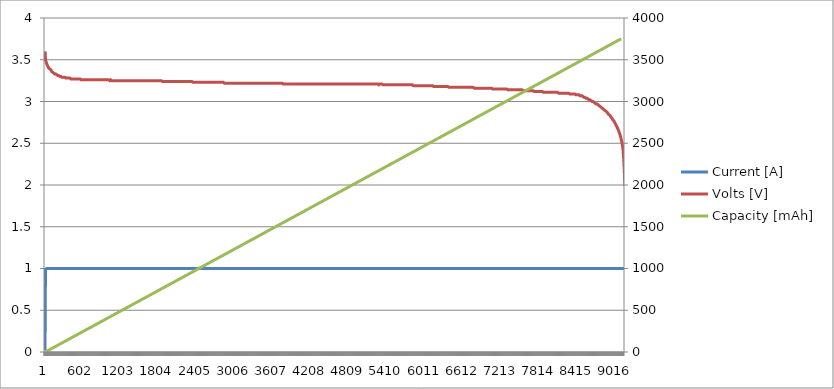
| Category | Current [A] | Volts [V] |
|---|---|---|
| 0 | 0.02 | 3.6 |
| 1 | 0.16 | 3.59 |
| 2 | 0.3 | 3.58 |
| 3 | 0.44 | 3.56 |
| 4 | 0.58 | 3.55 |
| 5 | 0.72 | 3.54 |
| 6 | 0.85 | 3.52 |
| 7 | 0.99 | 3.51 |
| 8 | 1 | 3.5 |
| 9 | 1 | 3.5 |
| 10 | 1 | 3.5 |
| 11 | 1 | 3.49 |
| 12 | 1 | 3.49 |
| 13 | 1 | 3.49 |
| 14 | 1 | 3.48 |
| 15 | 1 | 3.48 |
| 16 | 1 | 3.48 |
| 17 | 1 | 3.48 |
| 18 | 1 | 3.48 |
| 19 | 1 | 3.47 |
| 20 | 1 | 3.47 |
| 21 | 1 | 3.47 |
| 22 | 1 | 3.47 |
| 23 | 1 | 3.46 |
| 24 | 1 | 3.46 |
| 25 | 1 | 3.46 |
| 26 | 1 | 3.46 |
| 27 | 1 | 3.46 |
| 28 | 1 | 3.45 |
| 29 | 1 | 3.45 |
| 30 | 1 | 3.45 |
| 31 | 1 | 3.45 |
| 32 | 1 | 3.45 |
| 33 | 1 | 3.44 |
| 34 | 1 | 3.44 |
| 35 | 1 | 3.44 |
| 36 | 1 | 3.44 |
| 37 | 1 | 3.44 |
| 38 | 1 | 3.44 |
| 39 | 1 | 3.43 |
| 40 | 1 | 3.43 |
| 41 | 1 | 3.43 |
| 42 | 1 | 3.43 |
| 43 | 1 | 3.43 |
| 44 | 1 | 3.43 |
| 45 | 1 | 3.42 |
| 46 | 1 | 3.42 |
| 47 | 1 | 3.42 |
| 48 | 1 | 3.42 |
| 49 | 1 | 3.42 |
| 50 | 1 | 3.42 |
| 51 | 1 | 3.42 |
| 52 | 1 | 3.41 |
| 53 | 1 | 3.41 |
| 54 | 1 | 3.41 |
| 55 | 1 | 3.41 |
| 56 | 1 | 3.41 |
| 57 | 1 | 3.41 |
| 58 | 1 | 3.41 |
| 59 | 1 | 3.4 |
| 60 | 1 | 3.4 |
| 61 | 1 | 3.4 |
| 62 | 1 | 3.4 |
| 63 | 1 | 3.4 |
| 64 | 1 | 3.4 |
| 65 | 1 | 3.4 |
| 66 | 1 | 3.4 |
| 67 | 1 | 3.4 |
| 68 | 1 | 3.39 |
| 69 | 1 | 3.39 |
| 70 | 1 | 3.39 |
| 71 | 1 | 3.39 |
| 72 | 1 | 3.39 |
| 73 | 1 | 3.39 |
| 74 | 1 | 3.39 |
| 75 | 1 | 3.39 |
| 76 | 1 | 3.39 |
| 77 | 1 | 3.39 |
| 78 | 1 | 3.38 |
| 79 | 1 | 3.38 |
| 80 | 1 | 3.38 |
| 81 | 1 | 3.38 |
| 82 | 1 | 3.38 |
| 83 | 1 | 3.38 |
| 84 | 1 | 3.38 |
| 85 | 1 | 3.38 |
| 86 | 1 | 3.38 |
| 87 | 1 | 3.38 |
| 88 | 1 | 3.38 |
| 89 | 1 | 3.38 |
| 90 | 1 | 3.38 |
| 91 | 1 | 3.38 |
| 92 | 1 | 3.37 |
| 93 | 1 | 3.37 |
| 94 | 1 | 3.37 |
| 95 | 1 | 3.37 |
| 96 | 1 | 3.37 |
| 97 | 1 | 3.37 |
| 98 | 1 | 3.37 |
| 99 | 1 | 3.37 |
| 100 | 1 | 3.37 |
| 101 | 1 | 3.37 |
| 102 | 1 | 3.37 |
| 103 | 1 | 3.37 |
| 104 | 1 | 3.37 |
| 105 | 1 | 3.36 |
| 106 | 1 | 3.36 |
| 107 | 1 | 3.36 |
| 108 | 1 | 3.36 |
| 109 | 1 | 3.36 |
| 110 | 1 | 3.36 |
| 111 | 1 | 3.36 |
| 112 | 1 | 3.36 |
| 113 | 1 | 3.36 |
| 114 | 1 | 3.36 |
| 115 | 1 | 3.36 |
| 116 | 1 | 3.36 |
| 117 | 1 | 3.36 |
| 118 | 1 | 3.35 |
| 119 | 1 | 3.35 |
| 120 | 1 | 3.35 |
| 121 | 1 | 3.35 |
| 122 | 1 | 3.35 |
| 123 | 1 | 3.35 |
| 124 | 1 | 3.35 |
| 125 | 1 | 3.35 |
| 126 | 1 | 3.35 |
| 127 | 1 | 3.35 |
| 128 | 1 | 3.35 |
| 129 | 1 | 3.35 |
| 130 | 1 | 3.35 |
| 131 | 1 | 3.35 |
| 132 | 1 | 3.35 |
| 133 | 1 | 3.35 |
| 134 | 1 | 3.35 |
| 135 | 1 | 3.34 |
| 136 | 1 | 3.34 |
| 137 | 1 | 3.34 |
| 138 | 1 | 3.34 |
| 139 | 1 | 3.34 |
| 140 | 1 | 3.34 |
| 141 | 1 | 3.34 |
| 142 | 1 | 3.34 |
| 143 | 1 | 3.34 |
| 144 | 1 | 3.34 |
| 145 | 1 | 3.34 |
| 146 | 1 | 3.34 |
| 147 | 1 | 3.34 |
| 148 | 1 | 3.34 |
| 149 | 1 | 3.34 |
| 150 | 1 | 3.33 |
| 151 | 1 | 3.33 |
| 152 | 1 | 3.33 |
| 153 | 1 | 3.33 |
| 154 | 1 | 3.33 |
| 155 | 1 | 3.33 |
| 156 | 1 | 3.33 |
| 157 | 1 | 3.33 |
| 158 | 1 | 3.33 |
| 159 | 1 | 3.33 |
| 160 | 1 | 3.33 |
| 161 | 1 | 3.33 |
| 162 | 1 | 3.33 |
| 163 | 1 | 3.33 |
| 164 | 1 | 3.33 |
| 165 | 1 | 3.33 |
| 166 | 1 | 3.33 |
| 167 | 1 | 3.33 |
| 168 | 1 | 3.33 |
| 169 | 1 | 3.33 |
| 170 | 1 | 3.33 |
| 171 | 1 | 3.33 |
| 172 | 1 | 3.32 |
| 173 | 1 | 3.32 |
| 174 | 1 | 3.32 |
| 175 | 1 | 3.32 |
| 176 | 1 | 3.32 |
| 177 | 1 | 3.32 |
| 178 | 1 | 3.32 |
| 179 | 1 | 3.32 |
| 180 | 1 | 3.32 |
| 181 | 1 | 3.32 |
| 182 | 1 | 3.32 |
| 183 | 1 | 3.32 |
| 184 | 1 | 3.32 |
| 185 | 1 | 3.32 |
| 186 | 1 | 3.32 |
| 187 | 1 | 3.32 |
| 188 | 1 | 3.32 |
| 189 | 1 | 3.32 |
| 190 | 1 | 3.32 |
| 191 | 1 | 3.32 |
| 192 | 1 | 3.32 |
| 193 | 1 | 3.32 |
| 194 | 1 | 3.32 |
| 195 | 1 | 3.32 |
| 196 | 1 | 3.31 |
| 197 | 1 | 3.31 |
| 198 | 1 | 3.31 |
| 199 | 1 | 3.31 |
| 200 | 1 | 3.31 |
| 201 | 1 | 3.31 |
| 202 | 1 | 3.31 |
| 203 | 1 | 3.31 |
| 204 | 1 | 3.31 |
| 205 | 1 | 3.31 |
| 206 | 1 | 3.31 |
| 207 | 1 | 3.31 |
| 208 | 1 | 3.31 |
| 209 | 1 | 3.31 |
| 210 | 1 | 3.31 |
| 211 | 1 | 3.31 |
| 212 | 1 | 3.31 |
| 213 | 1 | 3.31 |
| 214 | 1 | 3.31 |
| 215 | 1 | 3.31 |
| 216 | 1 | 3.31 |
| 217 | 1 | 3.31 |
| 218 | 1 | 3.31 |
| 219 | 1 | 3.31 |
| 220 | 1 | 3.31 |
| 221 | 1 | 3.31 |
| 222 | 1 | 3.31 |
| 223 | 1 | 3.31 |
| 224 | 1 | 3.31 |
| 225 | 1 | 3.31 |
| 226 | 1 | 3.31 |
| 227 | 1 | 3.3 |
| 228 | 1 | 3.3 |
| 229 | 1 | 3.3 |
| 230 | 1 | 3.3 |
| 231 | 1 | 3.3 |
| 232 | 1 | 3.3 |
| 233 | 1 | 3.3 |
| 234 | 1 | 3.3 |
| 235 | 1 | 3.3 |
| 236 | 1 | 3.3 |
| 237 | 1 | 3.3 |
| 238 | 1 | 3.3 |
| 239 | 1 | 3.3 |
| 240 | 1 | 3.3 |
| 241 | 1 | 3.3 |
| 242 | 1 | 3.3 |
| 243 | 1 | 3.3 |
| 244 | 1 | 3.3 |
| 245 | 1 | 3.3 |
| 246 | 1 | 3.3 |
| 247 | 1 | 3.3 |
| 248 | 1 | 3.3 |
| 249 | 1 | 3.3 |
| 250 | 1 | 3.3 |
| 251 | 1 | 3.3 |
| 252 | 1 | 3.3 |
| 253 | 1 | 3.3 |
| 254 | 1 | 3.3 |
| 255 | 1 | 3.3 |
| 256 | 1 | 3.3 |
| 257 | 1 | 3.3 |
| 258 | 1 | 3.3 |
| 259 | 1 | 3.3 |
| 260 | 1 | 3.3 |
| 261 | 1 | 3.3 |
| 262 | 1 | 3.3 |
| 263 | 1 | 3.3 |
| 264 | 1 | 3.29 |
| 265 | 1 | 3.29 |
| 266 | 1 | 3.29 |
| 267 | 1 | 3.29 |
| 268 | 1 | 3.29 |
| 269 | 1 | 3.29 |
| 270 | 1 | 3.29 |
| 271 | 1 | 3.29 |
| 272 | 1 | 3.29 |
| 273 | 1 | 3.29 |
| 274 | 1 | 3.29 |
| 275 | 1 | 3.29 |
| 276 | 1 | 3.29 |
| 277 | 1 | 3.29 |
| 278 | 1 | 3.29 |
| 279 | 1 | 3.29 |
| 280 | 1 | 3.29 |
| 281 | 1 | 3.29 |
| 282 | 1 | 3.29 |
| 283 | 1 | 3.29 |
| 284 | 1 | 3.29 |
| 285 | 1 | 3.29 |
| 286 | 1 | 3.29 |
| 287 | 1 | 3.29 |
| 288 | 1 | 3.29 |
| 289 | 1 | 3.29 |
| 290 | 1 | 3.29 |
| 291 | 1 | 3.29 |
| 292 | 1 | 3.29 |
| 293 | 1 | 3.29 |
| 294 | 1 | 3.29 |
| 295 | 1 | 3.29 |
| 296 | 1 | 3.29 |
| 297 | 1 | 3.29 |
| 298 | 1 | 3.29 |
| 299 | 1 | 3.29 |
| 300 | 1 | 3.29 |
| 301 | 1 | 3.29 |
| 302 | 1 | 3.29 |
| 303 | 1 | 3.29 |
| 304 | 1 | 3.29 |
| 305 | 1 | 3.29 |
| 306 | 1 | 3.29 |
| 307 | 1 | 3.29 |
| 308 | 1 | 3.29 |
| 309 | 1 | 3.29 |
| 310 | 1 | 3.29 |
| 311 | 1 | 3.29 |
| 312 | 1 | 3.29 |
| 313 | 1 | 3.29 |
| 314 | 1 | 3.29 |
| 315 | 1 | 3.29 |
| 316 | 1 | 3.29 |
| 317 | 1 | 3.29 |
| 318 | 1 | 3.28 |
| 319 | 1 | 3.28 |
| 320 | 1 | 3.28 |
| 321 | 1 | 3.28 |
| 322 | 1 | 3.28 |
| 323 | 1 | 3.28 |
| 324 | 1 | 3.28 |
| 325 | 1 | 3.28 |
| 326 | 1 | 3.28 |
| 327 | 1 | 3.28 |
| 328 | 1 | 3.28 |
| 329 | 1 | 3.28 |
| 330 | 1 | 3.28 |
| 331 | 1 | 3.28 |
| 332 | 1 | 3.28 |
| 333 | 1 | 3.28 |
| 334 | 1 | 3.28 |
| 335 | 1 | 3.28 |
| 336 | 1 | 3.28 |
| 337 | 1 | 3.28 |
| 338 | 1 | 3.28 |
| 339 | 1 | 3.28 |
| 340 | 1 | 3.28 |
| 341 | 1 | 3.28 |
| 342 | 1 | 3.28 |
| 343 | 1 | 3.28 |
| 344 | 1 | 3.28 |
| 345 | 1 | 3.28 |
| 346 | 1 | 3.28 |
| 347 | 1 | 3.28 |
| 348 | 1 | 3.28 |
| 349 | 1 | 3.28 |
| 350 | 1 | 3.28 |
| 351 | 1 | 3.28 |
| 352 | 1 | 3.28 |
| 353 | 1 | 3.28 |
| 354 | 1 | 3.28 |
| 355 | 1 | 3.28 |
| 356 | 1 | 3.28 |
| 357 | 1 | 3.28 |
| 358 | 1 | 3.28 |
| 359 | 1 | 3.28 |
| 360 | 1 | 3.28 |
| 361 | 1 | 3.28 |
| 362 | 1 | 3.28 |
| 363 | 1 | 3.28 |
| 364 | 1 | 3.28 |
| 365 | 1 | 3.28 |
| 366 | 1 | 3.28 |
| 367 | 1 | 3.28 |
| 368 | 1 | 3.28 |
| 369 | 1 | 3.28 |
| 370 | 1 | 3.28 |
| 371 | 1 | 3.28 |
| 372 | 1 | 3.28 |
| 373 | 1 | 3.28 |
| 374 | 1 | 3.28 |
| 375 | 1 | 3.28 |
| 376 | 1 | 3.28 |
| 377 | 1 | 3.28 |
| 378 | 1 | 3.28 |
| 379 | 1 | 3.28 |
| 380 | 1 | 3.28 |
| 381 | 1 | 3.28 |
| 382 | 1 | 3.28 |
| 383 | 1 | 3.28 |
| 384 | 1 | 3.28 |
| 385 | 1 | 3.28 |
| 386 | 1 | 3.28 |
| 387 | 1 | 3.28 |
| 388 | 1 | 3.28 |
| 389 | 1 | 3.28 |
| 390 | 1 | 3.28 |
| 391 | 1 | 3.28 |
| 392 | 1 | 3.28 |
| 393 | 1 | 3.28 |
| 394 | 1 | 3.28 |
| 395 | 1 | 3.27 |
| 396 | 1 | 3.28 |
| 397 | 1 | 3.27 |
| 398 | 1 | 3.27 |
| 399 | 1 | 3.27 |
| 400 | 1 | 3.27 |
| 401 | 1 | 3.27 |
| 402 | 1 | 3.27 |
| 403 | 1 | 3.27 |
| 404 | 1 | 3.27 |
| 405 | 1 | 3.27 |
| 406 | 1 | 3.27 |
| 407 | 1 | 3.27 |
| 408 | 1 | 3.27 |
| 409 | 1 | 3.27 |
| 410 | 1 | 3.27 |
| 411 | 1 | 3.27 |
| 412 | 1 | 3.27 |
| 413 | 1 | 3.27 |
| 414 | 1 | 3.27 |
| 415 | 1 | 3.27 |
| 416 | 1 | 3.27 |
| 417 | 1 | 3.27 |
| 418 | 1 | 3.27 |
| 419 | 1 | 3.27 |
| 420 | 1 | 3.27 |
| 421 | 1 | 3.27 |
| 422 | 1 | 3.27 |
| 423 | 1 | 3.27 |
| 424 | 1 | 3.27 |
| 425 | 1 | 3.27 |
| 426 | 1 | 3.27 |
| 427 | 1 | 3.27 |
| 428 | 1 | 3.27 |
| 429 | 1 | 3.27 |
| 430 | 1 | 3.27 |
| 431 | 1 | 3.27 |
| 432 | 1 | 3.27 |
| 433 | 1 | 3.27 |
| 434 | 1 | 3.27 |
| 435 | 1 | 3.27 |
| 436 | 1 | 3.27 |
| 437 | 1 | 3.27 |
| 438 | 1 | 3.27 |
| 439 | 1 | 3.27 |
| 440 | 1 | 3.27 |
| 441 | 1 | 3.27 |
| 442 | 1 | 3.27 |
| 443 | 1 | 3.27 |
| 444 | 1 | 3.27 |
| 445 | 1 | 3.27 |
| 446 | 1 | 3.27 |
| 447 | 1 | 3.27 |
| 448 | 1 | 3.27 |
| 449 | 1 | 3.27 |
| 450 | 1 | 3.27 |
| 451 | 1 | 3.27 |
| 452 | 1 | 3.27 |
| 453 | 1 | 3.27 |
| 454 | 1 | 3.27 |
| 455 | 1 | 3.27 |
| 456 | 1 | 3.27 |
| 457 | 1 | 3.27 |
| 458 | 1 | 3.27 |
| 459 | 1 | 3.27 |
| 460 | 1 | 3.27 |
| 461 | 1 | 3.27 |
| 462 | 1 | 3.27 |
| 463 | 1 | 3.27 |
| 464 | 1 | 3.27 |
| 465 | 1 | 3.27 |
| 466 | 1 | 3.27 |
| 467 | 1 | 3.27 |
| 468 | 1 | 3.27 |
| 469 | 1 | 3.27 |
| 470 | 1 | 3.27 |
| 471 | 1 | 3.27 |
| 472 | 1 | 3.27 |
| 473 | 1 | 3.27 |
| 474 | 1 | 3.27 |
| 475 | 1 | 3.27 |
| 476 | 1 | 3.27 |
| 477 | 1 | 3.27 |
| 478 | 1 | 3.27 |
| 479 | 1 | 3.27 |
| 480 | 1 | 3.27 |
| 481 | 1 | 3.27 |
| 482 | 1 | 3.27 |
| 483 | 1 | 3.27 |
| 484 | 1 | 3.27 |
| 485 | 1 | 3.27 |
| 486 | 1 | 3.27 |
| 487 | 1 | 3.27 |
| 488 | 1 | 3.27 |
| 489 | 1 | 3.27 |
| 490 | 1 | 3.27 |
| 491 | 1 | 3.27 |
| 492 | 1 | 3.27 |
| 493 | 1 | 3.27 |
| 494 | 1 | 3.27 |
| 495 | 1 | 3.27 |
| 496 | 1 | 3.27 |
| 497 | 1 | 3.27 |
| 498 | 1 | 3.27 |
| 499 | 1 | 3.27 |
| 500 | 1 | 3.27 |
| 501 | 1 | 3.27 |
| 502 | 1 | 3.27 |
| 503 | 1 | 3.27 |
| 504 | 1 | 3.27 |
| 505 | 1 | 3.27 |
| 506 | 1 | 3.27 |
| 507 | 1 | 3.27 |
| 508 | 1 | 3.27 |
| 509 | 1 | 3.27 |
| 510 | 1 | 3.27 |
| 511 | 1 | 3.27 |
| 512 | 1 | 3.27 |
| 513 | 1 | 3.27 |
| 514 | 1 | 3.27 |
| 515 | 1 | 3.27 |
| 516 | 1 | 3.27 |
| 517 | 1 | 3.27 |
| 518 | 1 | 3.27 |
| 519 | 1 | 3.27 |
| 520 | 1 | 3.27 |
| 521 | 1 | 3.27 |
| 522 | 1 | 3.27 |
| 523 | 1 | 3.27 |
| 524 | 1 | 3.27 |
| 525 | 1 | 3.27 |
| 526 | 1 | 3.27 |
| 527 | 1 | 3.27 |
| 528 | 1 | 3.27 |
| 529 | 1 | 3.27 |
| 530 | 1 | 3.27 |
| 531 | 1 | 3.27 |
| 532 | 1 | 3.27 |
| 533 | 1 | 3.27 |
| 534 | 1 | 3.27 |
| 535 | 1 | 3.27 |
| 536 | 1 | 3.27 |
| 537 | 1 | 3.27 |
| 538 | 1 | 3.27 |
| 539 | 1 | 3.27 |
| 540 | 1 | 3.27 |
| 541 | 1 | 3.27 |
| 542 | 1 | 3.27 |
| 543 | 1 | 3.27 |
| 544 | 1 | 3.27 |
| 545 | 1 | 3.27 |
| 546 | 1 | 3.27 |
| 547 | 1 | 3.27 |
| 548 | 1 | 3.27 |
| 549 | 1 | 3.27 |
| 550 | 1 | 3.27 |
| 551 | 1 | 3.27 |
| 552 | 1 | 3.27 |
| 553 | 1 | 3.27 |
| 554 | 1 | 3.27 |
| 555 | 1 | 3.27 |
| 556 | 1 | 3.27 |
| 557 | 1 | 3.27 |
| 558 | 1 | 3.27 |
| 559 | 1 | 3.27 |
| 560 | 1 | 3.26 |
| 561 | 1 | 3.26 |
| 562 | 1 | 3.26 |
| 563 | 1 | 3.27 |
| 564 | 1 | 3.26 |
| 565 | 1 | 3.26 |
| 566 | 1 | 3.26 |
| 567 | 1 | 3.26 |
| 568 | 1 | 3.26 |
| 569 | 1 | 3.26 |
| 570 | 1 | 3.26 |
| 571 | 1 | 3.26 |
| 572 | 1 | 3.26 |
| 573 | 1 | 3.26 |
| 574 | 1 | 3.26 |
| 575 | 1 | 3.26 |
| 576 | 1 | 3.26 |
| 577 | 1 | 3.26 |
| 578 | 1 | 3.26 |
| 579 | 1 | 3.26 |
| 580 | 1 | 3.26 |
| 581 | 1 | 3.26 |
| 582 | 1 | 3.26 |
| 583 | 1 | 3.26 |
| 584 | 1 | 3.26 |
| 585 | 1 | 3.26 |
| 586 | 1 | 3.26 |
| 587 | 1 | 3.26 |
| 588 | 1 | 3.26 |
| 589 | 1 | 3.26 |
| 590 | 1 | 3.26 |
| 591 | 1 | 3.26 |
| 592 | 1 | 3.26 |
| 593 | 1 | 3.26 |
| 594 | 1 | 3.26 |
| 595 | 1 | 3.26 |
| 596 | 1 | 3.26 |
| 597 | 1 | 3.26 |
| 598 | 1 | 3.26 |
| 599 | 1 | 3.26 |
| 600 | 1 | 3.26 |
| 601 | 1 | 3.26 |
| 602 | 1 | 3.26 |
| 603 | 1 | 3.26 |
| 604 | 1 | 3.26 |
| 605 | 1 | 3.26 |
| 606 | 1 | 3.26 |
| 607 | 1 | 3.26 |
| 608 | 1 | 3.26 |
| 609 | 1 | 3.26 |
| 610 | 1 | 3.26 |
| 611 | 1 | 3.26 |
| 612 | 1 | 3.26 |
| 613 | 1 | 3.26 |
| 614 | 1 | 3.26 |
| 615 | 1 | 3.26 |
| 616 | 1 | 3.26 |
| 617 | 1 | 3.26 |
| 618 | 1 | 3.26 |
| 619 | 1 | 3.26 |
| 620 | 1 | 3.26 |
| 621 | 1 | 3.26 |
| 622 | 1 | 3.26 |
| 623 | 1 | 3.26 |
| 624 | 1 | 3.26 |
| 625 | 1 | 3.26 |
| 626 | 1 | 3.26 |
| 627 | 1 | 3.26 |
| 628 | 1 | 3.26 |
| 629 | 1 | 3.26 |
| 630 | 1 | 3.26 |
| 631 | 1 | 3.26 |
| 632 | 1 | 3.26 |
| 633 | 1 | 3.26 |
| 634 | 1 | 3.26 |
| 635 | 1 | 3.26 |
| 636 | 1 | 3.26 |
| 637 | 1 | 3.26 |
| 638 | 1 | 3.26 |
| 639 | 1 | 3.26 |
| 640 | 1 | 3.26 |
| 641 | 1 | 3.26 |
| 642 | 1 | 3.26 |
| 643 | 1 | 3.26 |
| 644 | 1 | 3.26 |
| 645 | 1 | 3.26 |
| 646 | 1 | 3.26 |
| 647 | 1 | 3.26 |
| 648 | 1 | 3.26 |
| 649 | 1 | 3.26 |
| 650 | 1 | 3.26 |
| 651 | 1 | 3.26 |
| 652 | 1 | 3.26 |
| 653 | 1 | 3.26 |
| 654 | 1 | 3.26 |
| 655 | 1 | 3.26 |
| 656 | 1 | 3.26 |
| 657 | 1 | 3.26 |
| 658 | 1 | 3.26 |
| 659 | 1 | 3.26 |
| 660 | 1 | 3.26 |
| 661 | 1 | 3.26 |
| 662 | 1 | 3.26 |
| 663 | 1 | 3.26 |
| 664 | 1 | 3.26 |
| 665 | 1 | 3.26 |
| 666 | 1 | 3.26 |
| 667 | 1 | 3.26 |
| 668 | 1 | 3.26 |
| 669 | 1 | 3.26 |
| 670 | 1 | 3.26 |
| 671 | 1 | 3.26 |
| 672 | 1 | 3.26 |
| 673 | 1 | 3.26 |
| 674 | 1 | 3.26 |
| 675 | 1 | 3.26 |
| 676 | 1 | 3.26 |
| 677 | 1 | 3.26 |
| 678 | 1 | 3.26 |
| 679 | 1 | 3.26 |
| 680 | 1 | 3.26 |
| 681 | 1 | 3.26 |
| 682 | 1 | 3.26 |
| 683 | 1 | 3.26 |
| 684 | 1 | 3.26 |
| 685 | 1 | 3.26 |
| 686 | 1 | 3.26 |
| 687 | 1 | 3.26 |
| 688 | 1 | 3.26 |
| 689 | 1 | 3.26 |
| 690 | 1 | 3.26 |
| 691 | 1 | 3.26 |
| 692 | 1 | 3.26 |
| 693 | 1 | 3.26 |
| 694 | 1 | 3.26 |
| 695 | 1 | 3.26 |
| 696 | 1 | 3.26 |
| 697 | 1 | 3.26 |
| 698 | 1 | 3.26 |
| 699 | 1 | 3.26 |
| 700 | 1 | 3.26 |
| 701 | 1 | 3.26 |
| 702 | 1 | 3.26 |
| 703 | 1 | 3.26 |
| 704 | 1 | 3.26 |
| 705 | 1 | 3.26 |
| 706 | 1 | 3.26 |
| 707 | 1 | 3.26 |
| 708 | 1 | 3.26 |
| 709 | 1 | 3.26 |
| 710 | 1 | 3.26 |
| 711 | 1 | 3.26 |
| 712 | 1 | 3.26 |
| 713 | 1 | 3.26 |
| 714 | 1 | 3.26 |
| 715 | 1 | 3.26 |
| 716 | 1 | 3.26 |
| 717 | 1 | 3.26 |
| 718 | 1 | 3.26 |
| 719 | 1 | 3.26 |
| 720 | 1 | 3.26 |
| 721 | 1 | 3.26 |
| 722 | 1 | 3.26 |
| 723 | 1 | 3.26 |
| 724 | 1 | 3.26 |
| 725 | 1 | 3.26 |
| 726 | 1 | 3.26 |
| 727 | 1 | 3.26 |
| 728 | 1 | 3.26 |
| 729 | 1 | 3.26 |
| 730 | 1 | 3.26 |
| 731 | 1 | 3.26 |
| 732 | 1 | 3.26 |
| 733 | 1 | 3.26 |
| 734 | 1 | 3.26 |
| 735 | 1 | 3.26 |
| 736 | 1 | 3.26 |
| 737 | 1 | 3.26 |
| 738 | 1 | 3.26 |
| 739 | 1 | 3.26 |
| 740 | 1 | 3.26 |
| 741 | 1 | 3.26 |
| 742 | 1 | 3.26 |
| 743 | 1 | 3.26 |
| 744 | 1 | 3.26 |
| 745 | 1 | 3.26 |
| 746 | 1 | 3.26 |
| 747 | 1 | 3.26 |
| 748 | 1 | 3.26 |
| 749 | 1 | 3.26 |
| 750 | 1 | 3.26 |
| 751 | 1 | 3.26 |
| 752 | 1 | 3.26 |
| 753 | 1 | 3.26 |
| 754 | 1 | 3.26 |
| 755 | 1 | 3.26 |
| 756 | 1 | 3.26 |
| 757 | 1 | 3.26 |
| 758 | 1 | 3.26 |
| 759 | 1 | 3.26 |
| 760 | 1 | 3.26 |
| 761 | 1 | 3.26 |
| 762 | 1 | 3.26 |
| 763 | 1 | 3.26 |
| 764 | 1 | 3.26 |
| 765 | 1 | 3.26 |
| 766 | 1 | 3.26 |
| 767 | 1 | 3.26 |
| 768 | 1 | 3.26 |
| 769 | 1 | 3.26 |
| 770 | 1 | 3.26 |
| 771 | 1 | 3.26 |
| 772 | 1 | 3.26 |
| 773 | 1 | 3.26 |
| 774 | 1 | 3.26 |
| 775 | 1 | 3.26 |
| 776 | 1 | 3.26 |
| 777 | 1 | 3.26 |
| 778 | 1 | 3.26 |
| 779 | 1 | 3.26 |
| 780 | 1 | 3.26 |
| 781 | 1 | 3.26 |
| 782 | 1 | 3.26 |
| 783 | 1 | 3.26 |
| 784 | 1 | 3.26 |
| 785 | 1 | 3.26 |
| 786 | 1 | 3.26 |
| 787 | 1 | 3.26 |
| 788 | 1 | 3.26 |
| 789 | 1 | 3.26 |
| 790 | 1 | 3.26 |
| 791 | 1 | 3.26 |
| 792 | 1 | 3.26 |
| 793 | 1 | 3.26 |
| 794 | 1 | 3.26 |
| 795 | 1 | 3.26 |
| 796 | 1 | 3.26 |
| 797 | 1 | 3.26 |
| 798 | 1 | 3.26 |
| 799 | 1 | 3.26 |
| 800 | 1 | 3.26 |
| 801 | 1 | 3.26 |
| 802 | 1 | 3.26 |
| 803 | 1 | 3.26 |
| 804 | 1 | 3.26 |
| 805 | 1 | 3.26 |
| 806 | 1 | 3.26 |
| 807 | 1 | 3.26 |
| 808 | 1 | 3.26 |
| 809 | 1 | 3.26 |
| 810 | 1 | 3.26 |
| 811 | 1 | 3.26 |
| 812 | 1 | 3.26 |
| 813 | 1 | 3.26 |
| 814 | 1 | 3.26 |
| 815 | 1 | 3.26 |
| 816 | 1 | 3.26 |
| 817 | 1 | 3.26 |
| 818 | 1 | 3.26 |
| 819 | 1 | 3.26 |
| 820 | 1 | 3.26 |
| 821 | 1 | 3.26 |
| 822 | 1 | 3.26 |
| 823 | 1 | 3.26 |
| 824 | 1 | 3.26 |
| 825 | 1 | 3.26 |
| 826 | 1 | 3.26 |
| 827 | 1 | 3.26 |
| 828 | 1 | 3.26 |
| 829 | 1 | 3.26 |
| 830 | 1 | 3.26 |
| 831 | 1 | 3.26 |
| 832 | 1 | 3.26 |
| 833 | 1 | 3.26 |
| 834 | 1 | 3.26 |
| 835 | 1 | 3.26 |
| 836 | 1 | 3.26 |
| 837 | 1 | 3.26 |
| 838 | 1 | 3.26 |
| 839 | 1 | 3.26 |
| 840 | 1 | 3.26 |
| 841 | 1 | 3.26 |
| 842 | 1 | 3.26 |
| 843 | 1 | 3.26 |
| 844 | 1 | 3.26 |
| 845 | 1 | 3.26 |
| 846 | 1 | 3.26 |
| 847 | 1 | 3.26 |
| 848 | 1 | 3.26 |
| 849 | 1 | 3.26 |
| 850 | 1 | 3.26 |
| 851 | 1 | 3.26 |
| 852 | 1 | 3.26 |
| 853 | 1 | 3.26 |
| 854 | 1 | 3.26 |
| 855 | 1 | 3.26 |
| 856 | 1 | 3.26 |
| 857 | 1 | 3.26 |
| 858 | 1 | 3.26 |
| 859 | 1 | 3.26 |
| 860 | 1 | 3.26 |
| 861 | 1 | 3.26 |
| 862 | 1 | 3.26 |
| 863 | 1 | 3.26 |
| 864 | 1 | 3.26 |
| 865 | 1 | 3.26 |
| 866 | 1 | 3.26 |
| 867 | 1 | 3.26 |
| 868 | 1 | 3.26 |
| 869 | 1 | 3.26 |
| 870 | 1 | 3.26 |
| 871 | 1 | 3.26 |
| 872 | 1 | 3.26 |
| 873 | 1 | 3.26 |
| 874 | 1 | 3.26 |
| 875 | 1 | 3.26 |
| 876 | 1 | 3.26 |
| 877 | 1 | 3.26 |
| 878 | 1 | 3.26 |
| 879 | 1 | 3.26 |
| 880 | 1 | 3.26 |
| 881 | 1 | 3.26 |
| 882 | 1 | 3.26 |
| 883 | 1 | 3.26 |
| 884 | 1 | 3.26 |
| 885 | 1 | 3.26 |
| 886 | 1 | 3.26 |
| 887 | 1 | 3.26 |
| 888 | 1 | 3.26 |
| 889 | 1 | 3.26 |
| 890 | 1 | 3.26 |
| 891 | 1 | 3.26 |
| 892 | 1 | 3.26 |
| 893 | 1 | 3.26 |
| 894 | 1 | 3.26 |
| 895 | 1 | 3.26 |
| 896 | 1 | 3.26 |
| 897 | 1 | 3.26 |
| 898 | 1 | 3.26 |
| 899 | 1 | 3.26 |
| 900 | 1 | 3.26 |
| 901 | 1 | 3.26 |
| 902 | 1 | 3.26 |
| 903 | 1 | 3.26 |
| 904 | 1 | 3.26 |
| 905 | 1 | 3.26 |
| 906 | 1 | 3.26 |
| 907 | 1 | 3.26 |
| 908 | 1 | 3.26 |
| 909 | 1 | 3.26 |
| 910 | 1 | 3.26 |
| 911 | 1 | 3.26 |
| 912 | 1 | 3.26 |
| 913 | 1 | 3.26 |
| 914 | 1 | 3.26 |
| 915 | 1 | 3.26 |
| 916 | 1 | 3.26 |
| 917 | 1 | 3.26 |
| 918 | 1 | 3.26 |
| 919 | 1 | 3.26 |
| 920 | 1 | 3.26 |
| 921 | 1 | 3.26 |
| 922 | 1 | 3.26 |
| 923 | 1 | 3.26 |
| 924 | 1 | 3.26 |
| 925 | 1 | 3.26 |
| 926 | 1 | 3.26 |
| 927 | 1 | 3.26 |
| 928 | 1 | 3.26 |
| 929 | 1 | 3.26 |
| 930 | 1 | 3.26 |
| 931 | 1 | 3.26 |
| 932 | 1 | 3.26 |
| 933 | 1 | 3.26 |
| 934 | 1 | 3.26 |
| 935 | 1 | 3.26 |
| 936 | 1 | 3.26 |
| 937 | 1 | 3.26 |
| 938 | 1 | 3.26 |
| 939 | 1 | 3.26 |
| 940 | 1 | 3.26 |
| 941 | 1 | 3.26 |
| 942 | 1 | 3.26 |
| 943 | 1 | 3.26 |
| 944 | 1 | 3.26 |
| 945 | 1 | 3.26 |
| 946 | 1 | 3.26 |
| 947 | 1 | 3.26 |
| 948 | 1 | 3.26 |
| 949 | 1 | 3.26 |
| 950 | 1 | 3.26 |
| 951 | 1 | 3.26 |
| 952 | 1 | 3.26 |
| 953 | 1 | 3.26 |
| 954 | 1 | 3.26 |
| 955 | 1 | 3.26 |
| 956 | 1 | 3.26 |
| 957 | 1 | 3.26 |
| 958 | 1 | 3.26 |
| 959 | 1 | 3.26 |
| 960 | 1 | 3.26 |
| 961 | 1 | 3.26 |
| 962 | 1 | 3.26 |
| 963 | 1 | 3.26 |
| 964 | 1 | 3.26 |
| 965 | 1 | 3.26 |
| 966 | 1 | 3.26 |
| 967 | 1 | 3.26 |
| 968 | 1 | 3.26 |
| 969 | 1 | 3.26 |
| 970 | 1 | 3.26 |
| 971 | 1 | 3.26 |
| 972 | 1 | 3.26 |
| 973 | 1 | 3.26 |
| 974 | 1 | 3.26 |
| 975 | 1 | 3.26 |
| 976 | 1 | 3.26 |
| 977 | 1 | 3.26 |
| 978 | 1 | 3.26 |
| 979 | 1 | 3.26 |
| 980 | 1 | 3.26 |
| 981 | 1 | 3.25 |
| 982 | 1 | 3.25 |
| 983 | 1 | 3.26 |
| 984 | 1 | 3.26 |
| 985 | 1 | 3.26 |
| 986 | 1 | 3.25 |
| 987 | 1 | 3.26 |
| 988 | 1 | 3.26 |
| 989 | 1 | 3.25 |
| 990 | 1 | 3.25 |
| 991 | 1 | 3.26 |
| 992 | 1 | 3.26 |
| 993 | 1 | 3.25 |
| 994 | 1 | 3.25 |
| 995 | 1 | 3.26 |
| 996 | 1 | 3.25 |
| 997 | 1 | 3.25 |
| 998 | 1 | 3.25 |
| 999 | 1 | 3.25 |
| 1000 | 1 | 3.25 |
| 1001 | 1 | 3.26 |
| 1002 | 1 | 3.26 |
| 1003 | 1 | 3.25 |
| 1004 | 1 | 3.25 |
| 1005 | 1 | 3.26 |
| 1006 | 1 | 3.25 |
| 1007 | 1 | 3.26 |
| 1008 | 1 | 3.25 |
| 1009 | 1 | 3.25 |
| 1010 | 1 | 3.25 |
| 1011 | 1 | 3.25 |
| 1012 | 1 | 3.25 |
| 1013 | 1 | 3.25 |
| 1014 | 1 | 3.25 |
| 1015 | 1 | 3.25 |
| 1016 | 1 | 3.26 |
| 1017 | 1 | 3.25 |
| 1018 | 1 | 3.25 |
| 1019 | 1 | 3.25 |
| 1020 | 1 | 3.25 |
| 1021 | 1 | 3.25 |
| 1022 | 1 | 3.25 |
| 1023 | 1 | 3.25 |
| 1024 | 1 | 3.25 |
| 1025 | 1 | 3.25 |
| 1026 | 1 | 3.25 |
| 1027 | 1 | 3.25 |
| 1028 | 1 | 3.25 |
| 1029 | 1 | 3.25 |
| 1030 | 1 | 3.25 |
| 1031 | 1 | 3.25 |
| 1032 | 1 | 3.26 |
| 1033 | 1 | 3.26 |
| 1034 | 1 | 3.25 |
| 1035 | 1 | 3.25 |
| 1036 | 1 | 3.25 |
| 1037 | 1 | 3.25 |
| 1038 | 1 | 3.25 |
| 1039 | 1 | 3.25 |
| 1040 | 1 | 3.25 |
| 1041 | 1 | 3.25 |
| 1042 | 1 | 3.25 |
| 1043 | 1 | 3.25 |
| 1044 | 1 | 3.25 |
| 1045 | 1 | 3.26 |
| 1046 | 1 | 3.25 |
| 1047 | 1 | 3.25 |
| 1048 | 1 | 3.25 |
| 1049 | 1 | 3.25 |
| 1050 | 1 | 3.25 |
| 1051 | 1 | 3.25 |
| 1052 | 1 | 3.25 |
| 1053 | 1 | 3.25 |
| 1054 | 1 | 3.25 |
| 1055 | 1 | 3.25 |
| 1056 | 1 | 3.25 |
| 1057 | 1 | 3.25 |
| 1058 | 1 | 3.25 |
| 1059 | 1 | 3.25 |
| 1060 | 1 | 3.25 |
| 1061 | 1 | 3.25 |
| 1062 | 1 | 3.25 |
| 1063 | 1 | 3.25 |
| 1064 | 1 | 3.25 |
| 1065 | 1 | 3.25 |
| 1066 | 1 | 3.25 |
| 1067 | 1 | 3.25 |
| 1068 | 1 | 3.25 |
| 1069 | 1 | 3.25 |
| 1070 | 1 | 3.25 |
| 1071 | 1 | 3.25 |
| 1072 | 1 | 3.25 |
| 1073 | 1 | 3.25 |
| 1074 | 1 | 3.25 |
| 1075 | 1 | 3.25 |
| 1076 | 1 | 3.25 |
| 1077 | 1 | 3.25 |
| 1078 | 1 | 3.25 |
| 1079 | 1 | 3.25 |
| 1080 | 1 | 3.25 |
| 1081 | 1 | 3.25 |
| 1082 | 1 | 3.25 |
| 1083 | 1 | 3.25 |
| 1084 | 1 | 3.25 |
| 1085 | 1 | 3.25 |
| 1086 | 1 | 3.25 |
| 1087 | 1 | 3.25 |
| 1088 | 1 | 3.25 |
| 1089 | 1 | 3.25 |
| 1090 | 1 | 3.25 |
| 1091 | 1 | 3.25 |
| 1092 | 1 | 3.25 |
| 1093 | 1 | 3.25 |
| 1094 | 1 | 3.25 |
| 1095 | 1 | 3.25 |
| 1096 | 1 | 3.25 |
| 1097 | 1 | 3.25 |
| 1098 | 1 | 3.25 |
| 1099 | 1 | 3.25 |
| 1100 | 1 | 3.25 |
| 1101 | 1 | 3.25 |
| 1102 | 1 | 3.25 |
| 1103 | 1 | 3.25 |
| 1104 | 1 | 3.25 |
| 1105 | 1 | 3.25 |
| 1106 | 1 | 3.25 |
| 1107 | 1 | 3.25 |
| 1108 | 1 | 3.25 |
| 1109 | 1 | 3.25 |
| 1110 | 1 | 3.25 |
| 1111 | 1 | 3.25 |
| 1112 | 1 | 3.25 |
| 1113 | 1 | 3.25 |
| 1114 | 1 | 3.25 |
| 1115 | 1 | 3.25 |
| 1116 | 1 | 3.25 |
| 1117 | 1 | 3.25 |
| 1118 | 1 | 3.25 |
| 1119 | 1 | 3.25 |
| 1120 | 1 | 3.25 |
| 1121 | 1 | 3.25 |
| 1122 | 1 | 3.25 |
| 1123 | 1 | 3.25 |
| 1124 | 1 | 3.25 |
| 1125 | 1 | 3.25 |
| 1126 | 1 | 3.25 |
| 1127 | 1 | 3.25 |
| 1128 | 1 | 3.25 |
| 1129 | 1 | 3.25 |
| 1130 | 1 | 3.25 |
| 1131 | 1 | 3.25 |
| 1132 | 1 | 3.25 |
| 1133 | 1 | 3.25 |
| 1134 | 1 | 3.25 |
| 1135 | 1 | 3.25 |
| 1136 | 1 | 3.25 |
| 1137 | 1 | 3.25 |
| 1138 | 1 | 3.25 |
| 1139 | 1 | 3.25 |
| 1140 | 1 | 3.25 |
| 1141 | 1 | 3.25 |
| 1142 | 1 | 3.25 |
| 1143 | 1 | 3.25 |
| 1144 | 1 | 3.25 |
| 1145 | 1 | 3.25 |
| 1146 | 1 | 3.25 |
| 1147 | 1 | 3.25 |
| 1148 | 1 | 3.25 |
| 1149 | 1 | 3.25 |
| 1150 | 1 | 3.25 |
| 1151 | 1 | 3.25 |
| 1152 | 1 | 3.25 |
| 1153 | 1 | 3.25 |
| 1154 | 1 | 3.25 |
| 1155 | 1 | 3.25 |
| 1156 | 1 | 3.25 |
| 1157 | 1 | 3.25 |
| 1158 | 1 | 3.25 |
| 1159 | 1 | 3.25 |
| 1160 | 1 | 3.25 |
| 1161 | 1 | 3.25 |
| 1162 | 1 | 3.25 |
| 1163 | 1 | 3.25 |
| 1164 | 1 | 3.25 |
| 1165 | 1 | 3.25 |
| 1166 | 1 | 3.25 |
| 1167 | 1 | 3.25 |
| 1168 | 1 | 3.25 |
| 1169 | 1 | 3.25 |
| 1170 | 1 | 3.25 |
| 1171 | 1 | 3.25 |
| 1172 | 1 | 3.25 |
| 1173 | 1 | 3.25 |
| 1174 | 1 | 3.25 |
| 1175 | 1 | 3.25 |
| 1176 | 1 | 3.25 |
| 1177 | 1 | 3.25 |
| 1178 | 1 | 3.25 |
| 1179 | 1 | 3.25 |
| 1180 | 1 | 3.25 |
| 1181 | 1 | 3.25 |
| 1182 | 1 | 3.25 |
| 1183 | 1 | 3.25 |
| 1184 | 1 | 3.25 |
| 1185 | 1 | 3.25 |
| 1186 | 1 | 3.25 |
| 1187 | 1 | 3.25 |
| 1188 | 1 | 3.25 |
| 1189 | 1 | 3.25 |
| 1190 | 1 | 3.25 |
| 1191 | 1 | 3.25 |
| 1192 | 1 | 3.25 |
| 1193 | 1 | 3.25 |
| 1194 | 1 | 3.25 |
| 1195 | 1 | 3.25 |
| 1196 | 1 | 3.25 |
| 1197 | 1 | 3.25 |
| 1198 | 1 | 3.25 |
| 1199 | 1 | 3.25 |
| 1200 | 1 | 3.25 |
| 1201 | 1 | 3.25 |
| 1202 | 1 | 3.25 |
| 1203 | 1 | 3.25 |
| 1204 | 1 | 3.25 |
| 1205 | 1 | 3.25 |
| 1206 | 1 | 3.25 |
| 1207 | 1 | 3.25 |
| 1208 | 1 | 3.25 |
| 1209 | 1 | 3.25 |
| 1210 | 1 | 3.25 |
| 1211 | 1 | 3.25 |
| 1212 | 1 | 3.25 |
| 1213 | 1 | 3.25 |
| 1214 | 1 | 3.25 |
| 1215 | 1 | 3.25 |
| 1216 | 1 | 3.25 |
| 1217 | 1 | 3.25 |
| 1218 | 1 | 3.25 |
| 1219 | 1 | 3.25 |
| 1220 | 1 | 3.25 |
| 1221 | 1 | 3.25 |
| 1222 | 1 | 3.25 |
| 1223 | 1 | 3.25 |
| 1224 | 1 | 3.25 |
| 1225 | 1 | 3.25 |
| 1226 | 1 | 3.25 |
| 1227 | 1 | 3.25 |
| 1228 | 1 | 3.25 |
| 1229 | 1 | 3.25 |
| 1230 | 1 | 3.25 |
| 1231 | 1 | 3.25 |
| 1232 | 1 | 3.25 |
| 1233 | 1 | 3.25 |
| 1234 | 1 | 3.25 |
| 1235 | 1 | 3.25 |
| 1236 | 1 | 3.25 |
| 1237 | 1 | 3.25 |
| 1238 | 1 | 3.25 |
| 1239 | 1 | 3.25 |
| 1240 | 1 | 3.25 |
| 1241 | 1 | 3.25 |
| 1242 | 1 | 3.25 |
| 1243 | 1 | 3.25 |
| 1244 | 1 | 3.25 |
| 1245 | 1 | 3.25 |
| 1246 | 1 | 3.25 |
| 1247 | 1 | 3.25 |
| 1248 | 1 | 3.25 |
| 1249 | 1 | 3.25 |
| 1250 | 1 | 3.25 |
| 1251 | 1 | 3.25 |
| 1252 | 1 | 3.25 |
| 1253 | 1 | 3.25 |
| 1254 | 1 | 3.25 |
| 1255 | 1 | 3.25 |
| 1256 | 1 | 3.25 |
| 1257 | 1 | 3.25 |
| 1258 | 1 | 3.25 |
| 1259 | 1 | 3.25 |
| 1260 | 1 | 3.25 |
| 1261 | 1 | 3.25 |
| 1262 | 1 | 3.25 |
| 1263 | 1 | 3.25 |
| 1264 | 1 | 3.25 |
| 1265 | 1 | 3.25 |
| 1266 | 1 | 3.25 |
| 1267 | 1 | 3.25 |
| 1268 | 1 | 3.25 |
| 1269 | 1 | 3.25 |
| 1270 | 1 | 3.25 |
| 1271 | 1 | 3.25 |
| 1272 | 1 | 3.25 |
| 1273 | 1 | 3.25 |
| 1274 | 1 | 3.25 |
| 1275 | 1 | 3.25 |
| 1276 | 1 | 3.25 |
| 1277 | 1 | 3.25 |
| 1278 | 1 | 3.25 |
| 1279 | 1 | 3.25 |
| 1280 | 1 | 3.25 |
| 1281 | 1 | 3.25 |
| 1282 | 1 | 3.25 |
| 1283 | 1 | 3.25 |
| 1284 | 1 | 3.25 |
| 1285 | 1 | 3.25 |
| 1286 | 1 | 3.25 |
| 1287 | 1 | 3.25 |
| 1288 | 1 | 3.25 |
| 1289 | 1 | 3.25 |
| 1290 | 1 | 3.25 |
| 1291 | 1 | 3.25 |
| 1292 | 1 | 3.25 |
| 1293 | 1 | 3.25 |
| 1294 | 1 | 3.25 |
| 1295 | 1 | 3.25 |
| 1296 | 1 | 3.25 |
| 1297 | 1 | 3.25 |
| 1298 | 1 | 3.25 |
| 1299 | 1 | 3.25 |
| 1300 | 1 | 3.25 |
| 1301 | 1 | 3.25 |
| 1302 | 1 | 3.25 |
| 1303 | 1 | 3.25 |
| 1304 | 1 | 3.25 |
| 1305 | 1 | 3.25 |
| 1306 | 1 | 3.25 |
| 1307 | 1 | 3.25 |
| 1308 | 1 | 3.25 |
| 1309 | 1 | 3.25 |
| 1310 | 1 | 3.25 |
| 1311 | 1 | 3.25 |
| 1312 | 1 | 3.25 |
| 1313 | 1 | 3.25 |
| 1314 | 1 | 3.25 |
| 1315 | 1 | 3.25 |
| 1316 | 1 | 3.25 |
| 1317 | 1 | 3.25 |
| 1318 | 1 | 3.25 |
| 1319 | 1 | 3.25 |
| 1320 | 1 | 3.25 |
| 1321 | 1 | 3.25 |
| 1322 | 1 | 3.25 |
| 1323 | 1 | 3.25 |
| 1324 | 1 | 3.25 |
| 1325 | 1 | 3.25 |
| 1326 | 1 | 3.25 |
| 1327 | 1 | 3.25 |
| 1328 | 1 | 3.25 |
| 1329 | 1 | 3.25 |
| 1330 | 1 | 3.25 |
| 1331 | 1 | 3.25 |
| 1332 | 1 | 3.25 |
| 1333 | 1 | 3.25 |
| 1334 | 1 | 3.25 |
| 1335 | 1 | 3.25 |
| 1336 | 1 | 3.25 |
| 1337 | 1 | 3.25 |
| 1338 | 1 | 3.25 |
| 1339 | 1 | 3.25 |
| 1340 | 1 | 3.25 |
| 1341 | 1 | 3.25 |
| 1342 | 1 | 3.25 |
| 1343 | 1 | 3.25 |
| 1344 | 1 | 3.25 |
| 1345 | 1 | 3.25 |
| 1346 | 1 | 3.25 |
| 1347 | 1 | 3.25 |
| 1348 | 1 | 3.25 |
| 1349 | 1 | 3.25 |
| 1350 | 1 | 3.25 |
| 1351 | 1 | 3.25 |
| 1352 | 1 | 3.25 |
| 1353 | 1 | 3.25 |
| 1354 | 1 | 3.25 |
| 1355 | 1 | 3.25 |
| 1356 | 1 | 3.25 |
| 1357 | 1 | 3.25 |
| 1358 | 1 | 3.25 |
| 1359 | 1 | 3.25 |
| 1360 | 1 | 3.25 |
| 1361 | 1 | 3.25 |
| 1362 | 1 | 3.25 |
| 1363 | 1 | 3.25 |
| 1364 | 1 | 3.25 |
| 1365 | 1 | 3.25 |
| 1366 | 1 | 3.25 |
| 1367 | 1 | 3.25 |
| 1368 | 1 | 3.25 |
| 1369 | 1 | 3.25 |
| 1370 | 1 | 3.25 |
| 1371 | 1 | 3.25 |
| 1372 | 1 | 3.25 |
| 1373 | 1 | 3.25 |
| 1374 | 1 | 3.25 |
| 1375 | 1 | 3.25 |
| 1376 | 1 | 3.25 |
| 1377 | 1 | 3.25 |
| 1378 | 1 | 3.25 |
| 1379 | 1 | 3.25 |
| 1380 | 1 | 3.25 |
| 1381 | 1 | 3.25 |
| 1382 | 1 | 3.25 |
| 1383 | 1 | 3.25 |
| 1384 | 1 | 3.25 |
| 1385 | 1 | 3.25 |
| 1386 | 1 | 3.25 |
| 1387 | 1 | 3.25 |
| 1388 | 1 | 3.25 |
| 1389 | 1 | 3.25 |
| 1390 | 1 | 3.25 |
| 1391 | 1 | 3.25 |
| 1392 | 1 | 3.25 |
| 1393 | 1 | 3.25 |
| 1394 | 1 | 3.25 |
| 1395 | 1 | 3.25 |
| 1396 | 1 | 3.25 |
| 1397 | 1 | 3.25 |
| 1398 | 1 | 3.25 |
| 1399 | 1 | 3.25 |
| 1400 | 1 | 3.25 |
| 1401 | 1 | 3.25 |
| 1402 | 1 | 3.25 |
| 1403 | 1 | 3.25 |
| 1404 | 1 | 3.25 |
| 1405 | 1 | 3.25 |
| 1406 | 1 | 3.25 |
| 1407 | 1 | 3.25 |
| 1408 | 1 | 3.25 |
| 1409 | 1 | 3.25 |
| 1410 | 1 | 3.25 |
| 1411 | 1 | 3.25 |
| 1412 | 1 | 3.25 |
| 1413 | 1 | 3.25 |
| 1414 | 1 | 3.25 |
| 1415 | 1 | 3.25 |
| 1416 | 1 | 3.25 |
| 1417 | 1 | 3.25 |
| 1418 | 1 | 3.25 |
| 1419 | 1 | 3.25 |
| 1420 | 1 | 3.25 |
| 1421 | 1 | 3.25 |
| 1422 | 1 | 3.25 |
| 1423 | 1 | 3.25 |
| 1424 | 1 | 3.25 |
| 1425 | 1 | 3.25 |
| 1426 | 1 | 3.25 |
| 1427 | 1 | 3.25 |
| 1428 | 1 | 3.25 |
| 1429 | 1 | 3.25 |
| 1430 | 1 | 3.25 |
| 1431 | 1 | 3.25 |
| 1432 | 1 | 3.25 |
| 1433 | 1 | 3.25 |
| 1434 | 1 | 3.25 |
| 1435 | 1 | 3.25 |
| 1436 | 1 | 3.25 |
| 1437 | 1 | 3.25 |
| 1438 | 1 | 3.25 |
| 1439 | 1 | 3.25 |
| 1440 | 1 | 3.25 |
| 1441 | 1 | 3.25 |
| 1442 | 1 | 3.25 |
| 1443 | 1 | 3.25 |
| 1444 | 1 | 3.25 |
| 1445 | 1 | 3.25 |
| 1446 | 1 | 3.25 |
| 1447 | 1 | 3.25 |
| 1448 | 1 | 3.25 |
| 1449 | 1 | 3.25 |
| 1450 | 1 | 3.25 |
| 1451 | 1 | 3.25 |
| 1452 | 1 | 3.25 |
| 1453 | 1 | 3.25 |
| 1454 | 1 | 3.25 |
| 1455 | 1 | 3.25 |
| 1456 | 1 | 3.25 |
| 1457 | 1 | 3.25 |
| 1458 | 1 | 3.25 |
| 1459 | 1 | 3.25 |
| 1460 | 1 | 3.25 |
| 1461 | 1 | 3.25 |
| 1462 | 1 | 3.25 |
| 1463 | 1 | 3.25 |
| 1464 | 1 | 3.25 |
| 1465 | 1 | 3.25 |
| 1466 | 1 | 3.25 |
| 1467 | 1 | 3.25 |
| 1468 | 1 | 3.25 |
| 1469 | 1 | 3.25 |
| 1470 | 1 | 3.25 |
| 1471 | 1 | 3.25 |
| 1472 | 1 | 3.25 |
| 1473 | 1 | 3.25 |
| 1474 | 1 | 3.25 |
| 1475 | 1 | 3.25 |
| 1476 | 1 | 3.25 |
| 1477 | 1 | 3.25 |
| 1478 | 1 | 3.25 |
| 1479 | 1 | 3.25 |
| 1480 | 1 | 3.25 |
| 1481 | 1 | 3.25 |
| 1482 | 1 | 3.25 |
| 1483 | 1 | 3.25 |
| 1484 | 1 | 3.25 |
| 1485 | 1 | 3.25 |
| 1486 | 1 | 3.25 |
| 1487 | 1 | 3.25 |
| 1488 | 1 | 3.25 |
| 1489 | 1 | 3.25 |
| 1490 | 1 | 3.25 |
| 1491 | 1 | 3.25 |
| 1492 | 1 | 3.25 |
| 1493 | 1 | 3.25 |
| 1494 | 1 | 3.25 |
| 1495 | 1 | 3.25 |
| 1496 | 1 | 3.25 |
| 1497 | 1 | 3.25 |
| 1498 | 1 | 3.25 |
| 1499 | 1 | 3.25 |
| 1500 | 1 | 3.25 |
| 1501 | 1 | 3.25 |
| 1502 | 1 | 3.25 |
| 1503 | 1 | 3.25 |
| 1504 | 1 | 3.25 |
| 1505 | 1 | 3.25 |
| 1506 | 1 | 3.25 |
| 1507 | 1 | 3.25 |
| 1508 | 1 | 3.25 |
| 1509 | 1 | 3.25 |
| 1510 | 1 | 3.25 |
| 1511 | 1 | 3.25 |
| 1512 | 1 | 3.25 |
| 1513 | 1 | 3.25 |
| 1514 | 1 | 3.25 |
| 1515 | 1 | 3.25 |
| 1516 | 1 | 3.25 |
| 1517 | 1 | 3.25 |
| 1518 | 1 | 3.25 |
| 1519 | 1 | 3.25 |
| 1520 | 1 | 3.25 |
| 1521 | 1 | 3.25 |
| 1522 | 1 | 3.25 |
| 1523 | 1 | 3.25 |
| 1524 | 1 | 3.25 |
| 1525 | 1 | 3.25 |
| 1526 | 1 | 3.25 |
| 1527 | 1 | 3.25 |
| 1528 | 1 | 3.25 |
| 1529 | 1 | 3.25 |
| 1530 | 1 | 3.25 |
| 1531 | 1 | 3.25 |
| 1532 | 1 | 3.25 |
| 1533 | 1 | 3.25 |
| 1534 | 1 | 3.25 |
| 1535 | 1 | 3.25 |
| 1536 | 1 | 3.25 |
| 1537 | 1 | 3.25 |
| 1538 | 1 | 3.25 |
| 1539 | 1 | 3.25 |
| 1540 | 1 | 3.25 |
| 1541 | 1 | 3.25 |
| 1542 | 1 | 3.25 |
| 1543 | 1 | 3.25 |
| 1544 | 1 | 3.25 |
| 1545 | 1 | 3.25 |
| 1546 | 1 | 3.25 |
| 1547 | 1 | 3.25 |
| 1548 | 1 | 3.25 |
| 1549 | 1 | 3.25 |
| 1550 | 1 | 3.25 |
| 1551 | 1 | 3.25 |
| 1552 | 1 | 3.25 |
| 1553 | 1 | 3.25 |
| 1554 | 1 | 3.25 |
| 1555 | 1 | 3.25 |
| 1556 | 1 | 3.25 |
| 1557 | 1 | 3.25 |
| 1558 | 1 | 3.25 |
| 1559 | 1 | 3.25 |
| 1560 | 1 | 3.25 |
| 1561 | 1 | 3.25 |
| 1562 | 1 | 3.25 |
| 1563 | 1 | 3.25 |
| 1564 | 1 | 3.25 |
| 1565 | 1 | 3.25 |
| 1566 | 1 | 3.25 |
| 1567 | 1 | 3.25 |
| 1568 | 1 | 3.25 |
| 1569 | 1 | 3.25 |
| 1570 | 1 | 3.25 |
| 1571 | 1 | 3.25 |
| 1572 | 1 | 3.25 |
| 1573 | 1 | 3.25 |
| 1574 | 1 | 3.25 |
| 1575 | 1 | 3.25 |
| 1576 | 1 | 3.25 |
| 1577 | 1 | 3.25 |
| 1578 | 1 | 3.25 |
| 1579 | 1 | 3.25 |
| 1580 | 1 | 3.25 |
| 1581 | 1 | 3.25 |
| 1582 | 1 | 3.25 |
| 1583 | 1 | 3.25 |
| 1584 | 1 | 3.25 |
| 1585 | 1 | 3.25 |
| 1586 | 1 | 3.25 |
| 1587 | 1 | 3.25 |
| 1588 | 1 | 3.25 |
| 1589 | 1 | 3.25 |
| 1590 | 1 | 3.25 |
| 1591 | 1 | 3.25 |
| 1592 | 1 | 3.25 |
| 1593 | 1 | 3.25 |
| 1594 | 1 | 3.25 |
| 1595 | 1 | 3.25 |
| 1596 | 1 | 3.25 |
| 1597 | 1 | 3.25 |
| 1598 | 1 | 3.25 |
| 1599 | 1 | 3.25 |
| 1600 | 1 | 3.25 |
| 1601 | 1 | 3.25 |
| 1602 | 1 | 3.25 |
| 1603 | 1 | 3.25 |
| 1604 | 1 | 3.25 |
| 1605 | 1 | 3.25 |
| 1606 | 1 | 3.25 |
| 1607 | 1 | 3.25 |
| 1608 | 1 | 3.25 |
| 1609 | 1 | 3.25 |
| 1610 | 1 | 3.25 |
| 1611 | 1 | 3.25 |
| 1612 | 1 | 3.25 |
| 1613 | 1 | 3.25 |
| 1614 | 1 | 3.25 |
| 1615 | 1 | 3.25 |
| 1616 | 1 | 3.25 |
| 1617 | 1 | 3.25 |
| 1618 | 1 | 3.25 |
| 1619 | 1 | 3.25 |
| 1620 | 1 | 3.25 |
| 1621 | 1 | 3.25 |
| 1622 | 1 | 3.25 |
| 1623 | 1 | 3.25 |
| 1624 | 1 | 3.25 |
| 1625 | 1 | 3.25 |
| 1626 | 1 | 3.25 |
| 1627 | 1 | 3.25 |
| 1628 | 1 | 3.25 |
| 1629 | 1 | 3.25 |
| 1630 | 1 | 3.25 |
| 1631 | 1 | 3.25 |
| 1632 | 1 | 3.25 |
| 1633 | 1 | 3.25 |
| 1634 | 1 | 3.25 |
| 1635 | 1 | 3.25 |
| 1636 | 1 | 3.25 |
| 1637 | 1 | 3.25 |
| 1638 | 1 | 3.25 |
| 1639 | 1 | 3.25 |
| 1640 | 1 | 3.25 |
| 1641 | 1 | 3.25 |
| 1642 | 1 | 3.25 |
| 1643 | 1 | 3.25 |
| 1644 | 1 | 3.25 |
| 1645 | 1 | 3.25 |
| 1646 | 1 | 3.25 |
| 1647 | 1 | 3.25 |
| 1648 | 1 | 3.25 |
| 1649 | 1 | 3.25 |
| 1650 | 1 | 3.25 |
| 1651 | 1 | 3.25 |
| 1652 | 1 | 3.25 |
| 1653 | 1 | 3.25 |
| 1654 | 1 | 3.25 |
| 1655 | 1 | 3.25 |
| 1656 | 1 | 3.25 |
| 1657 | 1 | 3.25 |
| 1658 | 1 | 3.25 |
| 1659 | 1 | 3.25 |
| 1660 | 1 | 3.25 |
| 1661 | 1 | 3.25 |
| 1662 | 1 | 3.25 |
| 1663 | 1 | 3.25 |
| 1664 | 1 | 3.25 |
| 1665 | 1 | 3.25 |
| 1666 | 1 | 3.25 |
| 1667 | 1 | 3.25 |
| 1668 | 1 | 3.25 |
| 1669 | 1 | 3.25 |
| 1670 | 1 | 3.25 |
| 1671 | 1 | 3.25 |
| 1672 | 1 | 3.25 |
| 1673 | 1 | 3.25 |
| 1674 | 1 | 3.25 |
| 1675 | 1 | 3.25 |
| 1676 | 1 | 3.25 |
| 1677 | 1 | 3.25 |
| 1678 | 1 | 3.25 |
| 1679 | 1 | 3.25 |
| 1680 | 1 | 3.25 |
| 1681 | 1 | 3.25 |
| 1682 | 1 | 3.25 |
| 1683 | 1 | 3.25 |
| 1684 | 1 | 3.25 |
| 1685 | 1 | 3.25 |
| 1686 | 1 | 3.25 |
| 1687 | 1 | 3.25 |
| 1688 | 1 | 3.25 |
| 1689 | 1 | 3.25 |
| 1690 | 1 | 3.25 |
| 1691 | 1 | 3.25 |
| 1692 | 1 | 3.25 |
| 1693 | 1 | 3.25 |
| 1694 | 1 | 3.25 |
| 1695 | 1 | 3.25 |
| 1696 | 1 | 3.25 |
| 1697 | 1 | 3.25 |
| 1698 | 1 | 3.25 |
| 1699 | 1 | 3.25 |
| 1700 | 1 | 3.25 |
| 1701 | 1 | 3.25 |
| 1702 | 1 | 3.25 |
| 1703 | 1 | 3.25 |
| 1704 | 1 | 3.25 |
| 1705 | 1 | 3.25 |
| 1706 | 1 | 3.25 |
| 1707 | 1 | 3.25 |
| 1708 | 1 | 3.25 |
| 1709 | 1 | 3.25 |
| 1710 | 1 | 3.25 |
| 1711 | 1 | 3.25 |
| 1712 | 1 | 3.25 |
| 1713 | 1 | 3.25 |
| 1714 | 1 | 3.25 |
| 1715 | 1 | 3.25 |
| 1716 | 1 | 3.25 |
| 1717 | 1 | 3.25 |
| 1718 | 1 | 3.25 |
| 1719 | 1 | 3.25 |
| 1720 | 1 | 3.25 |
| 1721 | 1 | 3.25 |
| 1722 | 1 | 3.25 |
| 1723 | 1 | 3.25 |
| 1724 | 1 | 3.25 |
| 1725 | 1 | 3.25 |
| 1726 | 1 | 3.25 |
| 1727 | 1 | 3.25 |
| 1728 | 1 | 3.25 |
| 1729 | 1 | 3.25 |
| 1730 | 1 | 3.25 |
| 1731 | 1 | 3.25 |
| 1732 | 1 | 3.25 |
| 1733 | 1 | 3.25 |
| 1734 | 1 | 3.25 |
| 1735 | 1 | 3.25 |
| 1736 | 1 | 3.25 |
| 1737 | 1 | 3.25 |
| 1738 | 1 | 3.25 |
| 1739 | 1 | 3.25 |
| 1740 | 1 | 3.25 |
| 1741 | 1 | 3.25 |
| 1742 | 1 | 3.25 |
| 1743 | 1 | 3.25 |
| 1744 | 1 | 3.25 |
| 1745 | 1 | 3.25 |
| 1746 | 1 | 3.25 |
| 1747 | 1 | 3.25 |
| 1748 | 1 | 3.25 |
| 1749 | 1 | 3.25 |
| 1750 | 1 | 3.25 |
| 1751 | 1 | 3.25 |
| 1752 | 1 | 3.25 |
| 1753 | 1 | 3.25 |
| 1754 | 1 | 3.25 |
| 1755 | 1 | 3.25 |
| 1756 | 1 | 3.25 |
| 1757 | 1 | 3.25 |
| 1758 | 1 | 3.25 |
| 1759 | 1 | 3.25 |
| 1760 | 1 | 3.25 |
| 1761 | 1 | 3.25 |
| 1762 | 1 | 3.25 |
| 1763 | 1 | 3.25 |
| 1764 | 1 | 3.25 |
| 1765 | 1 | 3.25 |
| 1766 | 1 | 3.25 |
| 1767 | 1 | 3.25 |
| 1768 | 1 | 3.25 |
| 1769 | 1 | 3.25 |
| 1770 | 1 | 3.25 |
| 1771 | 1 | 3.25 |
| 1772 | 1 | 3.25 |
| 1773 | 1 | 3.25 |
| 1774 | 1 | 3.25 |
| 1775 | 1 | 3.25 |
| 1776 | 1 | 3.25 |
| 1777 | 1 | 3.25 |
| 1778 | 1 | 3.25 |
| 1779 | 1 | 3.25 |
| 1780 | 1 | 3.25 |
| 1781 | 1 | 3.25 |
| 1782 | 1 | 3.25 |
| 1783 | 1 | 3.25 |
| 1784 | 1 | 3.25 |
| 1785 | 1 | 3.25 |
| 1786 | 1 | 3.25 |
| 1787 | 1 | 3.25 |
| 1788 | 1 | 3.25 |
| 1789 | 1 | 3.25 |
| 1790 | 1 | 3.25 |
| 1791 | 1 | 3.25 |
| 1792 | 1 | 3.25 |
| 1793 | 1 | 3.25 |
| 1794 | 1 | 3.25 |
| 1795 | 1 | 3.25 |
| 1796 | 1 | 3.25 |
| 1797 | 1 | 3.25 |
| 1798 | 1 | 3.25 |
| 1799 | 1 | 3.25 |
| 1800 | 1 | 3.25 |
| 1801 | 1 | 3.25 |
| 1802 | 1 | 3.25 |
| 1803 | 1 | 3.25 |
| 1804 | 1 | 3.25 |
| 1805 | 1 | 3.25 |
| 1806 | 1 | 3.25 |
| 1807 | 1 | 3.25 |
| 1808 | 1 | 3.25 |
| 1809 | 1 | 3.25 |
| 1810 | 1 | 3.25 |
| 1811 | 1 | 3.25 |
| 1812 | 1 | 3.25 |
| 1813 | 1 | 3.25 |
| 1814 | 1 | 3.25 |
| 1815 | 1 | 3.25 |
| 1816 | 1 | 3.25 |
| 1817 | 1 | 3.25 |
| 1818 | 1 | 3.25 |
| 1819 | 1 | 3.25 |
| 1820 | 1 | 3.25 |
| 1821 | 1 | 3.25 |
| 1822 | 1 | 3.25 |
| 1823 | 1 | 3.25 |
| 1824 | 1 | 3.25 |
| 1825 | 1 | 3.25 |
| 1826 | 1 | 3.25 |
| 1827 | 1 | 3.25 |
| 1828 | 1 | 3.25 |
| 1829 | 1 | 3.25 |
| 1830 | 1 | 3.25 |
| 1831 | 1 | 3.25 |
| 1832 | 1 | 3.25 |
| 1833 | 1 | 3.25 |
| 1834 | 1 | 3.25 |
| 1835 | 1 | 3.25 |
| 1836 | 1 | 3.25 |
| 1837 | 1 | 3.25 |
| 1838 | 1 | 3.25 |
| 1839 | 1 | 3.25 |
| 1840 | 1 | 3.25 |
| 1841 | 1 | 3.25 |
| 1842 | 1 | 3.25 |
| 1843 | 1 | 3.25 |
| 1844 | 1 | 3.25 |
| 1845 | 1 | 3.25 |
| 1846 | 1 | 3.25 |
| 1847 | 1 | 3.25 |
| 1848 | 1 | 3.25 |
| 1849 | 1 | 3.24 |
| 1850 | 1 | 3.25 |
| 1851 | 1 | 3.25 |
| 1852 | 1 | 3.25 |
| 1853 | 1 | 3.24 |
| 1854 | 1 | 3.25 |
| 1855 | 1 | 3.25 |
| 1856 | 1 | 3.25 |
| 1857 | 1 | 3.25 |
| 1858 | 1 | 3.25 |
| 1859 | 1 | 3.25 |
| 1860 | 1 | 3.24 |
| 1861 | 1 | 3.25 |
| 1862 | 1 | 3.24 |
| 1863 | 1 | 3.25 |
| 1864 | 1 | 3.24 |
| 1865 | 1 | 3.24 |
| 1866 | 1 | 3.25 |
| 1867 | 1 | 3.24 |
| 1868 | 1 | 3.24 |
| 1869 | 1 | 3.24 |
| 1870 | 1 | 3.24 |
| 1871 | 1 | 3.24 |
| 1872 | 1 | 3.25 |
| 1873 | 1 | 3.25 |
| 1874 | 1 | 3.25 |
| 1875 | 1 | 3.25 |
| 1876 | 1 | 3.25 |
| 1877 | 1 | 3.24 |
| 1878 | 1 | 3.24 |
| 1879 | 1 | 3.24 |
| 1880 | 1 | 3.24 |
| 1881 | 1 | 3.24 |
| 1882 | 1 | 3.25 |
| 1883 | 1 | 3.24 |
| 1884 | 1 | 3.24 |
| 1885 | 1 | 3.24 |
| 1886 | 1 | 3.24 |
| 1887 | 1 | 3.25 |
| 1888 | 1 | 3.24 |
| 1889 | 1 | 3.24 |
| 1890 | 1 | 3.24 |
| 1891 | 1 | 3.24 |
| 1892 | 1 | 3.24 |
| 1893 | 1 | 3.24 |
| 1894 | 1 | 3.24 |
| 1895 | 1 | 3.24 |
| 1896 | 1 | 3.24 |
| 1897 | 1 | 3.24 |
| 1898 | 1 | 3.24 |
| 1899 | 1 | 3.24 |
| 1900 | 1 | 3.24 |
| 1901 | 1 | 3.24 |
| 1902 | 1 | 3.24 |
| 1903 | 1 | 3.24 |
| 1904 | 1 | 3.24 |
| 1905 | 1 | 3.24 |
| 1906 | 1 | 3.24 |
| 1907 | 1 | 3.24 |
| 1908 | 1 | 3.24 |
| 1909 | 1 | 3.24 |
| 1910 | 1 | 3.24 |
| 1911 | 1 | 3.24 |
| 1912 | 1 | 3.24 |
| 1913 | 1 | 3.24 |
| 1914 | 1 | 3.24 |
| 1915 | 1 | 3.24 |
| 1916 | 1 | 3.25 |
| 1917 | 1 | 3.24 |
| 1918 | 1 | 3.24 |
| 1919 | 1 | 3.24 |
| 1920 | 1 | 3.24 |
| 1921 | 1 | 3.24 |
| 1922 | 1 | 3.24 |
| 1923 | 1 | 3.24 |
| 1924 | 1 | 3.24 |
| 1925 | 1 | 3.24 |
| 1926 | 1 | 3.24 |
| 1927 | 1 | 3.24 |
| 1928 | 1 | 3.24 |
| 1929 | 1 | 3.24 |
| 1930 | 1 | 3.24 |
| 1931 | 1 | 3.24 |
| 1932 | 1 | 3.24 |
| 1933 | 1 | 3.24 |
| 1934 | 1 | 3.24 |
| 1935 | 1 | 3.24 |
| 1936 | 1 | 3.24 |
| 1937 | 1 | 3.24 |
| 1938 | 1 | 3.24 |
| 1939 | 1 | 3.24 |
| 1940 | 1 | 3.24 |
| 1941 | 1 | 3.24 |
| 1942 | 1 | 3.24 |
| 1943 | 1 | 3.24 |
| 1944 | 1 | 3.24 |
| 1945 | 1 | 3.24 |
| 1946 | 1 | 3.24 |
| 1947 | 1 | 3.24 |
| 1948 | 1 | 3.24 |
| 1949 | 1 | 3.24 |
| 1950 | 1 | 3.24 |
| 1951 | 1 | 3.24 |
| 1952 | 1 | 3.24 |
| 1953 | 1 | 3.24 |
| 1954 | 1 | 3.24 |
| 1955 | 1 | 3.24 |
| 1956 | 1 | 3.24 |
| 1957 | 1 | 3.24 |
| 1958 | 1 | 3.24 |
| 1959 | 1 | 3.24 |
| 1960 | 1 | 3.24 |
| 1961 | 1 | 3.24 |
| 1962 | 1 | 3.24 |
| 1963 | 1 | 3.24 |
| 1964 | 1 | 3.24 |
| 1965 | 1 | 3.24 |
| 1966 | 1 | 3.24 |
| 1967 | 1 | 3.24 |
| 1968 | 1 | 3.24 |
| 1969 | 1 | 3.24 |
| 1970 | 1 | 3.24 |
| 1971 | 1 | 3.24 |
| 1972 | 1 | 3.24 |
| 1973 | 1 | 3.24 |
| 1974 | 1 | 3.24 |
| 1975 | 1 | 3.24 |
| 1976 | 1 | 3.24 |
| 1977 | 1 | 3.24 |
| 1978 | 1 | 3.24 |
| 1979 | 1 | 3.24 |
| 1980 | 1 | 3.24 |
| 1981 | 1 | 3.24 |
| 1982 | 1 | 3.24 |
| 1983 | 1 | 3.24 |
| 1984 | 1 | 3.24 |
| 1985 | 1 | 3.24 |
| 1986 | 1 | 3.24 |
| 1987 | 1 | 3.24 |
| 1988 | 1 | 3.24 |
| 1989 | 1 | 3.24 |
| 1990 | 1 | 3.24 |
| 1991 | 1 | 3.24 |
| 1992 | 1 | 3.24 |
| 1993 | 1 | 3.24 |
| 1994 | 1 | 3.24 |
| 1995 | 1 | 3.24 |
| 1996 | 1 | 3.24 |
| 1997 | 1 | 3.24 |
| 1998 | 1 | 3.24 |
| 1999 | 1 | 3.24 |
| 2000 | 1 | 3.24 |
| 2001 | 1 | 3.24 |
| 2002 | 1 | 3.24 |
| 2003 | 1 | 3.24 |
| 2004 | 1 | 3.24 |
| 2005 | 1 | 3.24 |
| 2006 | 1 | 3.24 |
| 2007 | 1 | 3.24 |
| 2008 | 1 | 3.24 |
| 2009 | 1 | 3.24 |
| 2010 | 1 | 3.24 |
| 2011 | 1 | 3.24 |
| 2012 | 1 | 3.24 |
| 2013 | 1 | 3.24 |
| 2014 | 1 | 3.24 |
| 2015 | 1 | 3.24 |
| 2016 | 1 | 3.24 |
| 2017 | 1 | 3.24 |
| 2018 | 1 | 3.24 |
| 2019 | 1 | 3.24 |
| 2020 | 1 | 3.24 |
| 2021 | 1 | 3.24 |
| 2022 | 1 | 3.24 |
| 2023 | 1 | 3.24 |
| 2024 | 1 | 3.24 |
| 2025 | 1 | 3.24 |
| 2026 | 1 | 3.24 |
| 2027 | 1 | 3.24 |
| 2028 | 1 | 3.24 |
| 2029 | 1 | 3.24 |
| 2030 | 1 | 3.24 |
| 2031 | 1 | 3.24 |
| 2032 | 1 | 3.24 |
| 2033 | 1 | 3.24 |
| 2034 | 1 | 3.24 |
| 2035 | 1 | 3.24 |
| 2036 | 1 | 3.24 |
| 2037 | 1 | 3.24 |
| 2038 | 1 | 3.24 |
| 2039 | 1 | 3.24 |
| 2040 | 1 | 3.24 |
| 2041 | 1 | 3.24 |
| 2042 | 1 | 3.24 |
| 2043 | 1 | 3.24 |
| 2044 | 1 | 3.24 |
| 2045 | 1 | 3.24 |
| 2046 | 1 | 3.24 |
| 2047 | 1 | 3.24 |
| 2048 | 1 | 3.24 |
| 2049 | 1 | 3.24 |
| 2050 | 1 | 3.24 |
| 2051 | 1 | 3.24 |
| 2052 | 1 | 3.24 |
| 2053 | 1 | 3.24 |
| 2054 | 1 | 3.24 |
| 2055 | 1 | 3.24 |
| 2056 | 1 | 3.24 |
| 2057 | 1 | 3.24 |
| 2058 | 1 | 3.24 |
| 2059 | 1 | 3.24 |
| 2060 | 1 | 3.24 |
| 2061 | 1 | 3.24 |
| 2062 | 1 | 3.24 |
| 2063 | 1 | 3.24 |
| 2064 | 1 | 3.24 |
| 2065 | 1 | 3.24 |
| 2066 | 1 | 3.24 |
| 2067 | 1 | 3.24 |
| 2068 | 1 | 3.24 |
| 2069 | 1 | 3.24 |
| 2070 | 1 | 3.24 |
| 2071 | 1 | 3.24 |
| 2072 | 1 | 3.24 |
| 2073 | 1 | 3.24 |
| 2074 | 1 | 3.24 |
| 2075 | 1 | 3.24 |
| 2076 | 1 | 3.24 |
| 2077 | 1 | 3.24 |
| 2078 | 1 | 3.24 |
| 2079 | 1 | 3.24 |
| 2080 | 1 | 3.24 |
| 2081 | 1 | 3.24 |
| 2082 | 1 | 3.24 |
| 2083 | 1 | 3.24 |
| 2084 | 1 | 3.24 |
| 2085 | 1 | 3.24 |
| 2086 | 1 | 3.24 |
| 2087 | 1 | 3.24 |
| 2088 | 1 | 3.24 |
| 2089 | 1 | 3.24 |
| 2090 | 1 | 3.24 |
| 2091 | 1 | 3.24 |
| 2092 | 1 | 3.24 |
| 2093 | 1 | 3.24 |
| 2094 | 1 | 3.24 |
| 2095 | 1 | 3.24 |
| 2096 | 1 | 3.24 |
| 2097 | 1 | 3.24 |
| 2098 | 1 | 3.24 |
| 2099 | 1 | 3.24 |
| 2100 | 1 | 3.24 |
| 2101 | 1 | 3.24 |
| 2102 | 1 | 3.24 |
| 2103 | 1 | 3.24 |
| 2104 | 1 | 3.24 |
| 2105 | 1 | 3.24 |
| 2106 | 1 | 3.24 |
| 2107 | 1 | 3.24 |
| 2108 | 1 | 3.24 |
| 2109 | 1 | 3.24 |
| 2110 | 1 | 3.24 |
| 2111 | 1 | 3.24 |
| 2112 | 1 | 3.24 |
| 2113 | 1 | 3.24 |
| 2114 | 1 | 3.24 |
| 2115 | 1 | 3.24 |
| 2116 | 1 | 3.24 |
| 2117 | 1 | 3.24 |
| 2118 | 1 | 3.24 |
| 2119 | 1 | 3.24 |
| 2120 | 1 | 3.24 |
| 2121 | 1 | 3.24 |
| 2122 | 1 | 3.24 |
| 2123 | 1 | 3.24 |
| 2124 | 1 | 3.24 |
| 2125 | 1 | 3.24 |
| 2126 | 1 | 3.24 |
| 2127 | 1 | 3.24 |
| 2128 | 1 | 3.24 |
| 2129 | 1 | 3.24 |
| 2130 | 1 | 3.24 |
| 2131 | 1 | 3.24 |
| 2132 | 1 | 3.24 |
| 2133 | 1 | 3.24 |
| 2134 | 1 | 3.24 |
| 2135 | 1 | 3.24 |
| 2136 | 1 | 3.24 |
| 2137 | 1 | 3.24 |
| 2138 | 1 | 3.24 |
| 2139 | 1 | 3.24 |
| 2140 | 1 | 3.24 |
| 2141 | 1 | 3.24 |
| 2142 | 1 | 3.24 |
| 2143 | 1 | 3.24 |
| 2144 | 1 | 3.24 |
| 2145 | 1 | 3.24 |
| 2146 | 1 | 3.24 |
| 2147 | 1 | 3.24 |
| 2148 | 1 | 3.24 |
| 2149 | 1 | 3.24 |
| 2150 | 1 | 3.24 |
| 2151 | 1 | 3.24 |
| 2152 | 1 | 3.24 |
| 2153 | 1 | 3.24 |
| 2154 | 1 | 3.24 |
| 2155 | 1 | 3.24 |
| 2156 | 1 | 3.24 |
| 2157 | 1 | 3.24 |
| 2158 | 1 | 3.24 |
| 2159 | 1 | 3.24 |
| 2160 | 1 | 3.24 |
| 2161 | 1 | 3.24 |
| 2162 | 1 | 3.24 |
| 2163 | 1 | 3.24 |
| 2164 | 1 | 3.24 |
| 2165 | 1 | 3.24 |
| 2166 | 1 | 3.24 |
| 2167 | 1 | 3.24 |
| 2168 | 1 | 3.24 |
| 2169 | 1 | 3.24 |
| 2170 | 1 | 3.24 |
| 2171 | 1 | 3.24 |
| 2172 | 1 | 3.24 |
| 2173 | 1 | 3.24 |
| 2174 | 1 | 3.24 |
| 2175 | 1 | 3.24 |
| 2176 | 1 | 3.24 |
| 2177 | 1 | 3.24 |
| 2178 | 1 | 3.24 |
| 2179 | 1 | 3.24 |
| 2180 | 1 | 3.24 |
| 2181 | 1 | 3.24 |
| 2182 | 1 | 3.24 |
| 2183 | 1 | 3.24 |
| 2184 | 1 | 3.24 |
| 2185 | 1 | 3.24 |
| 2186 | 1 | 3.24 |
| 2187 | 1 | 3.24 |
| 2188 | 1 | 3.24 |
| 2189 | 1 | 3.24 |
| 2190 | 1 | 3.24 |
| 2191 | 1 | 3.24 |
| 2192 | 1 | 3.24 |
| 2193 | 1 | 3.24 |
| 2194 | 1 | 3.24 |
| 2195 | 1 | 3.24 |
| 2196 | 1 | 3.24 |
| 2197 | 1 | 3.24 |
| 2198 | 1 | 3.24 |
| 2199 | 1 | 3.24 |
| 2200 | 1 | 3.24 |
| 2201 | 1 | 3.24 |
| 2202 | 1 | 3.24 |
| 2203 | 1 | 3.24 |
| 2204 | 1 | 3.24 |
| 2205 | 1 | 3.24 |
| 2206 | 1 | 3.24 |
| 2207 | 1 | 3.24 |
| 2208 | 1 | 3.24 |
| 2209 | 1 | 3.24 |
| 2210 | 1 | 3.24 |
| 2211 | 1 | 3.24 |
| 2212 | 1 | 3.24 |
| 2213 | 1 | 3.24 |
| 2214 | 1 | 3.24 |
| 2215 | 1 | 3.24 |
| 2216 | 1 | 3.24 |
| 2217 | 1 | 3.24 |
| 2218 | 1 | 3.24 |
| 2219 | 1 | 3.24 |
| 2220 | 1 | 3.24 |
| 2221 | 1 | 3.24 |
| 2222 | 1 | 3.24 |
| 2223 | 1 | 3.24 |
| 2224 | 1 | 3.24 |
| 2225 | 1 | 3.24 |
| 2226 | 1 | 3.24 |
| 2227 | 1 | 3.24 |
| 2228 | 1 | 3.24 |
| 2229 | 1 | 3.24 |
| 2230 | 1 | 3.24 |
| 2231 | 1 | 3.24 |
| 2232 | 1 | 3.24 |
| 2233 | 1 | 3.24 |
| 2234 | 1 | 3.24 |
| 2235 | 1 | 3.24 |
| 2236 | 1 | 3.24 |
| 2237 | 1 | 3.24 |
| 2238 | 1 | 3.24 |
| 2239 | 1 | 3.24 |
| 2240 | 1 | 3.24 |
| 2241 | 1 | 3.24 |
| 2242 | 1 | 3.24 |
| 2243 | 1 | 3.24 |
| 2244 | 1 | 3.24 |
| 2245 | 1 | 3.24 |
| 2246 | 1 | 3.24 |
| 2247 | 1 | 3.24 |
| 2248 | 1 | 3.24 |
| 2249 | 1 | 3.24 |
| 2250 | 1 | 3.24 |
| 2251 | 1 | 3.24 |
| 2252 | 1 | 3.24 |
| 2253 | 1 | 3.24 |
| 2254 | 1 | 3.24 |
| 2255 | 1 | 3.24 |
| 2256 | 1 | 3.24 |
| 2257 | 1 | 3.24 |
| 2258 | 1 | 3.24 |
| 2259 | 1 | 3.24 |
| 2260 | 1 | 3.24 |
| 2261 | 1 | 3.24 |
| 2262 | 1 | 3.24 |
| 2263 | 1 | 3.24 |
| 2264 | 1 | 3.24 |
| 2265 | 1 | 3.24 |
| 2266 | 1 | 3.24 |
| 2267 | 1 | 3.24 |
| 2268 | 1 | 3.24 |
| 2269 | 1 | 3.24 |
| 2270 | 1 | 3.24 |
| 2271 | 1 | 3.24 |
| 2272 | 1 | 3.24 |
| 2273 | 1 | 3.24 |
| 2274 | 1 | 3.24 |
| 2275 | 1 | 3.24 |
| 2276 | 1 | 3.24 |
| 2277 | 1 | 3.24 |
| 2278 | 1 | 3.24 |
| 2279 | 1 | 3.24 |
| 2280 | 1 | 3.24 |
| 2281 | 1 | 3.24 |
| 2282 | 1 | 3.24 |
| 2283 | 1 | 3.24 |
| 2284 | 1 | 3.24 |
| 2285 | 1 | 3.24 |
| 2286 | 1 | 3.24 |
| 2287 | 1 | 3.24 |
| 2288 | 1 | 3.24 |
| 2289 | 1 | 3.24 |
| 2290 | 1 | 3.24 |
| 2291 | 1 | 3.24 |
| 2292 | 1 | 3.24 |
| 2293 | 1 | 3.24 |
| 2294 | 1 | 3.24 |
| 2295 | 1 | 3.24 |
| 2296 | 1 | 3.24 |
| 2297 | 1 | 3.24 |
| 2298 | 1 | 3.24 |
| 2299 | 1 | 3.24 |
| 2300 | 1 | 3.24 |
| 2301 | 1 | 3.24 |
| 2302 | 1 | 3.24 |
| 2303 | 1 | 3.24 |
| 2304 | 1 | 3.24 |
| 2305 | 1 | 3.24 |
| 2306 | 1 | 3.24 |
| 2307 | 1 | 3.24 |
| 2308 | 1 | 3.24 |
| 2309 | 1 | 3.23 |
| 2310 | 1 | 3.24 |
| 2311 | 1 | 3.24 |
| 2312 | 1 | 3.23 |
| 2313 | 1 | 3.24 |
| 2314 | 1 | 3.23 |
| 2315 | 1 | 3.24 |
| 2316 | 1 | 3.23 |
| 2317 | 1 | 3.24 |
| 2318 | 1 | 3.24 |
| 2319 | 1 | 3.24 |
| 2320 | 1 | 3.23 |
| 2321 | 1 | 3.23 |
| 2322 | 1 | 3.23 |
| 2323 | 1 | 3.23 |
| 2324 | 1 | 3.24 |
| 2325 | 1 | 3.23 |
| 2326 | 1 | 3.23 |
| 2327 | 1 | 3.24 |
| 2328 | 1 | 3.23 |
| 2329 | 1 | 3.23 |
| 2330 | 1 | 3.23 |
| 2331 | 1 | 3.23 |
| 2332 | 1 | 3.24 |
| 2333 | 1 | 3.23 |
| 2334 | 1 | 3.23 |
| 2335 | 1 | 3.23 |
| 2336 | 1 | 3.23 |
| 2337 | 1 | 3.23 |
| 2338 | 1 | 3.23 |
| 2339 | 1 | 3.23 |
| 2340 | 1 | 3.23 |
| 2341 | 1 | 3.23 |
| 2342 | 1 | 3.23 |
| 2343 | 1 | 3.23 |
| 2344 | 1 | 3.23 |
| 2345 | 1 | 3.23 |
| 2346 | 1 | 3.23 |
| 2347 | 1 | 3.23 |
| 2348 | 1 | 3.23 |
| 2349 | 1 | 3.23 |
| 2350 | 1 | 3.23 |
| 2351 | 1 | 3.23 |
| 2352 | 1 | 3.23 |
| 2353 | 1 | 3.23 |
| 2354 | 1 | 3.23 |
| 2355 | 1 | 3.23 |
| 2356 | 1 | 3.23 |
| 2357 | 1 | 3.23 |
| 2358 | 1 | 3.23 |
| 2359 | 1 | 3.23 |
| 2360 | 1 | 3.23 |
| 2361 | 1 | 3.23 |
| 2362 | 1 | 3.23 |
| 2363 | 1 | 3.23 |
| 2364 | 1 | 3.23 |
| 2365 | 1 | 3.23 |
| 2366 | 1 | 3.23 |
| 2367 | 1 | 3.23 |
| 2368 | 1 | 3.23 |
| 2369 | 1 | 3.23 |
| 2370 | 1 | 3.23 |
| 2371 | 1 | 3.23 |
| 2372 | 1 | 3.23 |
| 2373 | 1 | 3.23 |
| 2374 | 1 | 3.23 |
| 2375 | 1 | 3.23 |
| 2376 | 1 | 3.23 |
| 2377 | 1 | 3.23 |
| 2378 | 1 | 3.23 |
| 2379 | 1 | 3.23 |
| 2380 | 1 | 3.23 |
| 2381 | 1 | 3.23 |
| 2382 | 1 | 3.23 |
| 2383 | 1 | 3.23 |
| 2384 | 1 | 3.23 |
| 2385 | 1 | 3.23 |
| 2386 | 1 | 3.23 |
| 2387 | 1 | 3.23 |
| 2388 | 1 | 3.23 |
| 2389 | 1 | 3.23 |
| 2390 | 1 | 3.23 |
| 2391 | 1 | 3.23 |
| 2392 | 1 | 3.23 |
| 2393 | 1 | 3.23 |
| 2394 | 1 | 3.23 |
| 2395 | 1 | 3.23 |
| 2396 | 1 | 3.23 |
| 2397 | 1 | 3.23 |
| 2398 | 1 | 3.23 |
| 2399 | 1 | 3.23 |
| 2400 | 1 | 3.23 |
| 2401 | 1 | 3.23 |
| 2402 | 1 | 3.23 |
| 2403 | 1 | 3.23 |
| 2404 | 1 | 3.23 |
| 2405 | 1 | 3.23 |
| 2406 | 1 | 3.23 |
| 2407 | 1 | 3.23 |
| 2408 | 1 | 3.23 |
| 2409 | 1 | 3.23 |
| 2410 | 1 | 3.23 |
| 2411 | 1 | 3.23 |
| 2412 | 1 | 3.23 |
| 2413 | 1 | 3.23 |
| 2414 | 1 | 3.23 |
| 2415 | 1 | 3.23 |
| 2416 | 1 | 3.23 |
| 2417 | 1 | 3.23 |
| 2418 | 1 | 3.23 |
| 2419 | 1 | 3.23 |
| 2420 | 1 | 3.23 |
| 2421 | 1 | 3.23 |
| 2422 | 1 | 3.23 |
| 2423 | 1 | 3.23 |
| 2424 | 1 | 3.23 |
| 2425 | 1 | 3.23 |
| 2426 | 1 | 3.23 |
| 2427 | 1 | 3.23 |
| 2428 | 1 | 3.23 |
| 2429 | 1 | 3.23 |
| 2430 | 1 | 3.23 |
| 2431 | 1 | 3.23 |
| 2432 | 1 | 3.23 |
| 2433 | 1 | 3.23 |
| 2434 | 1 | 3.23 |
| 2435 | 1 | 3.23 |
| 2436 | 1 | 3.23 |
| 2437 | 1 | 3.23 |
| 2438 | 1 | 3.23 |
| 2439 | 1 | 3.23 |
| 2440 | 1 | 3.23 |
| 2441 | 1 | 3.23 |
| 2442 | 1 | 3.23 |
| 2443 | 1 | 3.23 |
| 2444 | 1 | 3.23 |
| 2445 | 1 | 3.23 |
| 2446 | 1 | 3.23 |
| 2447 | 1 | 3.23 |
| 2448 | 1 | 3.23 |
| 2449 | 1 | 3.23 |
| 2450 | 1 | 3.23 |
| 2451 | 1 | 3.23 |
| 2452 | 1 | 3.23 |
| 2453 | 1 | 3.23 |
| 2454 | 1 | 3.23 |
| 2455 | 1 | 3.23 |
| 2456 | 1 | 3.23 |
| 2457 | 1 | 3.23 |
| 2458 | 1 | 3.23 |
| 2459 | 1 | 3.23 |
| 2460 | 1 | 3.23 |
| 2461 | 1 | 3.23 |
| 2462 | 1 | 3.23 |
| 2463 | 1 | 3.23 |
| 2464 | 1 | 3.23 |
| 2465 | 1 | 3.23 |
| 2466 | 1 | 3.23 |
| 2467 | 1 | 3.23 |
| 2468 | 1 | 3.23 |
| 2469 | 1 | 3.23 |
| 2470 | 1 | 3.23 |
| 2471 | 1 | 3.23 |
| 2472 | 1 | 3.23 |
| 2473 | 1 | 3.23 |
| 2474 | 1 | 3.23 |
| 2475 | 1 | 3.23 |
| 2476 | 1 | 3.23 |
| 2477 | 1 | 3.23 |
| 2478 | 1 | 3.23 |
| 2479 | 1 | 3.23 |
| 2480 | 1 | 3.23 |
| 2481 | 1 | 3.23 |
| 2482 | 1 | 3.23 |
| 2483 | 1 | 3.23 |
| 2484 | 1 | 3.23 |
| 2485 | 1 | 3.23 |
| 2486 | 1 | 3.23 |
| 2487 | 1 | 3.23 |
| 2488 | 1 | 3.23 |
| 2489 | 1 | 3.23 |
| 2490 | 1 | 3.23 |
| 2491 | 1 | 3.23 |
| 2492 | 1 | 3.23 |
| 2493 | 1 | 3.23 |
| 2494 | 1 | 3.23 |
| 2495 | 1 | 3.23 |
| 2496 | 1 | 3.23 |
| 2497 | 1 | 3.23 |
| 2498 | 1 | 3.23 |
| 2499 | 1 | 3.23 |
| 2500 | 1 | 3.23 |
| 2501 | 1 | 3.23 |
| 2502 | 1 | 3.23 |
| 2503 | 1 | 3.23 |
| 2504 | 1 | 3.23 |
| 2505 | 1 | 3.23 |
| 2506 | 1 | 3.23 |
| 2507 | 1 | 3.23 |
| 2508 | 1 | 3.23 |
| 2509 | 1 | 3.23 |
| 2510 | 1 | 3.23 |
| 2511 | 1 | 3.23 |
| 2512 | 1 | 3.23 |
| 2513 | 1 | 3.23 |
| 2514 | 1 | 3.23 |
| 2515 | 1 | 3.23 |
| 2516 | 1 | 3.23 |
| 2517 | 1 | 3.23 |
| 2518 | 1 | 3.23 |
| 2519 | 1 | 3.23 |
| 2520 | 1 | 3.23 |
| 2521 | 1 | 3.23 |
| 2522 | 1 | 3.23 |
| 2523 | 1 | 3.23 |
| 2524 | 1 | 3.23 |
| 2525 | 1 | 3.23 |
| 2526 | 1 | 3.23 |
| 2527 | 1 | 3.23 |
| 2528 | 1 | 3.23 |
| 2529 | 1 | 3.23 |
| 2530 | 1 | 3.23 |
| 2531 | 1 | 3.23 |
| 2532 | 1 | 3.23 |
| 2533 | 1 | 3.23 |
| 2534 | 1 | 3.23 |
| 2535 | 1 | 3.23 |
| 2536 | 1 | 3.23 |
| 2537 | 1 | 3.23 |
| 2538 | 1 | 3.23 |
| 2539 | 1 | 3.23 |
| 2540 | 1 | 3.23 |
| 2541 | 1 | 3.23 |
| 2542 | 1 | 3.23 |
| 2543 | 1 | 3.23 |
| 2544 | 1 | 3.23 |
| 2545 | 1 | 3.23 |
| 2546 | 1 | 3.23 |
| 2547 | 1 | 3.23 |
| 2548 | 1 | 3.23 |
| 2549 | 1 | 3.23 |
| 2550 | 1 | 3.23 |
| 2551 | 1 | 3.23 |
| 2552 | 1 | 3.23 |
| 2553 | 1 | 3.23 |
| 2554 | 1 | 3.23 |
| 2555 | 1 | 3.23 |
| 2556 | 1 | 3.23 |
| 2557 | 1 | 3.23 |
| 2558 | 1 | 3.23 |
| 2559 | 1 | 3.23 |
| 2560 | 1 | 3.23 |
| 2561 | 1 | 3.23 |
| 2562 | 1 | 3.23 |
| 2563 | 1 | 3.23 |
| 2564 | 1 | 3.23 |
| 2565 | 1 | 3.23 |
| 2566 | 1 | 3.23 |
| 2567 | 1 | 3.23 |
| 2568 | 1 | 3.23 |
| 2569 | 1 | 3.23 |
| 2570 | 1 | 3.23 |
| 2571 | 1 | 3.23 |
| 2572 | 1 | 3.23 |
| 2573 | 1 | 3.23 |
| 2574 | 1 | 3.23 |
| 2575 | 1 | 3.23 |
| 2576 | 1 | 3.23 |
| 2577 | 1 | 3.23 |
| 2578 | 1 | 3.23 |
| 2579 | 1 | 3.23 |
| 2580 | 1 | 3.23 |
| 2581 | 1 | 3.23 |
| 2582 | 1 | 3.23 |
| 2583 | 1 | 3.23 |
| 2584 | 1 | 3.23 |
| 2585 | 1 | 3.23 |
| 2586 | 1 | 3.23 |
| 2587 | 1 | 3.23 |
| 2588 | 1 | 3.23 |
| 2589 | 1 | 3.23 |
| 2590 | 1 | 3.23 |
| 2591 | 1 | 3.23 |
| 2592 | 1 | 3.23 |
| 2593 | 1 | 3.23 |
| 2594 | 1 | 3.23 |
| 2595 | 1 | 3.23 |
| 2596 | 1 | 3.23 |
| 2597 | 1 | 3.23 |
| 2598 | 1 | 3.23 |
| 2599 | 1 | 3.23 |
| 2600 | 1 | 3.23 |
| 2601 | 1 | 3.23 |
| 2602 | 1 | 3.23 |
| 2603 | 1 | 3.23 |
| 2604 | 1 | 3.23 |
| 2605 | 1 | 3.23 |
| 2606 | 1 | 3.23 |
| 2607 | 1 | 3.23 |
| 2608 | 1 | 3.23 |
| 2609 | 1 | 3.23 |
| 2610 | 1 | 3.23 |
| 2611 | 1 | 3.23 |
| 2612 | 1 | 3.23 |
| 2613 | 1 | 3.23 |
| 2614 | 1 | 3.23 |
| 2615 | 1 | 3.23 |
| 2616 | 1 | 3.23 |
| 2617 | 1 | 3.23 |
| 2618 | 1 | 3.23 |
| 2619 | 1 | 3.23 |
| 2620 | 1 | 3.23 |
| 2621 | 1 | 3.23 |
| 2622 | 1 | 3.23 |
| 2623 | 1 | 3.23 |
| 2624 | 1 | 3.23 |
| 2625 | 1 | 3.23 |
| 2626 | 1 | 3.23 |
| 2627 | 1 | 3.23 |
| 2628 | 1 | 3.23 |
| 2629 | 1 | 3.23 |
| 2630 | 1 | 3.23 |
| 2631 | 1 | 3.23 |
| 2632 | 1 | 3.23 |
| 2633 | 1 | 3.23 |
| 2634 | 1 | 3.23 |
| 2635 | 1 | 3.23 |
| 2636 | 1 | 3.23 |
| 2637 | 1 | 3.23 |
| 2638 | 1 | 3.23 |
| 2639 | 1 | 3.23 |
| 2640 | 1 | 3.23 |
| 2641 | 1 | 3.23 |
| 2642 | 1 | 3.23 |
| 2643 | 1 | 3.23 |
| 2644 | 1 | 3.23 |
| 2645 | 1 | 3.23 |
| 2646 | 1 | 3.23 |
| 2647 | 1 | 3.23 |
| 2648 | 1 | 3.23 |
| 2649 | 1 | 3.23 |
| 2650 | 1 | 3.23 |
| 2651 | 1 | 3.23 |
| 2652 | 1 | 3.23 |
| 2653 | 1 | 3.23 |
| 2654 | 1 | 3.23 |
| 2655 | 1 | 3.23 |
| 2656 | 1 | 3.23 |
| 2657 | 1 | 3.23 |
| 2658 | 1 | 3.23 |
| 2659 | 1 | 3.23 |
| 2660 | 1 | 3.23 |
| 2661 | 1 | 3.23 |
| 2662 | 1 | 3.23 |
| 2663 | 1 | 3.23 |
| 2664 | 1 | 3.23 |
| 2665 | 1 | 3.23 |
| 2666 | 1 | 3.23 |
| 2667 | 1 | 3.23 |
| 2668 | 1 | 3.23 |
| 2669 | 1 | 3.23 |
| 2670 | 1 | 3.23 |
| 2671 | 1 | 3.23 |
| 2672 | 1 | 3.23 |
| 2673 | 1 | 3.23 |
| 2674 | 1 | 3.23 |
| 2675 | 1 | 3.23 |
| 2676 | 1 | 3.23 |
| 2677 | 1 | 3.23 |
| 2678 | 1 | 3.23 |
| 2679 | 1 | 3.23 |
| 2680 | 1 | 3.23 |
| 2681 | 1 | 3.23 |
| 2682 | 1 | 3.23 |
| 2683 | 1 | 3.23 |
| 2684 | 1 | 3.23 |
| 2685 | 1 | 3.23 |
| 2686 | 1 | 3.23 |
| 2687 | 1 | 3.23 |
| 2688 | 1 | 3.23 |
| 2689 | 1 | 3.23 |
| 2690 | 1 | 3.23 |
| 2691 | 1 | 3.23 |
| 2692 | 1 | 3.23 |
| 2693 | 1 | 3.23 |
| 2694 | 1 | 3.23 |
| 2695 | 1 | 3.23 |
| 2696 | 1 | 3.23 |
| 2697 | 1 | 3.23 |
| 2698 | 1 | 3.23 |
| 2699 | 1 | 3.23 |
| 2700 | 1 | 3.23 |
| 2701 | 1 | 3.23 |
| 2702 | 1 | 3.23 |
| 2703 | 1 | 3.23 |
| 2704 | 1 | 3.23 |
| 2705 | 1 | 3.23 |
| 2706 | 1 | 3.23 |
| 2707 | 1 | 3.23 |
| 2708 | 1 | 3.23 |
| 2709 | 1 | 3.23 |
| 2710 | 1 | 3.23 |
| 2711 | 1 | 3.23 |
| 2712 | 1 | 3.23 |
| 2713 | 1 | 3.23 |
| 2714 | 1 | 3.23 |
| 2715 | 1 | 3.23 |
| 2716 | 1 | 3.23 |
| 2717 | 1 | 3.23 |
| 2718 | 1 | 3.23 |
| 2719 | 1 | 3.23 |
| 2720 | 1 | 3.23 |
| 2721 | 1 | 3.23 |
| 2722 | 1 | 3.23 |
| 2723 | 1 | 3.23 |
| 2724 | 1 | 3.23 |
| 2725 | 1 | 3.23 |
| 2726 | 1 | 3.23 |
| 2727 | 1 | 3.23 |
| 2728 | 1 | 3.23 |
| 2729 | 1 | 3.23 |
| 2730 | 1 | 3.23 |
| 2731 | 1 | 3.23 |
| 2732 | 1 | 3.23 |
| 2733 | 1 | 3.23 |
| 2734 | 1 | 3.23 |
| 2735 | 1 | 3.23 |
| 2736 | 1 | 3.23 |
| 2737 | 1 | 3.23 |
| 2738 | 1 | 3.23 |
| 2739 | 1 | 3.23 |
| 2740 | 1 | 3.23 |
| 2741 | 1 | 3.23 |
| 2742 | 1 | 3.23 |
| 2743 | 1 | 3.23 |
| 2744 | 1 | 3.23 |
| 2745 | 1 | 3.23 |
| 2746 | 1 | 3.23 |
| 2747 | 1 | 3.23 |
| 2748 | 1 | 3.23 |
| 2749 | 1 | 3.23 |
| 2750 | 1 | 3.23 |
| 2751 | 1 | 3.23 |
| 2752 | 1 | 3.23 |
| 2753 | 1 | 3.23 |
| 2754 | 1 | 3.23 |
| 2755 | 1 | 3.23 |
| 2756 | 1 | 3.23 |
| 2757 | 1 | 3.23 |
| 2758 | 1 | 3.23 |
| 2759 | 1 | 3.23 |
| 2760 | 1 | 3.23 |
| 2761 | 1 | 3.23 |
| 2762 | 1 | 3.23 |
| 2763 | 1 | 3.23 |
| 2764 | 1 | 3.23 |
| 2765 | 1 | 3.22 |
| 2766 | 1 | 3.23 |
| 2767 | 1 | 3.23 |
| 2768 | 1 | 3.23 |
| 2769 | 1 | 3.23 |
| 2770 | 1 | 3.23 |
| 2771 | 1 | 3.23 |
| 2772 | 1 | 3.23 |
| 2773 | 1 | 3.23 |
| 2774 | 1 | 3.23 |
| 2775 | 1 | 3.23 |
| 2776 | 1 | 3.23 |
| 2777 | 1 | 3.23 |
| 2778 | 1 | 3.22 |
| 2779 | 1 | 3.23 |
| 2780 | 1 | 3.23 |
| 2781 | 1 | 3.23 |
| 2782 | 1 | 3.23 |
| 2783 | 1 | 3.23 |
| 2784 | 1 | 3.23 |
| 2785 | 1 | 3.22 |
| 2786 | 1 | 3.23 |
| 2787 | 1 | 3.23 |
| 2788 | 1 | 3.23 |
| 2789 | 1 | 3.22 |
| 2790 | 1 | 3.23 |
| 2791 | 1 | 3.23 |
| 2792 | 1 | 3.23 |
| 2793 | 1 | 3.23 |
| 2794 | 1 | 3.22 |
| 2795 | 1 | 3.23 |
| 2796 | 1 | 3.23 |
| 2797 | 1 | 3.23 |
| 2798 | 1 | 3.23 |
| 2799 | 1 | 3.22 |
| 2800 | 1 | 3.23 |
| 2801 | 1 | 3.22 |
| 2802 | 1 | 3.23 |
| 2803 | 1 | 3.22 |
| 2804 | 1 | 3.22 |
| 2805 | 1 | 3.22 |
| 2806 | 1 | 3.22 |
| 2807 | 1 | 3.22 |
| 2808 | 1 | 3.23 |
| 2809 | 1 | 3.23 |
| 2810 | 1 | 3.23 |
| 2811 | 1 | 3.22 |
| 2812 | 1 | 3.22 |
| 2813 | 1 | 3.22 |
| 2814 | 1 | 3.22 |
| 2815 | 1 | 3.22 |
| 2816 | 1 | 3.22 |
| 2817 | 1 | 3.22 |
| 2818 | 1 | 3.22 |
| 2819 | 1 | 3.22 |
| 2820 | 1 | 3.22 |
| 2821 | 1 | 3.22 |
| 2822 | 1 | 3.22 |
| 2823 | 1 | 3.22 |
| 2824 | 1 | 3.22 |
| 2825 | 1 | 3.22 |
| 2826 | 1 | 3.22 |
| 2827 | 1 | 3.22 |
| 2828 | 1 | 3.22 |
| 2829 | 1 | 3.22 |
| 2830 | 1 | 3.22 |
| 2831 | 1 | 3.22 |
| 2832 | 1 | 3.22 |
| 2833 | 1 | 3.22 |
| 2834 | 1 | 3.22 |
| 2835 | 1 | 3.22 |
| 2836 | 1 | 3.22 |
| 2837 | 1 | 3.22 |
| 2838 | 1 | 3.22 |
| 2839 | 1 | 3.22 |
| 2840 | 1 | 3.22 |
| 2841 | 1 | 3.22 |
| 2842 | 1 | 3.22 |
| 2843 | 1 | 3.22 |
| 2844 | 1 | 3.22 |
| 2845 | 1 | 3.22 |
| 2846 | 1 | 3.22 |
| 2847 | 1 | 3.22 |
| 2848 | 1 | 3.22 |
| 2849 | 1 | 3.22 |
| 2850 | 1 | 3.22 |
| 2851 | 1 | 3.22 |
| 2852 | 1 | 3.22 |
| 2853 | 1 | 3.22 |
| 2854 | 1 | 3.22 |
| 2855 | 1 | 3.22 |
| 2856 | 1 | 3.22 |
| 2857 | 1 | 3.22 |
| 2858 | 1 | 3.22 |
| 2859 | 1 | 3.22 |
| 2860 | 1 | 3.22 |
| 2861 | 1 | 3.22 |
| 2862 | 1 | 3.22 |
| 2863 | 1 | 3.22 |
| 2864 | 1 | 3.22 |
| 2865 | 1 | 3.22 |
| 2866 | 1 | 3.22 |
| 2867 | 1 | 3.22 |
| 2868 | 1 | 3.22 |
| 2869 | 1 | 3.22 |
| 2870 | 1 | 3.22 |
| 2871 | 1 | 3.22 |
| 2872 | 1 | 3.22 |
| 2873 | 1 | 3.22 |
| 2874 | 1 | 3.22 |
| 2875 | 1 | 3.22 |
| 2876 | 1 | 3.22 |
| 2877 | 1 | 3.22 |
| 2878 | 1 | 3.22 |
| 2879 | 1 | 3.22 |
| 2880 | 1 | 3.22 |
| 2881 | 1 | 3.22 |
| 2882 | 1 | 3.22 |
| 2883 | 1 | 3.22 |
| 2884 | 1 | 3.22 |
| 2885 | 1 | 3.22 |
| 2886 | 1 | 3.22 |
| 2887 | 1 | 3.22 |
| 2888 | 1 | 3.22 |
| 2889 | 1 | 3.22 |
| 2890 | 1 | 3.22 |
| 2891 | 1 | 3.22 |
| 2892 | 1 | 3.22 |
| 2893 | 1 | 3.22 |
| 2894 | 1 | 3.22 |
| 2895 | 1 | 3.22 |
| 2896 | 1 | 3.22 |
| 2897 | 1 | 3.22 |
| 2898 | 1 | 3.22 |
| 2899 | 1 | 3.22 |
| 2900 | 1 | 3.22 |
| 2901 | 1 | 3.22 |
| 2902 | 1 | 3.22 |
| 2903 | 1 | 3.22 |
| 2904 | 1 | 3.22 |
| 2905 | 1 | 3.22 |
| 2906 | 1 | 3.22 |
| 2907 | 1 | 3.22 |
| 2908 | 1 | 3.22 |
| 2909 | 1 | 3.22 |
| 2910 | 1 | 3.22 |
| 2911 | 1 | 3.22 |
| 2912 | 1 | 3.22 |
| 2913 | 1 | 3.22 |
| 2914 | 1 | 3.22 |
| 2915 | 1 | 3.22 |
| 2916 | 1 | 3.22 |
| 2917 | 1 | 3.22 |
| 2918 | 1 | 3.22 |
| 2919 | 1 | 3.22 |
| 2920 | 1 | 3.22 |
| 2921 | 1 | 3.22 |
| 2922 | 1 | 3.22 |
| 2923 | 1 | 3.22 |
| 2924 | 1 | 3.22 |
| 2925 | 1 | 3.22 |
| 2926 | 1 | 3.22 |
| 2927 | 1 | 3.22 |
| 2928 | 1 | 3.22 |
| 2929 | 1 | 3.22 |
| 2930 | 1 | 3.22 |
| 2931 | 1 | 3.22 |
| 2932 | 1 | 3.22 |
| 2933 | 1 | 3.22 |
| 2934 | 1 | 3.22 |
| 2935 | 1 | 3.22 |
| 2936 | 1 | 3.22 |
| 2937 | 1 | 3.22 |
| 2938 | 1 | 3.22 |
| 2939 | 1 | 3.22 |
| 2940 | 1 | 3.22 |
| 2941 | 1 | 3.22 |
| 2942 | 1 | 3.22 |
| 2943 | 1 | 3.22 |
| 2944 | 1 | 3.22 |
| 2945 | 1 | 3.22 |
| 2946 | 1 | 3.22 |
| 2947 | 1 | 3.22 |
| 2948 | 1 | 3.22 |
| 2949 | 1 | 3.22 |
| 2950 | 1 | 3.22 |
| 2951 | 1 | 3.22 |
| 2952 | 1 | 3.22 |
| 2953 | 1 | 3.22 |
| 2954 | 1 | 3.22 |
| 2955 | 1 | 3.22 |
| 2956 | 1 | 3.22 |
| 2957 | 1 | 3.22 |
| 2958 | 1 | 3.22 |
| 2959 | 1 | 3.22 |
| 2960 | 1 | 3.22 |
| 2961 | 1 | 3.22 |
| 2962 | 1 | 3.22 |
| 2963 | 1 | 3.22 |
| 2964 | 1 | 3.22 |
| 2965 | 1 | 3.22 |
| 2966 | 1 | 3.22 |
| 2967 | 1 | 3.22 |
| 2968 | 1 | 3.22 |
| 2969 | 1 | 3.22 |
| 2970 | 1 | 3.22 |
| 2971 | 1 | 3.22 |
| 2972 | 1 | 3.22 |
| 2973 | 1 | 3.22 |
| 2974 | 1 | 3.22 |
| 2975 | 1 | 3.22 |
| 2976 | 1 | 3.22 |
| 2977 | 1 | 3.22 |
| 2978 | 1 | 3.22 |
| 2979 | 1 | 3.22 |
| 2980 | 1 | 3.22 |
| 2981 | 1 | 3.22 |
| 2982 | 1 | 3.22 |
| 2983 | 1 | 3.22 |
| 2984 | 1 | 3.22 |
| 2985 | 1 | 3.22 |
| 2986 | 1 | 3.22 |
| 2987 | 1 | 3.22 |
| 2988 | 1 | 3.22 |
| 2989 | 1 | 3.22 |
| 2990 | 1 | 3.22 |
| 2991 | 1 | 3.22 |
| 2992 | 1 | 3.22 |
| 2993 | 1 | 3.22 |
| 2994 | 1 | 3.22 |
| 2995 | 1 | 3.22 |
| 2996 | 1 | 3.22 |
| 2997 | 1 | 3.22 |
| 2998 | 1 | 3.22 |
| 2999 | 1 | 3.22 |
| 3000 | 1 | 3.22 |
| 3001 | 1 | 3.22 |
| 3002 | 1 | 3.22 |
| 3003 | 1 | 3.22 |
| 3004 | 1 | 3.22 |
| 3005 | 1 | 3.22 |
| 3006 | 1 | 3.22 |
| 3007 | 1 | 3.22 |
| 3008 | 1 | 3.22 |
| 3009 | 1 | 3.22 |
| 3010 | 1 | 3.22 |
| 3011 | 1 | 3.22 |
| 3012 | 1 | 3.22 |
| 3013 | 1 | 3.22 |
| 3014 | 1 | 3.22 |
| 3015 | 1 | 3.22 |
| 3016 | 1 | 3.22 |
| 3017 | 1 | 3.22 |
| 3018 | 1 | 3.22 |
| 3019 | 1 | 3.22 |
| 3020 | 1 | 3.22 |
| 3021 | 1 | 3.22 |
| 3022 | 1 | 3.22 |
| 3023 | 1 | 3.22 |
| 3024 | 1 | 3.22 |
| 3025 | 1 | 3.22 |
| 3026 | 1 | 3.22 |
| 3027 | 1 | 3.22 |
| 3028 | 1 | 3.22 |
| 3029 | 1 | 3.22 |
| 3030 | 1 | 3.22 |
| 3031 | 1 | 3.22 |
| 3032 | 1 | 3.22 |
| 3033 | 1 | 3.22 |
| 3034 | 1 | 3.22 |
| 3035 | 1 | 3.22 |
| 3036 | 1 | 3.22 |
| 3037 | 1 | 3.22 |
| 3038 | 1 | 3.22 |
| 3039 | 1 | 3.22 |
| 3040 | 1 | 3.22 |
| 3041 | 1 | 3.22 |
| 3042 | 1 | 3.22 |
| 3043 | 1 | 3.22 |
| 3044 | 1 | 3.22 |
| 3045 | 1 | 3.22 |
| 3046 | 1 | 3.22 |
| 3047 | 1 | 3.22 |
| 3048 | 1 | 3.22 |
| 3049 | 1 | 3.22 |
| 3050 | 1 | 3.22 |
| 3051 | 1 | 3.22 |
| 3052 | 1 | 3.22 |
| 3053 | 1 | 3.22 |
| 3054 | 1 | 3.22 |
| 3055 | 1 | 3.22 |
| 3056 | 1 | 3.22 |
| 3057 | 1 | 3.22 |
| 3058 | 1 | 3.22 |
| 3059 | 1 | 3.22 |
| 3060 | 1 | 3.22 |
| 3061 | 1 | 3.22 |
| 3062 | 1 | 3.22 |
| 3063 | 1 | 3.22 |
| 3064 | 1 | 3.22 |
| 3065 | 1 | 3.22 |
| 3066 | 1 | 3.22 |
| 3067 | 1 | 3.22 |
| 3068 | 1 | 3.22 |
| 3069 | 1 | 3.22 |
| 3070 | 1 | 3.22 |
| 3071 | 1 | 3.22 |
| 3072 | 1 | 3.22 |
| 3073 | 1 | 3.22 |
| 3074 | 1 | 3.22 |
| 3075 | 1 | 3.22 |
| 3076 | 1 | 3.22 |
| 3077 | 1 | 3.22 |
| 3078 | 1 | 3.22 |
| 3079 | 1 | 3.22 |
| 3080 | 1 | 3.22 |
| 3081 | 1 | 3.22 |
| 3082 | 1 | 3.22 |
| 3083 | 1 | 3.22 |
| 3084 | 1 | 3.22 |
| 3085 | 1 | 3.22 |
| 3086 | 1 | 3.22 |
| 3087 | 1 | 3.22 |
| 3088 | 1 | 3.22 |
| 3089 | 1 | 3.22 |
| 3090 | 1 | 3.22 |
| 3091 | 1 | 3.22 |
| 3092 | 1 | 3.22 |
| 3093 | 1 | 3.22 |
| 3094 | 1 | 3.22 |
| 3095 | 1 | 3.22 |
| 3096 | 1 | 3.22 |
| 3097 | 1 | 3.22 |
| 3098 | 1 | 3.22 |
| 3099 | 1 | 3.22 |
| 3100 | 1 | 3.22 |
| 3101 | 1 | 3.22 |
| 3102 | 1 | 3.22 |
| 3103 | 1 | 3.22 |
| 3104 | 1 | 3.22 |
| 3105 | 1 | 3.22 |
| 3106 | 1 | 3.22 |
| 3107 | 1 | 3.22 |
| 3108 | 1 | 3.22 |
| 3109 | 1 | 3.22 |
| 3110 | 1 | 3.22 |
| 3111 | 1 | 3.22 |
| 3112 | 1 | 3.22 |
| 3113 | 1 | 3.22 |
| 3114 | 1 | 3.22 |
| 3115 | 1 | 3.22 |
| 3116 | 1 | 3.22 |
| 3117 | 1 | 3.22 |
| 3118 | 1 | 3.22 |
| 3119 | 1 | 3.22 |
| 3120 | 1 | 3.22 |
| 3121 | 1 | 3.22 |
| 3122 | 1 | 3.22 |
| 3123 | 1 | 3.22 |
| 3124 | 1 | 3.22 |
| 3125 | 1 | 3.22 |
| 3126 | 1 | 3.22 |
| 3127 | 1 | 3.22 |
| 3128 | 1 | 3.22 |
| 3129 | 1 | 3.22 |
| 3130 | 1 | 3.22 |
| 3131 | 1 | 3.22 |
| 3132 | 1 | 3.22 |
| 3133 | 1 | 3.22 |
| 3134 | 1 | 3.22 |
| 3135 | 1 | 3.22 |
| 3136 | 1 | 3.22 |
| 3137 | 1 | 3.22 |
| 3138 | 1 | 3.22 |
| 3139 | 1 | 3.22 |
| 3140 | 1 | 3.22 |
| 3141 | 1 | 3.22 |
| 3142 | 1 | 3.22 |
| 3143 | 1 | 3.22 |
| 3144 | 1 | 3.22 |
| 3145 | 1 | 3.22 |
| 3146 | 1 | 3.22 |
| 3147 | 1 | 3.22 |
| 3148 | 1 | 3.22 |
| 3149 | 1 | 3.22 |
| 3150 | 1 | 3.22 |
| 3151 | 1 | 3.22 |
| 3152 | 1 | 3.22 |
| 3153 | 1 | 3.22 |
| 3154 | 1 | 3.22 |
| 3155 | 1 | 3.22 |
| 3156 | 1 | 3.22 |
| 3157 | 1 | 3.22 |
| 3158 | 1 | 3.22 |
| 3159 | 1 | 3.22 |
| 3160 | 1 | 3.22 |
| 3161 | 1 | 3.22 |
| 3162 | 1 | 3.22 |
| 3163 | 1 | 3.22 |
| 3164 | 1 | 3.22 |
| 3165 | 1 | 3.22 |
| 3166 | 1 | 3.22 |
| 3167 | 1 | 3.22 |
| 3168 | 1 | 3.22 |
| 3169 | 1 | 3.22 |
| 3170 | 1 | 3.22 |
| 3171 | 1 | 3.22 |
| 3172 | 1 | 3.22 |
| 3173 | 1 | 3.22 |
| 3174 | 1 | 3.22 |
| 3175 | 1 | 3.22 |
| 3176 | 1 | 3.22 |
| 3177 | 1 | 3.22 |
| 3178 | 1 | 3.22 |
| 3179 | 1 | 3.22 |
| 3180 | 1 | 3.22 |
| 3181 | 1 | 3.22 |
| 3182 | 1 | 3.22 |
| 3183 | 1 | 3.22 |
| 3184 | 1 | 3.22 |
| 3185 | 1 | 3.22 |
| 3186 | 1 | 3.22 |
| 3187 | 1 | 3.22 |
| 3188 | 1 | 3.22 |
| 3189 | 1 | 3.22 |
| 3190 | 1 | 3.22 |
| 3191 | 1 | 3.22 |
| 3192 | 1 | 3.22 |
| 3193 | 1 | 3.22 |
| 3194 | 1 | 3.22 |
| 3195 | 1 | 3.22 |
| 3196 | 1 | 3.22 |
| 3197 | 1 | 3.22 |
| 3198 | 1 | 3.22 |
| 3199 | 1 | 3.22 |
| 3200 | 1 | 3.22 |
| 3201 | 1 | 3.22 |
| 3202 | 1 | 3.22 |
| 3203 | 1 | 3.22 |
| 3204 | 1 | 3.22 |
| 3205 | 1 | 3.22 |
| 3206 | 1 | 3.22 |
| 3207 | 1 | 3.22 |
| 3208 | 1 | 3.22 |
| 3209 | 1 | 3.22 |
| 3210 | 1 | 3.22 |
| 3211 | 1 | 3.22 |
| 3212 | 1 | 3.22 |
| 3213 | 1 | 3.22 |
| 3214 | 1 | 3.22 |
| 3215 | 1 | 3.22 |
| 3216 | 1 | 3.22 |
| 3217 | 1 | 3.22 |
| 3218 | 1 | 3.22 |
| 3219 | 1 | 3.22 |
| 3220 | 1 | 3.22 |
| 3221 | 1 | 3.22 |
| 3222 | 1 | 3.22 |
| 3223 | 1 | 3.22 |
| 3224 | 1 | 3.22 |
| 3225 | 1 | 3.22 |
| 3226 | 1 | 3.22 |
| 3227 | 1 | 3.22 |
| 3228 | 1 | 3.22 |
| 3229 | 1 | 3.22 |
| 3230 | 1 | 3.22 |
| 3231 | 1 | 3.22 |
| 3232 | 1 | 3.22 |
| 3233 | 1 | 3.22 |
| 3234 | 1 | 3.22 |
| 3235 | 1 | 3.22 |
| 3236 | 1 | 3.22 |
| 3237 | 1 | 3.22 |
| 3238 | 1 | 3.22 |
| 3239 | 1 | 3.22 |
| 3240 | 1 | 3.22 |
| 3241 | 1 | 3.22 |
| 3242 | 1 | 3.22 |
| 3243 | 1 | 3.22 |
| 3244 | 1 | 3.22 |
| 3245 | 1 | 3.22 |
| 3246 | 1 | 3.22 |
| 3247 | 1 | 3.22 |
| 3248 | 1 | 3.22 |
| 3249 | 1 | 3.22 |
| 3250 | 1 | 3.22 |
| 3251 | 1 | 3.22 |
| 3252 | 1 | 3.22 |
| 3253 | 1 | 3.22 |
| 3254 | 1 | 3.22 |
| 3255 | 1 | 3.22 |
| 3256 | 1 | 3.22 |
| 3257 | 1 | 3.22 |
| 3258 | 1 | 3.22 |
| 3259 | 1 | 3.22 |
| 3260 | 1 | 3.22 |
| 3261 | 1 | 3.22 |
| 3262 | 1 | 3.22 |
| 3263 | 1 | 3.22 |
| 3264 | 1 | 3.22 |
| 3265 | 1 | 3.22 |
| 3266 | 1 | 3.22 |
| 3267 | 1 | 3.22 |
| 3268 | 1 | 3.22 |
| 3269 | 1 | 3.22 |
| 3270 | 1 | 3.22 |
| 3271 | 1 | 3.22 |
| 3272 | 1 | 3.22 |
| 3273 | 1 | 3.22 |
| 3274 | 1 | 3.22 |
| 3275 | 1 | 3.22 |
| 3276 | 1 | 3.22 |
| 3277 | 1 | 3.22 |
| 3278 | 1 | 3.22 |
| 3279 | 1 | 3.22 |
| 3280 | 1 | 3.22 |
| 3281 | 1 | 3.22 |
| 3282 | 1 | 3.22 |
| 3283 | 1 | 3.22 |
| 3284 | 1 | 3.22 |
| 3285 | 1 | 3.22 |
| 3286 | 1 | 3.22 |
| 3287 | 1 | 3.22 |
| 3288 | 1 | 3.22 |
| 3289 | 1 | 3.22 |
| 3290 | 1 | 3.22 |
| 3291 | 1 | 3.22 |
| 3292 | 1 | 3.22 |
| 3293 | 1 | 3.22 |
| 3294 | 1 | 3.22 |
| 3295 | 1 | 3.22 |
| 3296 | 1 | 3.22 |
| 3297 | 1 | 3.22 |
| 3298 | 1 | 3.22 |
| 3299 | 1 | 3.22 |
| 3300 | 1 | 3.22 |
| 3301 | 1 | 3.22 |
| 3302 | 1 | 3.22 |
| 3303 | 1 | 3.22 |
| 3304 | 1 | 3.22 |
| 3305 | 1 | 3.22 |
| 3306 | 1 | 3.22 |
| 3307 | 1 | 3.22 |
| 3308 | 1 | 3.22 |
| 3309 | 1 | 3.22 |
| 3310 | 1 | 3.22 |
| 3311 | 1 | 3.22 |
| 3312 | 1 | 3.22 |
| 3313 | 1 | 3.22 |
| 3314 | 1 | 3.22 |
| 3315 | 1 | 3.22 |
| 3316 | 1 | 3.22 |
| 3317 | 1 | 3.22 |
| 3318 | 1 | 3.22 |
| 3319 | 1 | 3.22 |
| 3320 | 1 | 3.22 |
| 3321 | 1 | 3.22 |
| 3322 | 1 | 3.22 |
| 3323 | 1 | 3.22 |
| 3324 | 1 | 3.22 |
| 3325 | 1 | 3.22 |
| 3326 | 1 | 3.22 |
| 3327 | 1 | 3.22 |
| 3328 | 1 | 3.22 |
| 3329 | 1 | 3.22 |
| 3330 | 1 | 3.22 |
| 3331 | 1 | 3.22 |
| 3332 | 1 | 3.22 |
| 3333 | 1 | 3.22 |
| 3334 | 1 | 3.22 |
| 3335 | 1 | 3.22 |
| 3336 | 1 | 3.22 |
| 3337 | 1 | 3.22 |
| 3338 | 1 | 3.22 |
| 3339 | 1 | 3.22 |
| 3340 | 1 | 3.22 |
| 3341 | 1 | 3.22 |
| 3342 | 1 | 3.22 |
| 3343 | 1 | 3.22 |
| 3344 | 1 | 3.22 |
| 3345 | 1 | 3.22 |
| 3346 | 1 | 3.22 |
| 3347 | 1 | 3.22 |
| 3348 | 1 | 3.22 |
| 3349 | 1 | 3.22 |
| 3350 | 1 | 3.22 |
| 3351 | 1 | 3.22 |
| 3352 | 1 | 3.22 |
| 3353 | 1 | 3.22 |
| 3354 | 1 | 3.22 |
| 3355 | 1 | 3.22 |
| 3356 | 1 | 3.22 |
| 3357 | 1 | 3.22 |
| 3358 | 1 | 3.22 |
| 3359 | 1 | 3.22 |
| 3360 | 1 | 3.22 |
| 3361 | 1 | 3.22 |
| 3362 | 1 | 3.22 |
| 3363 | 1 | 3.22 |
| 3364 | 1 | 3.22 |
| 3365 | 1 | 3.22 |
| 3366 | 1 | 3.22 |
| 3367 | 1 | 3.22 |
| 3368 | 1 | 3.22 |
| 3369 | 1 | 3.22 |
| 3370 | 1 | 3.22 |
| 3371 | 1 | 3.22 |
| 3372 | 1 | 3.22 |
| 3373 | 1 | 3.22 |
| 3374 | 1 | 3.22 |
| 3375 | 1 | 3.22 |
| 3376 | 1 | 3.22 |
| 3377 | 1 | 3.22 |
| 3378 | 1 | 3.22 |
| 3379 | 1 | 3.22 |
| 3380 | 1 | 3.22 |
| 3381 | 1 | 3.22 |
| 3382 | 1 | 3.22 |
| 3383 | 1 | 3.22 |
| 3384 | 1 | 3.22 |
| 3385 | 1 | 3.22 |
| 3386 | 1 | 3.22 |
| 3387 | 1 | 3.22 |
| 3388 | 1 | 3.22 |
| 3389 | 1 | 3.22 |
| 3390 | 1 | 3.22 |
| 3391 | 1 | 3.22 |
| 3392 | 1 | 3.22 |
| 3393 | 1 | 3.22 |
| 3394 | 1 | 3.22 |
| 3395 | 1 | 3.22 |
| 3396 | 1 | 3.22 |
| 3397 | 1 | 3.22 |
| 3398 | 1 | 3.22 |
| 3399 | 1 | 3.22 |
| 3400 | 1 | 3.22 |
| 3401 | 1 | 3.22 |
| 3402 | 1 | 3.22 |
| 3403 | 1 | 3.22 |
| 3404 | 1 | 3.22 |
| 3405 | 1 | 3.22 |
| 3406 | 1 | 3.22 |
| 3407 | 1 | 3.22 |
| 3408 | 1 | 3.22 |
| 3409 | 1 | 3.22 |
| 3410 | 1 | 3.22 |
| 3411 | 1 | 3.22 |
| 3412 | 1 | 3.22 |
| 3413 | 1 | 3.22 |
| 3414 | 1 | 3.22 |
| 3415 | 1 | 3.22 |
| 3416 | 1 | 3.22 |
| 3417 | 1 | 3.22 |
| 3418 | 1 | 3.22 |
| 3419 | 1 | 3.22 |
| 3420 | 1 | 3.22 |
| 3421 | 1 | 3.22 |
| 3422 | 1 | 3.22 |
| 3423 | 1 | 3.22 |
| 3424 | 1 | 3.22 |
| 3425 | 1 | 3.22 |
| 3426 | 1 | 3.22 |
| 3427 | 1 | 3.22 |
| 3428 | 1 | 3.22 |
| 3429 | 1 | 3.22 |
| 3430 | 1 | 3.22 |
| 3431 | 1 | 3.22 |
| 3432 | 1 | 3.22 |
| 3433 | 1 | 3.22 |
| 3434 | 1 | 3.22 |
| 3435 | 1 | 3.22 |
| 3436 | 1 | 3.22 |
| 3437 | 1 | 3.22 |
| 3438 | 1 | 3.22 |
| 3439 | 1 | 3.22 |
| 3440 | 1 | 3.22 |
| 3441 | 1 | 3.22 |
| 3442 | 1 | 3.22 |
| 3443 | 1 | 3.22 |
| 3444 | 1 | 3.22 |
| 3445 | 1 | 3.22 |
| 3446 | 1 | 3.22 |
| 3447 | 1 | 3.22 |
| 3448 | 1 | 3.22 |
| 3449 | 1 | 3.22 |
| 3450 | 1 | 3.22 |
| 3451 | 1 | 3.22 |
| 3452 | 1 | 3.22 |
| 3453 | 1 | 3.22 |
| 3454 | 1 | 3.22 |
| 3455 | 1 | 3.22 |
| 3456 | 1 | 3.22 |
| 3457 | 1 | 3.22 |
| 3458 | 1 | 3.22 |
| 3459 | 1 | 3.22 |
| 3460 | 1 | 3.22 |
| 3461 | 1 | 3.22 |
| 3462 | 1 | 3.22 |
| 3463 | 1 | 3.22 |
| 3464 | 1 | 3.22 |
| 3465 | 1 | 3.22 |
| 3466 | 1 | 3.22 |
| 3467 | 1 | 3.22 |
| 3468 | 1 | 3.22 |
| 3469 | 1 | 3.22 |
| 3470 | 1 | 3.22 |
| 3471 | 1 | 3.22 |
| 3472 | 1 | 3.22 |
| 3473 | 1 | 3.22 |
| 3474 | 1 | 3.22 |
| 3475 | 1 | 3.22 |
| 3476 | 1 | 3.22 |
| 3477 | 1 | 3.22 |
| 3478 | 1 | 3.22 |
| 3479 | 1 | 3.22 |
| 3480 | 1 | 3.22 |
| 3481 | 1 | 3.22 |
| 3482 | 1 | 3.22 |
| 3483 | 1 | 3.22 |
| 3484 | 1 | 3.22 |
| 3485 | 1 | 3.22 |
| 3486 | 1 | 3.22 |
| 3487 | 1 | 3.22 |
| 3488 | 1 | 3.22 |
| 3489 | 1 | 3.22 |
| 3490 | 1 | 3.22 |
| 3491 | 1 | 3.22 |
| 3492 | 1 | 3.22 |
| 3493 | 1 | 3.22 |
| 3494 | 1 | 3.22 |
| 3495 | 1 | 3.22 |
| 3496 | 1 | 3.22 |
| 3497 | 1 | 3.22 |
| 3498 | 1 | 3.22 |
| 3499 | 1 | 3.22 |
| 3500 | 1 | 3.22 |
| 3501 | 1 | 3.22 |
| 3502 | 1 | 3.22 |
| 3503 | 1 | 3.22 |
| 3504 | 1 | 3.22 |
| 3505 | 1 | 3.22 |
| 3506 | 1 | 3.22 |
| 3507 | 1 | 3.22 |
| 3508 | 1 | 3.22 |
| 3509 | 1 | 3.22 |
| 3510 | 1 | 3.22 |
| 3511 | 1 | 3.22 |
| 3512 | 1 | 3.22 |
| 3513 | 1 | 3.22 |
| 3514 | 1 | 3.22 |
| 3515 | 1 | 3.22 |
| 3516 | 1 | 3.22 |
| 3517 | 1 | 3.22 |
| 3518 | 1 | 3.22 |
| 3519 | 1 | 3.22 |
| 3520 | 1 | 3.22 |
| 3521 | 1 | 3.22 |
| 3522 | 1 | 3.22 |
| 3523 | 1 | 3.22 |
| 3524 | 1 | 3.22 |
| 3525 | 1 | 3.22 |
| 3526 | 1 | 3.22 |
| 3527 | 1 | 3.22 |
| 3528 | 1 | 3.22 |
| 3529 | 1 | 3.22 |
| 3530 | 1 | 3.22 |
| 3531 | 1 | 3.22 |
| 3532 | 1 | 3.22 |
| 3533 | 1 | 3.22 |
| 3534 | 1 | 3.22 |
| 3535 | 1 | 3.22 |
| 3536 | 1 | 3.22 |
| 3537 | 1 | 3.22 |
| 3538 | 1 | 3.22 |
| 3539 | 1 | 3.22 |
| 3540 | 1 | 3.22 |
| 3541 | 1 | 3.22 |
| 3542 | 1 | 3.22 |
| 3543 | 1 | 3.22 |
| 3544 | 1 | 3.22 |
| 3545 | 1 | 3.22 |
| 3546 | 1 | 3.22 |
| 3547 | 1 | 3.22 |
| 3548 | 1 | 3.22 |
| 3549 | 1 | 3.22 |
| 3550 | 1 | 3.22 |
| 3551 | 1 | 3.22 |
| 3552 | 1 | 3.22 |
| 3553 | 1 | 3.22 |
| 3554 | 1 | 3.22 |
| 3555 | 1 | 3.22 |
| 3556 | 1 | 3.22 |
| 3557 | 1 | 3.22 |
| 3558 | 1 | 3.22 |
| 3559 | 1 | 3.22 |
| 3560 | 1 | 3.22 |
| 3561 | 1 | 3.22 |
| 3562 | 1 | 3.22 |
| 3563 | 1 | 3.22 |
| 3564 | 1 | 3.22 |
| 3565 | 1 | 3.22 |
| 3566 | 1 | 3.22 |
| 3567 | 1 | 3.22 |
| 3568 | 1 | 3.22 |
| 3569 | 1 | 3.22 |
| 3570 | 1 | 3.22 |
| 3571 | 1 | 3.22 |
| 3572 | 1 | 3.22 |
| 3573 | 1 | 3.22 |
| 3574 | 1 | 3.22 |
| 3575 | 1 | 3.22 |
| 3576 | 1 | 3.22 |
| 3577 | 1 | 3.22 |
| 3578 | 1 | 3.22 |
| 3579 | 1 | 3.22 |
| 3580 | 1 | 3.22 |
| 3581 | 1 | 3.22 |
| 3582 | 1 | 3.22 |
| 3583 | 1 | 3.22 |
| 3584 | 1 | 3.22 |
| 3585 | 1 | 3.22 |
| 3586 | 1 | 3.22 |
| 3587 | 1 | 3.22 |
| 3588 | 1 | 3.22 |
| 3589 | 1 | 3.22 |
| 3590 | 1 | 3.22 |
| 3591 | 1 | 3.22 |
| 3592 | 1 | 3.22 |
| 3593 | 1 | 3.22 |
| 3594 | 1 | 3.22 |
| 3595 | 1 | 3.22 |
| 3596 | 1 | 3.22 |
| 3597 | 1 | 3.22 |
| 3598 | 1 | 3.22 |
| 3599 | 1 | 3.22 |
| 3600 | 1 | 3.22 |
| 3601 | 1 | 3.22 |
| 3602 | 1 | 3.22 |
| 3603 | 1 | 3.22 |
| 3604 | 1 | 3.22 |
| 3605 | 1 | 3.22 |
| 3606 | 1 | 3.22 |
| 3607 | 1 | 3.22 |
| 3608 | 1 | 3.22 |
| 3609 | 1 | 3.22 |
| 3610 | 1 | 3.22 |
| 3611 | 1 | 3.22 |
| 3612 | 1 | 3.21 |
| 3613 | 1 | 3.22 |
| 3614 | 1 | 3.22 |
| 3615 | 1 | 3.22 |
| 3616 | 1 | 3.22 |
| 3617 | 1 | 3.22 |
| 3618 | 1 | 3.22 |
| 3619 | 1 | 3.22 |
| 3620 | 1 | 3.22 |
| 3621 | 1 | 3.22 |
| 3622 | 1 | 3.22 |
| 3623 | 1 | 3.22 |
| 3624 | 1 | 3.21 |
| 3625 | 1 | 3.22 |
| 3626 | 1 | 3.22 |
| 3627 | 1 | 3.22 |
| 3628 | 1 | 3.22 |
| 3629 | 1 | 3.22 |
| 3630 | 1 | 3.22 |
| 3631 | 1 | 3.22 |
| 3632 | 1 | 3.22 |
| 3633 | 1 | 3.22 |
| 3634 | 1 | 3.22 |
| 3635 | 1 | 3.22 |
| 3636 | 1 | 3.22 |
| 3637 | 1 | 3.22 |
| 3638 | 1 | 3.22 |
| 3639 | 1 | 3.22 |
| 3640 | 1 | 3.22 |
| 3641 | 1 | 3.22 |
| 3642 | 1 | 3.22 |
| 3643 | 1 | 3.22 |
| 3644 | 1 | 3.22 |
| 3645 | 1 | 3.22 |
| 3646 | 1 | 3.22 |
| 3647 | 1 | 3.22 |
| 3648 | 1 | 3.22 |
| 3649 | 1 | 3.22 |
| 3650 | 1 | 3.22 |
| 3651 | 1 | 3.22 |
| 3652 | 1 | 3.22 |
| 3653 | 1 | 3.22 |
| 3654 | 1 | 3.22 |
| 3655 | 1 | 3.22 |
| 3656 | 1 | 3.22 |
| 3657 | 1 | 3.22 |
| 3658 | 1 | 3.22 |
| 3659 | 1 | 3.22 |
| 3660 | 1 | 3.21 |
| 3661 | 1 | 3.22 |
| 3662 | 1 | 3.22 |
| 3663 | 1 | 3.22 |
| 3664 | 1 | 3.21 |
| 3665 | 1 | 3.22 |
| 3666 | 1 | 3.22 |
| 3667 | 1 | 3.22 |
| 3668 | 1 | 3.22 |
| 3669 | 1 | 3.22 |
| 3670 | 1 | 3.22 |
| 3671 | 1 | 3.22 |
| 3672 | 1 | 3.22 |
| 3673 | 1 | 3.22 |
| 3674 | 1 | 3.22 |
| 3675 | 1 | 3.22 |
| 3676 | 1 | 3.22 |
| 3677 | 1 | 3.22 |
| 3678 | 1 | 3.22 |
| 3679 | 1 | 3.22 |
| 3680 | 1 | 3.22 |
| 3681 | 1 | 3.22 |
| 3682 | 1 | 3.22 |
| 3683 | 1 | 3.22 |
| 3684 | 1 | 3.22 |
| 3685 | 1 | 3.22 |
| 3686 | 1 | 3.22 |
| 3687 | 1 | 3.22 |
| 3688 | 1 | 3.22 |
| 3689 | 1 | 3.22 |
| 3690 | 1 | 3.22 |
| 3691 | 1 | 3.22 |
| 3692 | 1 | 3.22 |
| 3693 | 1 | 3.22 |
| 3694 | 1 | 3.21 |
| 3695 | 1 | 3.22 |
| 3696 | 1 | 3.21 |
| 3697 | 1 | 3.21 |
| 3698 | 1 | 3.22 |
| 3699 | 1 | 3.22 |
| 3700 | 1 | 3.22 |
| 3701 | 1 | 3.22 |
| 3702 | 1 | 3.22 |
| 3703 | 1 | 3.22 |
| 3704 | 1 | 3.22 |
| 3705 | 1 | 3.22 |
| 3706 | 1 | 3.22 |
| 3707 | 1 | 3.22 |
| 3708 | 1 | 3.22 |
| 3709 | 1 | 3.22 |
| 3710 | 1 | 3.22 |
| 3711 | 1 | 3.22 |
| 3712 | 1 | 3.22 |
| 3713 | 1 | 3.22 |
| 3714 | 1 | 3.22 |
| 3715 | 1 | 3.22 |
| 3716 | 1 | 3.22 |
| 3717 | 1 | 3.22 |
| 3718 | 1 | 3.22 |
| 3719 | 1 | 3.21 |
| 3720 | 1 | 3.22 |
| 3721 | 1 | 3.22 |
| 3722 | 1 | 3.22 |
| 3723 | 1 | 3.22 |
| 3724 | 1 | 3.22 |
| 3725 | 1 | 3.22 |
| 3726 | 1 | 3.22 |
| 3727 | 1 | 3.22 |
| 3728 | 1 | 3.22 |
| 3729 | 1 | 3.22 |
| 3730 | 1 | 3.22 |
| 3731 | 1 | 3.22 |
| 3732 | 1 | 3.21 |
| 3733 | 1 | 3.22 |
| 3734 | 1 | 3.22 |
| 3735 | 1 | 3.22 |
| 3736 | 1 | 3.22 |
| 3737 | 1 | 3.22 |
| 3738 | 1 | 3.22 |
| 3739 | 1 | 3.22 |
| 3740 | 1 | 3.22 |
| 3741 | 1 | 3.22 |
| 3742 | 1 | 3.21 |
| 3743 | 1 | 3.22 |
| 3744 | 1 | 3.21 |
| 3745 | 1 | 3.21 |
| 3746 | 1 | 3.22 |
| 3747 | 1 | 3.22 |
| 3748 | 1 | 3.22 |
| 3749 | 1 | 3.22 |
| 3750 | 1 | 3.22 |
| 3751 | 1 | 3.22 |
| 3752 | 1 | 3.22 |
| 3753 | 1 | 3.21 |
| 3754 | 1 | 3.21 |
| 3755 | 1 | 3.22 |
| 3756 | 1 | 3.21 |
| 3757 | 1 | 3.21 |
| 3758 | 1 | 3.22 |
| 3759 | 1 | 3.22 |
| 3760 | 1 | 3.21 |
| 3761 | 1 | 3.22 |
| 3762 | 1 | 3.21 |
| 3763 | 1 | 3.21 |
| 3764 | 1 | 3.22 |
| 3765 | 1 | 3.21 |
| 3766 | 1 | 3.22 |
| 3767 | 1 | 3.22 |
| 3768 | 1 | 3.22 |
| 3769 | 1 | 3.21 |
| 3770 | 1 | 3.21 |
| 3771 | 1 | 3.22 |
| 3772 | 1 | 3.22 |
| 3773 | 1 | 3.22 |
| 3774 | 1 | 3.22 |
| 3775 | 1 | 3.22 |
| 3776 | 1 | 3.22 |
| 3777 | 1 | 3.21 |
| 3778 | 1 | 3.22 |
| 3779 | 1 | 3.21 |
| 3780 | 1 | 3.21 |
| 3781 | 1 | 3.21 |
| 3782 | 1 | 3.21 |
| 3783 | 1 | 3.22 |
| 3784 | 1 | 3.22 |
| 3785 | 1 | 3.21 |
| 3786 | 1 | 3.21 |
| 3787 | 1 | 3.22 |
| 3788 | 1 | 3.22 |
| 3789 | 1 | 3.22 |
| 3790 | 1 | 3.21 |
| 3791 | 1 | 3.22 |
| 3792 | 1 | 3.22 |
| 3793 | 1 | 3.21 |
| 3794 | 1 | 3.21 |
| 3795 | 1 | 3.21 |
| 3796 | 1 | 3.22 |
| 3797 | 1 | 3.21 |
| 3798 | 1 | 3.22 |
| 3799 | 1 | 3.21 |
| 3800 | 1 | 3.22 |
| 3801 | 1 | 3.21 |
| 3802 | 1 | 3.22 |
| 3803 | 1 | 3.21 |
| 3804 | 1 | 3.21 |
| 3805 | 1 | 3.22 |
| 3806 | 1 | 3.21 |
| 3807 | 1 | 3.21 |
| 3808 | 1 | 3.21 |
| 3809 | 1 | 3.21 |
| 3810 | 1 | 3.21 |
| 3811 | 1 | 3.21 |
| 3812 | 1 | 3.22 |
| 3813 | 1 | 3.21 |
| 3814 | 1 | 3.22 |
| 3815 | 1 | 3.22 |
| 3816 | 1 | 3.21 |
| 3817 | 1 | 3.21 |
| 3818 | 1 | 3.21 |
| 3819 | 1 | 3.21 |
| 3820 | 1 | 3.21 |
| 3821 | 1 | 3.21 |
| 3822 | 1 | 3.21 |
| 3823 | 1 | 3.21 |
| 3824 | 1 | 3.21 |
| 3825 | 1 | 3.21 |
| 3826 | 1 | 3.21 |
| 3827 | 1 | 3.22 |
| 3828 | 1 | 3.21 |
| 3829 | 1 | 3.21 |
| 3830 | 1 | 3.21 |
| 3831 | 1 | 3.21 |
| 3832 | 1 | 3.22 |
| 3833 | 1 | 3.21 |
| 3834 | 1 | 3.21 |
| 3835 | 1 | 3.21 |
| 3836 | 1 | 3.21 |
| 3837 | 1 | 3.21 |
| 3838 | 1 | 3.21 |
| 3839 | 1 | 3.21 |
| 3840 | 1 | 3.21 |
| 3841 | 1 | 3.21 |
| 3842 | 1 | 3.21 |
| 3843 | 1 | 3.21 |
| 3844 | 1 | 3.21 |
| 3845 | 1 | 3.21 |
| 3846 | 1 | 3.21 |
| 3847 | 1 | 3.21 |
| 3848 | 1 | 3.21 |
| 3849 | 1 | 3.21 |
| 3850 | 1 | 3.21 |
| 3851 | 1 | 3.22 |
| 3852 | 1 | 3.21 |
| 3853 | 1 | 3.21 |
| 3854 | 1 | 3.21 |
| 3855 | 1 | 3.21 |
| 3856 | 1 | 3.22 |
| 3857 | 1 | 3.21 |
| 3858 | 1 | 3.21 |
| 3859 | 1 | 3.21 |
| 3860 | 1 | 3.21 |
| 3861 | 1 | 3.21 |
| 3862 | 1 | 3.21 |
| 3863 | 1 | 3.21 |
| 3864 | 1 | 3.21 |
| 3865 | 1 | 3.21 |
| 3866 | 1 | 3.21 |
| 3867 | 1 | 3.21 |
| 3868 | 1 | 3.21 |
| 3869 | 1 | 3.21 |
| 3870 | 1 | 3.21 |
| 3871 | 1 | 3.21 |
| 3872 | 1 | 3.21 |
| 3873 | 1 | 3.21 |
| 3874 | 1 | 3.21 |
| 3875 | 1 | 3.21 |
| 3876 | 1 | 3.21 |
| 3877 | 1 | 3.21 |
| 3878 | 1 | 3.21 |
| 3879 | 1 | 3.21 |
| 3880 | 1 | 3.21 |
| 3881 | 1 | 3.21 |
| 3882 | 1 | 3.21 |
| 3883 | 1 | 3.21 |
| 3884 | 1 | 3.21 |
| 3885 | 1 | 3.21 |
| 3886 | 1 | 3.21 |
| 3887 | 1 | 3.21 |
| 3888 | 1 | 3.21 |
| 3889 | 1 | 3.21 |
| 3890 | 1 | 3.21 |
| 3891 | 1 | 3.21 |
| 3892 | 1 | 3.21 |
| 3893 | 1 | 3.21 |
| 3894 | 1 | 3.21 |
| 3895 | 1 | 3.21 |
| 3896 | 1 | 3.21 |
| 3897 | 1 | 3.21 |
| 3898 | 1 | 3.21 |
| 3899 | 1 | 3.21 |
| 3900 | 1 | 3.21 |
| 3901 | 1 | 3.21 |
| 3902 | 1 | 3.21 |
| 3903 | 1 | 3.21 |
| 3904 | 1 | 3.21 |
| 3905 | 1 | 3.21 |
| 3906 | 1 | 3.21 |
| 3907 | 1 | 3.21 |
| 3908 | 1 | 3.21 |
| 3909 | 1 | 3.21 |
| 3910 | 1 | 3.21 |
| 3911 | 1 | 3.21 |
| 3912 | 1 | 3.21 |
| 3913 | 1 | 3.21 |
| 3914 | 1 | 3.21 |
| 3915 | 1 | 3.21 |
| 3916 | 1 | 3.21 |
| 3917 | 1 | 3.21 |
| 3918 | 1 | 3.21 |
| 3919 | 1 | 3.21 |
| 3920 | 1 | 3.21 |
| 3921 | 1 | 3.21 |
| 3922 | 1 | 3.21 |
| 3923 | 1 | 3.21 |
| 3924 | 1 | 3.21 |
| 3925 | 1 | 3.21 |
| 3926 | 1 | 3.21 |
| 3927 | 1 | 3.21 |
| 3928 | 1 | 3.21 |
| 3929 | 1 | 3.21 |
| 3930 | 1 | 3.21 |
| 3931 | 1 | 3.21 |
| 3932 | 1 | 3.21 |
| 3933 | 1 | 3.21 |
| 3934 | 1 | 3.21 |
| 3935 | 1 | 3.21 |
| 3936 | 1 | 3.21 |
| 3937 | 1 | 3.21 |
| 3938 | 1 | 3.21 |
| 3939 | 1 | 3.21 |
| 3940 | 1 | 3.21 |
| 3941 | 1 | 3.21 |
| 3942 | 1 | 3.21 |
| 3943 | 1 | 3.21 |
| 3944 | 1 | 3.21 |
| 3945 | 1 | 3.21 |
| 3946 | 1 | 3.21 |
| 3947 | 1 | 3.21 |
| 3948 | 1 | 3.21 |
| 3949 | 1 | 3.21 |
| 3950 | 1 | 3.21 |
| 3951 | 1 | 3.21 |
| 3952 | 1 | 3.21 |
| 3953 | 1 | 3.21 |
| 3954 | 1 | 3.21 |
| 3955 | 1 | 3.21 |
| 3956 | 1 | 3.21 |
| 3957 | 1 | 3.21 |
| 3958 | 1 | 3.21 |
| 3959 | 1 | 3.21 |
| 3960 | 1 | 3.21 |
| 3961 | 1 | 3.21 |
| 3962 | 1 | 3.21 |
| 3963 | 1 | 3.21 |
| 3964 | 1 | 3.21 |
| 3965 | 1 | 3.21 |
| 3966 | 1 | 3.21 |
| 3967 | 1 | 3.21 |
| 3968 | 1 | 3.21 |
| 3969 | 1 | 3.21 |
| 3970 | 1 | 3.21 |
| 3971 | 1 | 3.21 |
| 3972 | 1 | 3.21 |
| 3973 | 1 | 3.21 |
| 3974 | 1 | 3.21 |
| 3975 | 1 | 3.21 |
| 3976 | 1 | 3.21 |
| 3977 | 1 | 3.21 |
| 3978 | 1 | 3.21 |
| 3979 | 1 | 3.21 |
| 3980 | 1 | 3.21 |
| 3981 | 1 | 3.21 |
| 3982 | 1 | 3.21 |
| 3983 | 1 | 3.21 |
| 3984 | 1 | 3.21 |
| 3985 | 1 | 3.21 |
| 3986 | 1 | 3.21 |
| 3987 | 1 | 3.21 |
| 3988 | 1 | 3.21 |
| 3989 | 1 | 3.21 |
| 3990 | 1 | 3.21 |
| 3991 | 1 | 3.21 |
| 3992 | 1 | 3.21 |
| 3993 | 1 | 3.21 |
| 3994 | 1 | 3.21 |
| 3995 | 1 | 3.21 |
| 3996 | 1 | 3.21 |
| 3997 | 1 | 3.21 |
| 3998 | 1 | 3.21 |
| 3999 | 1 | 3.21 |
| 4000 | 1 | 3.21 |
| 4001 | 1 | 3.21 |
| 4002 | 1 | 3.21 |
| 4003 | 1 | 3.21 |
| 4004 | 1 | 3.21 |
| 4005 | 1 | 3.21 |
| 4006 | 1 | 3.21 |
| 4007 | 1 | 3.21 |
| 4008 | 1 | 3.21 |
| 4009 | 1 | 3.21 |
| 4010 | 1 | 3.21 |
| 4011 | 1 | 3.21 |
| 4012 | 1 | 3.21 |
| 4013 | 1 | 3.21 |
| 4014 | 1 | 3.21 |
| 4015 | 1 | 3.21 |
| 4016 | 1 | 3.21 |
| 4017 | 1 | 3.21 |
| 4018 | 1 | 3.21 |
| 4019 | 1 | 3.21 |
| 4020 | 1 | 3.21 |
| 4021 | 1 | 3.21 |
| 4022 | 1 | 3.21 |
| 4023 | 1 | 3.21 |
| 4024 | 1 | 3.21 |
| 4025 | 1 | 3.21 |
| 4026 | 1 | 3.21 |
| 4027 | 1 | 3.21 |
| 4028 | 1 | 3.21 |
| 4029 | 1 | 3.21 |
| 4030 | 1 | 3.21 |
| 4031 | 1 | 3.21 |
| 4032 | 1 | 3.21 |
| 4033 | 1 | 3.21 |
| 4034 | 1 | 3.21 |
| 4035 | 1 | 3.21 |
| 4036 | 1 | 3.21 |
| 4037 | 1 | 3.21 |
| 4038 | 1 | 3.21 |
| 4039 | 1 | 3.21 |
| 4040 | 1 | 3.21 |
| 4041 | 1 | 3.21 |
| 4042 | 1 | 3.21 |
| 4043 | 1 | 3.21 |
| 4044 | 1 | 3.21 |
| 4045 | 1 | 3.21 |
| 4046 | 1 | 3.21 |
| 4047 | 1 | 3.21 |
| 4048 | 1 | 3.21 |
| 4049 | 1 | 3.21 |
| 4050 | 1 | 3.21 |
| 4051 | 1 | 3.21 |
| 4052 | 1 | 3.21 |
| 4053 | 1 | 3.21 |
| 4054 | 1 | 3.21 |
| 4055 | 1 | 3.21 |
| 4056 | 1 | 3.21 |
| 4057 | 1 | 3.21 |
| 4058 | 1 | 3.21 |
| 4059 | 1 | 3.21 |
| 4060 | 1 | 3.21 |
| 4061 | 1 | 3.21 |
| 4062 | 1 | 3.21 |
| 4063 | 1 | 3.21 |
| 4064 | 1 | 3.21 |
| 4065 | 1 | 3.21 |
| 4066 | 1 | 3.21 |
| 4067 | 1 | 3.21 |
| 4068 | 1 | 3.21 |
| 4069 | 1 | 3.21 |
| 4070 | 1 | 3.21 |
| 4071 | 1 | 3.21 |
| 4072 | 1 | 3.21 |
| 4073 | 1 | 3.21 |
| 4074 | 1 | 3.21 |
| 4075 | 1 | 3.21 |
| 4076 | 1 | 3.21 |
| 4077 | 1 | 3.21 |
| 4078 | 1 | 3.21 |
| 4079 | 1 | 3.21 |
| 4080 | 1 | 3.21 |
| 4081 | 1 | 3.21 |
| 4082 | 1 | 3.21 |
| 4083 | 1 | 3.21 |
| 4084 | 1 | 3.21 |
| 4085 | 1 | 3.21 |
| 4086 | 1 | 3.21 |
| 4087 | 1 | 3.21 |
| 4088 | 1 | 3.21 |
| 4089 | 1 | 3.21 |
| 4090 | 1 | 3.21 |
| 4091 | 1 | 3.21 |
| 4092 | 1 | 3.21 |
| 4093 | 1 | 3.21 |
| 4094 | 1 | 3.21 |
| 4095 | 1 | 3.21 |
| 4096 | 1 | 3.21 |
| 4097 | 1 | 3.21 |
| 4098 | 1 | 3.21 |
| 4099 | 1 | 3.21 |
| 4100 | 1 | 3.21 |
| 4101 | 1 | 3.21 |
| 4102 | 1 | 3.21 |
| 4103 | 1 | 3.21 |
| 4104 | 1 | 3.21 |
| 4105 | 1 | 3.21 |
| 4106 | 1 | 3.21 |
| 4107 | 1 | 3.21 |
| 4108 | 1 | 3.21 |
| 4109 | 1 | 3.21 |
| 4110 | 1 | 3.21 |
| 4111 | 1 | 3.21 |
| 4112 | 1 | 3.21 |
| 4113 | 1 | 3.21 |
| 4114 | 1 | 3.21 |
| 4115 | 1 | 3.21 |
| 4116 | 1 | 3.21 |
| 4117 | 1 | 3.21 |
| 4118 | 1 | 3.21 |
| 4119 | 1 | 3.21 |
| 4120 | 1 | 3.21 |
| 4121 | 1 | 3.21 |
| 4122 | 1 | 3.21 |
| 4123 | 1 | 3.21 |
| 4124 | 1 | 3.21 |
| 4125 | 1 | 3.21 |
| 4126 | 1 | 3.21 |
| 4127 | 1 | 3.21 |
| 4128 | 1 | 3.21 |
| 4129 | 1 | 3.21 |
| 4130 | 1 | 3.21 |
| 4131 | 1 | 3.21 |
| 4132 | 1 | 3.21 |
| 4133 | 1 | 3.21 |
| 4134 | 1 | 3.21 |
| 4135 | 1 | 3.21 |
| 4136 | 1 | 3.21 |
| 4137 | 1 | 3.21 |
| 4138 | 1 | 3.21 |
| 4139 | 1 | 3.21 |
| 4140 | 1 | 3.21 |
| 4141 | 1 | 3.21 |
| 4142 | 1 | 3.21 |
| 4143 | 1 | 3.21 |
| 4144 | 1 | 3.21 |
| 4145 | 1 | 3.21 |
| 4146 | 1 | 3.21 |
| 4147 | 1 | 3.21 |
| 4148 | 1 | 3.21 |
| 4149 | 1 | 3.21 |
| 4150 | 1 | 3.21 |
| 4151 | 1 | 3.21 |
| 4152 | 1 | 3.21 |
| 4153 | 1 | 3.21 |
| 4154 | 1 | 3.21 |
| 4155 | 1 | 3.21 |
| 4156 | 1 | 3.21 |
| 4157 | 1 | 3.21 |
| 4158 | 1 | 3.21 |
| 4159 | 1 | 3.21 |
| 4160 | 1 | 3.21 |
| 4161 | 1 | 3.21 |
| 4162 | 1 | 3.21 |
| 4163 | 1 | 3.21 |
| 4164 | 1 | 3.21 |
| 4165 | 1 | 3.21 |
| 4166 | 1 | 3.21 |
| 4167 | 1 | 3.21 |
| 4168 | 1 | 3.21 |
| 4169 | 1 | 3.21 |
| 4170 | 1 | 3.21 |
| 4171 | 1 | 3.21 |
| 4172 | 1 | 3.21 |
| 4173 | 1 | 3.21 |
| 4174 | 1 | 3.21 |
| 4175 | 1 | 3.21 |
| 4176 | 1 | 3.21 |
| 4177 | 1 | 3.21 |
| 4178 | 1 | 3.21 |
| 4179 | 1 | 3.21 |
| 4180 | 1 | 3.21 |
| 4181 | 1 | 3.21 |
| 4182 | 1 | 3.21 |
| 4183 | 1 | 3.21 |
| 4184 | 1 | 3.21 |
| 4185 | 1 | 3.21 |
| 4186 | 1 | 3.21 |
| 4187 | 1 | 3.21 |
| 4188 | 1 | 3.21 |
| 4189 | 1 | 3.21 |
| 4190 | 1 | 3.21 |
| 4191 | 1 | 3.21 |
| 4192 | 1 | 3.21 |
| 4193 | 1 | 3.21 |
| 4194 | 1 | 3.21 |
| 4195 | 1 | 3.21 |
| 4196 | 1 | 3.21 |
| 4197 | 1 | 3.21 |
| 4198 | 1 | 3.21 |
| 4199 | 1 | 3.21 |
| 4200 | 1 | 3.21 |
| 4201 | 1 | 3.21 |
| 4202 | 1 | 3.21 |
| 4203 | 1 | 3.21 |
| 4204 | 1 | 3.21 |
| 4205 | 1 | 3.21 |
| 4206 | 1 | 3.21 |
| 4207 | 1 | 3.21 |
| 4208 | 1 | 3.21 |
| 4209 | 1 | 3.21 |
| 4210 | 1 | 3.21 |
| 4211 | 1 | 3.21 |
| 4212 | 1 | 3.21 |
| 4213 | 1 | 3.21 |
| 4214 | 1 | 3.21 |
| 4215 | 1 | 3.21 |
| 4216 | 1 | 3.21 |
| 4217 | 1 | 3.21 |
| 4218 | 1 | 3.21 |
| 4219 | 1 | 3.21 |
| 4220 | 1 | 3.21 |
| 4221 | 1 | 3.21 |
| 4222 | 1 | 3.21 |
| 4223 | 1 | 3.21 |
| 4224 | 1 | 3.21 |
| 4225 | 1 | 3.21 |
| 4226 | 1 | 3.21 |
| 4227 | 1 | 3.21 |
| 4228 | 1 | 3.21 |
| 4229 | 1 | 3.21 |
| 4230 | 1 | 3.21 |
| 4231 | 1 | 3.21 |
| 4232 | 1 | 3.21 |
| 4233 | 1 | 3.21 |
| 4234 | 1 | 3.21 |
| 4235 | 1 | 3.21 |
| 4236 | 1 | 3.21 |
| 4237 | 1 | 3.21 |
| 4238 | 1 | 3.21 |
| 4239 | 1 | 3.21 |
| 4240 | 1 | 3.21 |
| 4241 | 1 | 3.21 |
| 4242 | 1 | 3.21 |
| 4243 | 1 | 3.21 |
| 4244 | 1 | 3.21 |
| 4245 | 1 | 3.21 |
| 4246 | 1 | 3.21 |
| 4247 | 1 | 3.21 |
| 4248 | 1 | 3.21 |
| 4249 | 1 | 3.21 |
| 4250 | 1 | 3.21 |
| 4251 | 1 | 3.21 |
| 4252 | 1 | 3.21 |
| 4253 | 1 | 3.21 |
| 4254 | 1 | 3.21 |
| 4255 | 1 | 3.21 |
| 4256 | 1 | 3.21 |
| 4257 | 1 | 3.21 |
| 4258 | 1 | 3.21 |
| 4259 | 1 | 3.21 |
| 4260 | 1 | 3.21 |
| 4261 | 1 | 3.21 |
| 4262 | 1 | 3.21 |
| 4263 | 1 | 3.21 |
| 4264 | 1 | 3.21 |
| 4265 | 1 | 3.21 |
| 4266 | 1 | 3.21 |
| 4267 | 1 | 3.21 |
| 4268 | 1 | 3.21 |
| 4269 | 1 | 3.21 |
| 4270 | 1 | 3.21 |
| 4271 | 1 | 3.21 |
| 4272 | 1 | 3.21 |
| 4273 | 1 | 3.21 |
| 4274 | 1 | 3.21 |
| 4275 | 1 | 3.21 |
| 4276 | 1 | 3.21 |
| 4277 | 1 | 3.21 |
| 4278 | 1 | 3.21 |
| 4279 | 1 | 3.21 |
| 4280 | 1 | 3.21 |
| 4281 | 1 | 3.21 |
| 4282 | 1 | 3.21 |
| 4283 | 1 | 3.21 |
| 4284 | 1 | 3.21 |
| 4285 | 1 | 3.21 |
| 4286 | 1 | 3.21 |
| 4287 | 1 | 3.21 |
| 4288 | 1 | 3.21 |
| 4289 | 1 | 3.21 |
| 4290 | 1 | 3.21 |
| 4291 | 1 | 3.21 |
| 4292 | 1 | 3.21 |
| 4293 | 1 | 3.21 |
| 4294 | 1 | 3.21 |
| 4295 | 1 | 3.21 |
| 4296 | 1 | 3.21 |
| 4297 | 1 | 3.21 |
| 4298 | 1 | 3.21 |
| 4299 | 1 | 3.21 |
| 4300 | 1 | 3.21 |
| 4301 | 1 | 3.21 |
| 4302 | 1 | 3.21 |
| 4303 | 1 | 3.21 |
| 4304 | 1 | 3.21 |
| 4305 | 1 | 3.21 |
| 4306 | 1 | 3.21 |
| 4307 | 1 | 3.21 |
| 4308 | 1 | 3.21 |
| 4309 | 1 | 3.21 |
| 4310 | 1 | 3.21 |
| 4311 | 1 | 3.21 |
| 4312 | 1 | 3.21 |
| 4313 | 1 | 3.21 |
| 4314 | 1 | 3.21 |
| 4315 | 1 | 3.21 |
| 4316 | 1 | 3.21 |
| 4317 | 1 | 3.21 |
| 4318 | 1 | 3.21 |
| 4319 | 1 | 3.21 |
| 4320 | 1 | 3.21 |
| 4321 | 1 | 3.21 |
| 4322 | 1 | 3.21 |
| 4323 | 1 | 3.21 |
| 4324 | 1 | 3.21 |
| 4325 | 1 | 3.21 |
| 4326 | 1 | 3.21 |
| 4327 | 1 | 3.21 |
| 4328 | 1 | 3.21 |
| 4329 | 1 | 3.21 |
| 4330 | 1 | 3.21 |
| 4331 | 1 | 3.21 |
| 4332 | 1 | 3.21 |
| 4333 | 1 | 3.21 |
| 4334 | 1 | 3.21 |
| 4335 | 1 | 3.21 |
| 4336 | 1 | 3.21 |
| 4337 | 1 | 3.21 |
| 4338 | 1 | 3.21 |
| 4339 | 1 | 3.21 |
| 4340 | 1 | 3.21 |
| 4341 | 1 | 3.21 |
| 4342 | 1 | 3.21 |
| 4343 | 1 | 3.21 |
| 4344 | 1 | 3.21 |
| 4345 | 1 | 3.21 |
| 4346 | 1 | 3.21 |
| 4347 | 1 | 3.21 |
| 4348 | 1 | 3.21 |
| 4349 | 1 | 3.21 |
| 4350 | 1 | 3.21 |
| 4351 | 1 | 3.21 |
| 4352 | 1 | 3.21 |
| 4353 | 1 | 3.21 |
| 4354 | 1 | 3.21 |
| 4355 | 1 | 3.21 |
| 4356 | 1 | 3.21 |
| 4357 | 1 | 3.21 |
| 4358 | 1 | 3.21 |
| 4359 | 1 | 3.21 |
| 4360 | 1 | 3.21 |
| 4361 | 1 | 3.21 |
| 4362 | 1 | 3.21 |
| 4363 | 1 | 3.21 |
| 4364 | 1 | 3.21 |
| 4365 | 1 | 3.21 |
| 4366 | 1 | 3.21 |
| 4367 | 1 | 3.21 |
| 4368 | 1 | 3.21 |
| 4369 | 1 | 3.21 |
| 4370 | 1 | 3.21 |
| 4371 | 1 | 3.21 |
| 4372 | 1 | 3.21 |
| 4373 | 1 | 3.21 |
| 4374 | 1 | 3.21 |
| 4375 | 1 | 3.21 |
| 4376 | 1 | 3.21 |
| 4377 | 1 | 3.21 |
| 4378 | 1 | 3.21 |
| 4379 | 1 | 3.21 |
| 4380 | 1 | 3.21 |
| 4381 | 1 | 3.21 |
| 4382 | 1 | 3.21 |
| 4383 | 1 | 3.21 |
| 4384 | 1 | 3.21 |
| 4385 | 1 | 3.21 |
| 4386 | 1 | 3.21 |
| 4387 | 1 | 3.21 |
| 4388 | 1 | 3.21 |
| 4389 | 1 | 3.21 |
| 4390 | 1 | 3.21 |
| 4391 | 1 | 3.21 |
| 4392 | 1 | 3.21 |
| 4393 | 1 | 3.21 |
| 4394 | 1 | 3.21 |
| 4395 | 1 | 3.21 |
| 4396 | 1 | 3.21 |
| 4397 | 1 | 3.21 |
| 4398 | 1 | 3.21 |
| 4399 | 1 | 3.21 |
| 4400 | 1 | 3.21 |
| 4401 | 1 | 3.21 |
| 4402 | 1 | 3.21 |
| 4403 | 1 | 3.21 |
| 4404 | 1 | 3.21 |
| 4405 | 1 | 3.21 |
| 4406 | 1 | 3.21 |
| 4407 | 1 | 3.21 |
| 4408 | 1 | 3.21 |
| 4409 | 1 | 3.21 |
| 4410 | 1 | 3.21 |
| 4411 | 1 | 3.21 |
| 4412 | 1 | 3.21 |
| 4413 | 1 | 3.21 |
| 4414 | 1 | 3.21 |
| 4415 | 1 | 3.21 |
| 4416 | 1 | 3.21 |
| 4417 | 1 | 3.21 |
| 4418 | 1 | 3.21 |
| 4419 | 1 | 3.21 |
| 4420 | 1 | 3.21 |
| 4421 | 1 | 3.21 |
| 4422 | 1 | 3.21 |
| 4423 | 1 | 3.21 |
| 4424 | 1 | 3.21 |
| 4425 | 1 | 3.21 |
| 4426 | 1 | 3.21 |
| 4427 | 1 | 3.21 |
| 4428 | 1 | 3.21 |
| 4429 | 1 | 3.21 |
| 4430 | 1 | 3.21 |
| 4431 | 1 | 3.21 |
| 4432 | 1 | 3.21 |
| 4433 | 1 | 3.21 |
| 4434 | 1 | 3.21 |
| 4435 | 1 | 3.21 |
| 4436 | 1 | 3.21 |
| 4437 | 1 | 3.21 |
| 4438 | 1 | 3.21 |
| 4439 | 1 | 3.21 |
| 4440 | 1 | 3.21 |
| 4441 | 1 | 3.21 |
| 4442 | 1 | 3.21 |
| 4443 | 1 | 3.21 |
| 4444 | 1 | 3.21 |
| 4445 | 1 | 3.21 |
| 4446 | 1 | 3.21 |
| 4447 | 1 | 3.21 |
| 4448 | 1 | 3.21 |
| 4449 | 1 | 3.21 |
| 4450 | 1 | 3.21 |
| 4451 | 1 | 3.21 |
| 4452 | 1 | 3.21 |
| 4453 | 1 | 3.21 |
| 4454 | 1 | 3.21 |
| 4455 | 1 | 3.21 |
| 4456 | 1 | 3.21 |
| 4457 | 1 | 3.21 |
| 4458 | 1 | 3.21 |
| 4459 | 1 | 3.21 |
| 4460 | 1 | 3.21 |
| 4461 | 1 | 3.21 |
| 4462 | 1 | 3.21 |
| 4463 | 1 | 3.21 |
| 4464 | 1 | 3.21 |
| 4465 | 1 | 3.21 |
| 4466 | 1 | 3.21 |
| 4467 | 1 | 3.21 |
| 4468 | 1 | 3.21 |
| 4469 | 1 | 3.21 |
| 4470 | 1 | 3.21 |
| 4471 | 1 | 3.21 |
| 4472 | 1 | 3.21 |
| 4473 | 1 | 3.21 |
| 4474 | 1 | 3.21 |
| 4475 | 1 | 3.21 |
| 4476 | 1 | 3.21 |
| 4477 | 1 | 3.21 |
| 4478 | 1 | 3.21 |
| 4479 | 1 | 3.21 |
| 4480 | 1 | 3.21 |
| 4481 | 1 | 3.21 |
| 4482 | 1 | 3.21 |
| 4483 | 1 | 3.21 |
| 4484 | 1 | 3.21 |
| 4485 | 1 | 3.21 |
| 4486 | 1 | 3.21 |
| 4487 | 1 | 3.21 |
| 4488 | 1 | 3.21 |
| 4489 | 1 | 3.21 |
| 4490 | 1 | 3.21 |
| 4491 | 1 | 3.21 |
| 4492 | 1 | 3.21 |
| 4493 | 1 | 3.21 |
| 4494 | 1 | 3.21 |
| 4495 | 1 | 3.21 |
| 4496 | 1 | 3.21 |
| 4497 | 1 | 3.21 |
| 4498 | 1 | 3.21 |
| 4499 | 1 | 3.21 |
| 4500 | 1 | 3.21 |
| 4501 | 1 | 3.21 |
| 4502 | 1 | 3.21 |
| 4503 | 1 | 3.21 |
| 4504 | 1 | 3.21 |
| 4505 | 1 | 3.21 |
| 4506 | 1 | 3.21 |
| 4507 | 1 | 3.21 |
| 4508 | 1 | 3.21 |
| 4509 | 1 | 3.21 |
| 4510 | 1 | 3.21 |
| 4511 | 1 | 3.21 |
| 4512 | 1 | 3.21 |
| 4513 | 1 | 3.21 |
| 4514 | 1 | 3.21 |
| 4515 | 1 | 3.21 |
| 4516 | 1 | 3.21 |
| 4517 | 1 | 3.21 |
| 4518 | 1 | 3.21 |
| 4519 | 1 | 3.21 |
| 4520 | 1 | 3.21 |
| 4521 | 1 | 3.21 |
| 4522 | 1 | 3.21 |
| 4523 | 1 | 3.21 |
| 4524 | 1 | 3.21 |
| 4525 | 1 | 3.21 |
| 4526 | 1 | 3.21 |
| 4527 | 1 | 3.21 |
| 4528 | 1 | 3.21 |
| 4529 | 1 | 3.21 |
| 4530 | 1 | 3.21 |
| 4531 | 1 | 3.21 |
| 4532 | 1 | 3.21 |
| 4533 | 1 | 3.21 |
| 4534 | 1 | 3.21 |
| 4535 | 1 | 3.21 |
| 4536 | 1 | 3.21 |
| 4537 | 1 | 3.21 |
| 4538 | 1 | 3.21 |
| 4539 | 1 | 3.21 |
| 4540 | 1 | 3.21 |
| 4541 | 1 | 3.21 |
| 4542 | 1 | 3.21 |
| 4543 | 1 | 3.21 |
| 4544 | 1 | 3.21 |
| 4545 | 1 | 3.21 |
| 4546 | 1 | 3.21 |
| 4547 | 1 | 3.21 |
| 4548 | 1 | 3.21 |
| 4549 | 1 | 3.21 |
| 4550 | 1 | 3.21 |
| 4551 | 1 | 3.21 |
| 4552 | 1 | 3.21 |
| 4553 | 1 | 3.21 |
| 4554 | 1 | 3.21 |
| 4555 | 1 | 3.21 |
| 4556 | 1 | 3.21 |
| 4557 | 1 | 3.21 |
| 4558 | 1 | 3.21 |
| 4559 | 1 | 3.21 |
| 4560 | 1 | 3.21 |
| 4561 | 1 | 3.21 |
| 4562 | 1 | 3.21 |
| 4563 | 1 | 3.21 |
| 4564 | 1 | 3.21 |
| 4565 | 1 | 3.21 |
| 4566 | 1 | 3.21 |
| 4567 | 1 | 3.21 |
| 4568 | 1 | 3.21 |
| 4569 | 1 | 3.21 |
| 4570 | 1 | 3.21 |
| 4571 | 1 | 3.21 |
| 4572 | 1 | 3.21 |
| 4573 | 1 | 3.21 |
| 4574 | 1 | 3.21 |
| 4575 | 1 | 3.21 |
| 4576 | 1 | 3.21 |
| 4577 | 1 | 3.21 |
| 4578 | 1 | 3.21 |
| 4579 | 1 | 3.21 |
| 4580 | 1 | 3.21 |
| 4581 | 1 | 3.21 |
| 4582 | 1 | 3.21 |
| 4583 | 1 | 3.21 |
| 4584 | 1 | 3.21 |
| 4585 | 1 | 3.21 |
| 4586 | 1 | 3.21 |
| 4587 | 1 | 3.21 |
| 4588 | 1 | 3.21 |
| 4589 | 1 | 3.21 |
| 4590 | 1 | 3.21 |
| 4591 | 1 | 3.21 |
| 4592 | 1 | 3.21 |
| 4593 | 1 | 3.21 |
| 4594 | 1 | 3.21 |
| 4595 | 1 | 3.21 |
| 4596 | 1 | 3.21 |
| 4597 | 1 | 3.21 |
| 4598 | 1 | 3.21 |
| 4599 | 1 | 3.21 |
| 4600 | 1 | 3.21 |
| 4601 | 1 | 3.21 |
| 4602 | 1 | 3.21 |
| 4603 | 1 | 3.21 |
| 4604 | 1 | 3.21 |
| 4605 | 1 | 3.21 |
| 4606 | 1 | 3.21 |
| 4607 | 1 | 3.21 |
| 4608 | 1 | 3.21 |
| 4609 | 1 | 3.21 |
| 4610 | 1 | 3.21 |
| 4611 | 1 | 3.21 |
| 4612 | 1 | 3.21 |
| 4613 | 1 | 3.21 |
| 4614 | 1 | 3.21 |
| 4615 | 1 | 3.21 |
| 4616 | 1 | 3.21 |
| 4617 | 1 | 3.21 |
| 4618 | 1 | 3.21 |
| 4619 | 1 | 3.21 |
| 4620 | 1 | 3.21 |
| 4621 | 1 | 3.21 |
| 4622 | 1 | 3.21 |
| 4623 | 1 | 3.21 |
| 4624 | 1 | 3.21 |
| 4625 | 1 | 3.21 |
| 4626 | 1 | 3.21 |
| 4627 | 1 | 3.21 |
| 4628 | 1 | 3.21 |
| 4629 | 1 | 3.21 |
| 4630 | 1 | 3.21 |
| 4631 | 1 | 3.21 |
| 4632 | 1 | 3.21 |
| 4633 | 1 | 3.21 |
| 4634 | 1 | 3.21 |
| 4635 | 1 | 3.21 |
| 4636 | 1 | 3.21 |
| 4637 | 1 | 3.21 |
| 4638 | 1 | 3.21 |
| 4639 | 1 | 3.21 |
| 4640 | 1 | 3.21 |
| 4641 | 1 | 3.21 |
| 4642 | 1 | 3.21 |
| 4643 | 1 | 3.21 |
| 4644 | 1 | 3.21 |
| 4645 | 1 | 3.21 |
| 4646 | 1 | 3.21 |
| 4647 | 1 | 3.21 |
| 4648 | 1 | 3.21 |
| 4649 | 1 | 3.21 |
| 4650 | 1 | 3.21 |
| 4651 | 1 | 3.21 |
| 4652 | 1 | 3.21 |
| 4653 | 1 | 3.21 |
| 4654 | 1 | 3.21 |
| 4655 | 1 | 3.21 |
| 4656 | 1 | 3.21 |
| 4657 | 1 | 3.21 |
| 4658 | 1 | 3.21 |
| 4659 | 1 | 3.21 |
| 4660 | 1 | 3.21 |
| 4661 | 1 | 3.21 |
| 4662 | 1 | 3.21 |
| 4663 | 1 | 3.21 |
| 4664 | 1 | 3.21 |
| 4665 | 1 | 3.21 |
| 4666 | 1 | 3.21 |
| 4667 | 1 | 3.21 |
| 4668 | 1 | 3.21 |
| 4669 | 1 | 3.21 |
| 4670 | 1 | 3.21 |
| 4671 | 1 | 3.21 |
| 4672 | 1 | 3.21 |
| 4673 | 1 | 3.21 |
| 4674 | 1 | 3.21 |
| 4675 | 1 | 3.21 |
| 4676 | 1 | 3.21 |
| 4677 | 1 | 3.21 |
| 4678 | 1 | 3.21 |
| 4679 | 1 | 3.21 |
| 4680 | 1 | 3.21 |
| 4681 | 1 | 3.21 |
| 4682 | 1 | 3.21 |
| 4683 | 1 | 3.21 |
| 4684 | 1 | 3.21 |
| 4685 | 1 | 3.21 |
| 4686 | 1 | 3.21 |
| 4687 | 1 | 3.21 |
| 4688 | 1 | 3.21 |
| 4689 | 1 | 3.21 |
| 4690 | 1 | 3.21 |
| 4691 | 1 | 3.21 |
| 4692 | 1 | 3.21 |
| 4693 | 1 | 3.21 |
| 4694 | 1 | 3.21 |
| 4695 | 1 | 3.21 |
| 4696 | 1 | 3.21 |
| 4697 | 1 | 3.21 |
| 4698 | 1 | 3.21 |
| 4699 | 1 | 3.21 |
| 4700 | 1 | 3.21 |
| 4701 | 1 | 3.21 |
| 4702 | 1 | 3.21 |
| 4703 | 1 | 3.21 |
| 4704 | 1 | 3.21 |
| 4705 | 1 | 3.21 |
| 4706 | 1 | 3.21 |
| 4707 | 1 | 3.21 |
| 4708 | 1 | 3.21 |
| 4709 | 1 | 3.21 |
| 4710 | 1 | 3.21 |
| 4711 | 1 | 3.21 |
| 4712 | 1 | 3.21 |
| 4713 | 1 | 3.21 |
| 4714 | 1 | 3.21 |
| 4715 | 1 | 3.21 |
| 4716 | 1 | 3.21 |
| 4717 | 1 | 3.21 |
| 4718 | 1 | 3.21 |
| 4719 | 1 | 3.21 |
| 4720 | 1 | 3.21 |
| 4721 | 1 | 3.21 |
| 4722 | 1 | 3.21 |
| 4723 | 1 | 3.21 |
| 4724 | 1 | 3.21 |
| 4725 | 1 | 3.21 |
| 4726 | 1 | 3.21 |
| 4727 | 1 | 3.21 |
| 4728 | 1 | 3.21 |
| 4729 | 1 | 3.21 |
| 4730 | 1 | 3.21 |
| 4731 | 1 | 3.21 |
| 4732 | 1 | 3.21 |
| 4733 | 1 | 3.21 |
| 4734 | 1 | 3.21 |
| 4735 | 1 | 3.21 |
| 4736 | 1 | 3.21 |
| 4737 | 1 | 3.21 |
| 4738 | 1 | 3.21 |
| 4739 | 1 | 3.21 |
| 4740 | 1 | 3.21 |
| 4741 | 1 | 3.21 |
| 4742 | 1 | 3.21 |
| 4743 | 1 | 3.21 |
| 4744 | 1 | 3.21 |
| 4745 | 1 | 3.21 |
| 4746 | 1 | 3.21 |
| 4747 | 1 | 3.21 |
| 4748 | 1 | 3.21 |
| 4749 | 1 | 3.21 |
| 4750 | 1 | 3.21 |
| 4751 | 1 | 3.21 |
| 4752 | 1 | 3.21 |
| 4753 | 1 | 3.21 |
| 4754 | 1 | 3.21 |
| 4755 | 1 | 3.21 |
| 4756 | 1 | 3.21 |
| 4757 | 1 | 3.21 |
| 4758 | 1 | 3.21 |
| 4759 | 1 | 3.21 |
| 4760 | 1 | 3.21 |
| 4761 | 1 | 3.21 |
| 4762 | 1 | 3.21 |
| 4763 | 1 | 3.21 |
| 4764 | 1 | 3.21 |
| 4765 | 1 | 3.21 |
| 4766 | 1 | 3.21 |
| 4767 | 1 | 3.21 |
| 4768 | 1 | 3.21 |
| 4769 | 1 | 3.21 |
| 4770 | 1 | 3.21 |
| 4771 | 1 | 3.21 |
| 4772 | 1 | 3.21 |
| 4773 | 1 | 3.21 |
| 4774 | 1 | 3.21 |
| 4775 | 1 | 3.21 |
| 4776 | 1 | 3.21 |
| 4777 | 1 | 3.21 |
| 4778 | 1 | 3.21 |
| 4779 | 1 | 3.21 |
| 4780 | 1 | 3.21 |
| 4781 | 1 | 3.21 |
| 4782 | 1 | 3.21 |
| 4783 | 1 | 3.21 |
| 4784 | 1 | 3.21 |
| 4785 | 1 | 3.21 |
| 4786 | 1 | 3.21 |
| 4787 | 1 | 3.21 |
| 4788 | 1 | 3.21 |
| 4789 | 1 | 3.21 |
| 4790 | 1 | 3.21 |
| 4791 | 1 | 3.21 |
| 4792 | 1 | 3.21 |
| 4793 | 1 | 3.21 |
| 4794 | 1 | 3.21 |
| 4795 | 1 | 3.21 |
| 4796 | 1 | 3.21 |
| 4797 | 1 | 3.21 |
| 4798 | 1 | 3.21 |
| 4799 | 1 | 3.21 |
| 4800 | 1 | 3.21 |
| 4801 | 1 | 3.21 |
| 4802 | 1 | 3.21 |
| 4803 | 1 | 3.21 |
| 4804 | 1 | 3.21 |
| 4805 | 1 | 3.21 |
| 4806 | 1 | 3.21 |
| 4807 | 1 | 3.21 |
| 4808 | 1 | 3.21 |
| 4809 | 1 | 3.21 |
| 4810 | 1 | 3.21 |
| 4811 | 1 | 3.21 |
| 4812 | 1 | 3.21 |
| 4813 | 1 | 3.21 |
| 4814 | 1 | 3.21 |
| 4815 | 1 | 3.21 |
| 4816 | 1 | 3.21 |
| 4817 | 1 | 3.21 |
| 4818 | 1 | 3.21 |
| 4819 | 1 | 3.21 |
| 4820 | 1 | 3.21 |
| 4821 | 1 | 3.21 |
| 4822 | 1 | 3.21 |
| 4823 | 1 | 3.21 |
| 4824 | 1 | 3.21 |
| 4825 | 1 | 3.21 |
| 4826 | 1 | 3.21 |
| 4827 | 1 | 3.21 |
| 4828 | 1 | 3.21 |
| 4829 | 1 | 3.21 |
| 4830 | 1 | 3.21 |
| 4831 | 1 | 3.21 |
| 4832 | 1 | 3.21 |
| 4833 | 1 | 3.21 |
| 4834 | 1 | 3.21 |
| 4835 | 1 | 3.21 |
| 4836 | 1 | 3.21 |
| 4837 | 1 | 3.21 |
| 4838 | 1 | 3.21 |
| 4839 | 1 | 3.21 |
| 4840 | 1 | 3.21 |
| 4841 | 1 | 3.21 |
| 4842 | 1 | 3.21 |
| 4843 | 1 | 3.21 |
| 4844 | 1 | 3.21 |
| 4845 | 1 | 3.21 |
| 4846 | 1 | 3.21 |
| 4847 | 1 | 3.21 |
| 4848 | 1 | 3.21 |
| 4849 | 1 | 3.21 |
| 4850 | 1 | 3.21 |
| 4851 | 1 | 3.21 |
| 4852 | 1 | 3.21 |
| 4853 | 1 | 3.21 |
| 4854 | 1 | 3.21 |
| 4855 | 1 | 3.21 |
| 4856 | 1 | 3.21 |
| 4857 | 1 | 3.21 |
| 4858 | 1 | 3.21 |
| 4859 | 1 | 3.21 |
| 4860 | 1 | 3.21 |
| 4861 | 1 | 3.21 |
| 4862 | 1 | 3.21 |
| 4863 | 1 | 3.21 |
| 4864 | 1 | 3.21 |
| 4865 | 1 | 3.21 |
| 4866 | 1 | 3.21 |
| 4867 | 1 | 3.21 |
| 4868 | 1 | 3.21 |
| 4869 | 1 | 3.21 |
| 4870 | 1 | 3.21 |
| 4871 | 1 | 3.21 |
| 4872 | 1 | 3.21 |
| 4873 | 1 | 3.21 |
| 4874 | 1 | 3.21 |
| 4875 | 1 | 3.21 |
| 4876 | 1 | 3.21 |
| 4877 | 1 | 3.21 |
| 4878 | 1 | 3.21 |
| 4879 | 1 | 3.21 |
| 4880 | 1 | 3.21 |
| 4881 | 1 | 3.21 |
| 4882 | 1 | 3.21 |
| 4883 | 1 | 3.21 |
| 4884 | 1 | 3.21 |
| 4885 | 1 | 3.21 |
| 4886 | 1 | 3.21 |
| 4887 | 1 | 3.21 |
| 4888 | 1 | 3.21 |
| 4889 | 1 | 3.21 |
| 4890 | 1 | 3.21 |
| 4891 | 1 | 3.21 |
| 4892 | 1 | 3.21 |
| 4893 | 1 | 3.21 |
| 4894 | 1 | 3.21 |
| 4895 | 1 | 3.21 |
| 4896 | 1 | 3.21 |
| 4897 | 1 | 3.21 |
| 4898 | 1 | 3.21 |
| 4899 | 1 | 3.21 |
| 4900 | 1 | 3.21 |
| 4901 | 1 | 3.21 |
| 4902 | 1 | 3.21 |
| 4903 | 1 | 3.21 |
| 4904 | 1 | 3.21 |
| 4905 | 1 | 3.21 |
| 4906 | 1 | 3.21 |
| 4907 | 1 | 3.21 |
| 4908 | 1 | 3.21 |
| 4909 | 1 | 3.21 |
| 4910 | 1 | 3.21 |
| 4911 | 1 | 3.21 |
| 4912 | 1 | 3.21 |
| 4913 | 1 | 3.21 |
| 4914 | 1 | 3.21 |
| 4915 | 1 | 3.21 |
| 4916 | 1 | 3.21 |
| 4917 | 1 | 3.21 |
| 4918 | 1 | 3.21 |
| 4919 | 1 | 3.21 |
| 4920 | 1 | 3.21 |
| 4921 | 1 | 3.21 |
| 4922 | 1 | 3.21 |
| 4923 | 1 | 3.21 |
| 4924 | 1 | 3.21 |
| 4925 | 1 | 3.21 |
| 4926 | 1 | 3.21 |
| 4927 | 1 | 3.21 |
| 4928 | 1 | 3.21 |
| 4929 | 1 | 3.21 |
| 4930 | 1 | 3.21 |
| 4931 | 1 | 3.21 |
| 4932 | 1 | 3.21 |
| 4933 | 1 | 3.21 |
| 4934 | 1 | 3.21 |
| 4935 | 1 | 3.21 |
| 4936 | 1 | 3.21 |
| 4937 | 1 | 3.21 |
| 4938 | 1 | 3.21 |
| 4939 | 1 | 3.21 |
| 4940 | 1 | 3.21 |
| 4941 | 1 | 3.21 |
| 4942 | 1 | 3.21 |
| 4943 | 1 | 3.21 |
| 4944 | 1 | 3.21 |
| 4945 | 1 | 3.21 |
| 4946 | 1 | 3.21 |
| 4947 | 1 | 3.21 |
| 4948 | 1 | 3.21 |
| 4949 | 1 | 3.21 |
| 4950 | 1 | 3.21 |
| 4951 | 1 | 3.21 |
| 4952 | 1 | 3.21 |
| 4953 | 1 | 3.21 |
| 4954 | 1 | 3.21 |
| 4955 | 1 | 3.21 |
| 4956 | 1 | 3.21 |
| 4957 | 1 | 3.21 |
| 4958 | 1 | 3.21 |
| 4959 | 1 | 3.21 |
| 4960 | 1 | 3.21 |
| 4961 | 1 | 3.21 |
| 4962 | 1 | 3.21 |
| 4963 | 1 | 3.21 |
| 4964 | 1 | 3.21 |
| 4965 | 1 | 3.21 |
| 4966 | 1 | 3.21 |
| 4967 | 1 | 3.21 |
| 4968 | 1 | 3.21 |
| 4969 | 1 | 3.21 |
| 4970 | 1 | 3.21 |
| 4971 | 1 | 3.21 |
| 4972 | 1 | 3.21 |
| 4973 | 1 | 3.21 |
| 4974 | 1 | 3.21 |
| 4975 | 1 | 3.21 |
| 4976 | 1 | 3.21 |
| 4977 | 1 | 3.21 |
| 4978 | 1 | 3.21 |
| 4979 | 1 | 3.21 |
| 4980 | 1 | 3.21 |
| 4981 | 1 | 3.21 |
| 4982 | 1 | 3.21 |
| 4983 | 1 | 3.21 |
| 4984 | 1 | 3.21 |
| 4985 | 1 | 3.21 |
| 4986 | 1 | 3.21 |
| 4987 | 1 | 3.21 |
| 4988 | 1 | 3.21 |
| 4989 | 1 | 3.21 |
| 4990 | 1 | 3.21 |
| 4991 | 1 | 3.21 |
| 4992 | 1 | 3.21 |
| 4993 | 1 | 3.21 |
| 4994 | 1 | 3.21 |
| 4995 | 1 | 3.21 |
| 4996 | 1 | 3.21 |
| 4997 | 1 | 3.21 |
| 4998 | 1 | 3.21 |
| 4999 | 1 | 3.21 |
| 5000 | 1 | 3.21 |
| 5001 | 1 | 3.21 |
| 5002 | 1 | 3.21 |
| 5003 | 1 | 3.21 |
| 5004 | 1 | 3.21 |
| 5005 | 1 | 3.21 |
| 5006 | 1 | 3.21 |
| 5007 | 1 | 3.21 |
| 5008 | 1 | 3.21 |
| 5009 | 1 | 3.21 |
| 5010 | 1 | 3.21 |
| 5011 | 1 | 3.21 |
| 5012 | 1 | 3.21 |
| 5013 | 1 | 3.21 |
| 5014 | 1 | 3.21 |
| 5015 | 1 | 3.21 |
| 5016 | 1 | 3.21 |
| 5017 | 1 | 3.21 |
| 5018 | 1 | 3.21 |
| 5019 | 1 | 3.21 |
| 5020 | 1 | 3.21 |
| 5021 | 1 | 3.21 |
| 5022 | 1 | 3.21 |
| 5023 | 1 | 3.21 |
| 5024 | 1 | 3.21 |
| 5025 | 1 | 3.21 |
| 5026 | 1 | 3.21 |
| 5027 | 1 | 3.21 |
| 5028 | 1 | 3.21 |
| 5029 | 1 | 3.21 |
| 5030 | 1 | 3.21 |
| 5031 | 1 | 3.21 |
| 5032 | 1 | 3.21 |
| 5033 | 1 | 3.21 |
| 5034 | 1 | 3.21 |
| 5035 | 1 | 3.21 |
| 5036 | 1 | 3.21 |
| 5037 | 1 | 3.21 |
| 5038 | 1 | 3.21 |
| 5039 | 1 | 3.21 |
| 5040 | 1 | 3.21 |
| 5041 | 1 | 3.21 |
| 5042 | 1 | 3.21 |
| 5043 | 1 | 3.21 |
| 5044 | 1 | 3.21 |
| 5045 | 1 | 3.21 |
| 5046 | 1 | 3.21 |
| 5047 | 1 | 3.21 |
| 5048 | 1 | 3.21 |
| 5049 | 1 | 3.21 |
| 5050 | 1 | 3.21 |
| 5051 | 1 | 3.21 |
| 5052 | 1 | 3.21 |
| 5053 | 1 | 3.21 |
| 5054 | 1 | 3.21 |
| 5055 | 1 | 3.21 |
| 5056 | 1 | 3.21 |
| 5057 | 1 | 3.21 |
| 5058 | 1 | 3.21 |
| 5059 | 1 | 3.21 |
| 5060 | 1 | 3.21 |
| 5061 | 1 | 3.21 |
| 5062 | 1 | 3.21 |
| 5063 | 1 | 3.21 |
| 5064 | 1 | 3.21 |
| 5065 | 1 | 3.21 |
| 5066 | 1 | 3.21 |
| 5067 | 1 | 3.21 |
| 5068 | 1 | 3.21 |
| 5069 | 1 | 3.21 |
| 5070 | 1 | 3.21 |
| 5071 | 1 | 3.21 |
| 5072 | 1 | 3.21 |
| 5073 | 1 | 3.21 |
| 5074 | 1 | 3.21 |
| 5075 | 1 | 3.21 |
| 5076 | 1 | 3.21 |
| 5077 | 1 | 3.21 |
| 5078 | 1 | 3.21 |
| 5079 | 1 | 3.21 |
| 5080 | 1 | 3.21 |
| 5081 | 1 | 3.21 |
| 5082 | 1 | 3.21 |
| 5083 | 1 | 3.21 |
| 5084 | 1 | 3.21 |
| 5085 | 1 | 3.21 |
| 5086 | 1 | 3.21 |
| 5087 | 1 | 3.21 |
| 5088 | 1 | 3.21 |
| 5089 | 1 | 3.21 |
| 5090 | 1 | 3.21 |
| 5091 | 1 | 3.21 |
| 5092 | 1 | 3.21 |
| 5093 | 1 | 3.21 |
| 5094 | 1 | 3.21 |
| 5095 | 1 | 3.21 |
| 5096 | 1 | 3.21 |
| 5097 | 1 | 3.21 |
| 5098 | 1 | 3.21 |
| 5099 | 1 | 3.21 |
| 5100 | 1 | 3.21 |
| 5101 | 1 | 3.21 |
| 5102 | 1 | 3.21 |
| 5103 | 1 | 3.21 |
| 5104 | 1 | 3.21 |
| 5105 | 1 | 3.21 |
| 5106 | 1 | 3.21 |
| 5107 | 1 | 3.21 |
| 5108 | 1 | 3.21 |
| 5109 | 1 | 3.21 |
| 5110 | 1 | 3.21 |
| 5111 | 1 | 3.21 |
| 5112 | 1 | 3.21 |
| 5113 | 1 | 3.21 |
| 5114 | 1 | 3.21 |
| 5115 | 1 | 3.21 |
| 5116 | 1 | 3.21 |
| 5117 | 1 | 3.21 |
| 5118 | 1 | 3.21 |
| 5119 | 1 | 3.21 |
| 5120 | 1 | 3.21 |
| 5121 | 1 | 3.21 |
| 5122 | 1 | 3.21 |
| 5123 | 1 | 3.21 |
| 5124 | 1 | 3.21 |
| 5125 | 1 | 3.21 |
| 5126 | 1 | 3.21 |
| 5127 | 1 | 3.21 |
| 5128 | 1 | 3.21 |
| 5129 | 1 | 3.21 |
| 5130 | 1 | 3.21 |
| 5131 | 1 | 3.21 |
| 5132 | 1 | 3.21 |
| 5133 | 1 | 3.21 |
| 5134 | 1 | 3.21 |
| 5135 | 1 | 3.21 |
| 5136 | 1 | 3.21 |
| 5137 | 1 | 3.21 |
| 5138 | 1 | 3.21 |
| 5139 | 1 | 3.21 |
| 5140 | 1 | 3.21 |
| 5141 | 1 | 3.21 |
| 5142 | 1 | 3.21 |
| 5143 | 1 | 3.21 |
| 5144 | 1 | 3.21 |
| 5145 | 1 | 3.21 |
| 5146 | 1 | 3.21 |
| 5147 | 1 | 3.21 |
| 5148 | 1 | 3.21 |
| 5149 | 1 | 3.21 |
| 5150 | 1 | 3.21 |
| 5151 | 1 | 3.21 |
| 5152 | 1 | 3.21 |
| 5153 | 1 | 3.21 |
| 5154 | 1 | 3.21 |
| 5155 | 1 | 3.21 |
| 5156 | 1 | 3.21 |
| 5157 | 1 | 3.21 |
| 5158 | 1 | 3.21 |
| 5159 | 1 | 3.21 |
| 5160 | 1 | 3.21 |
| 5161 | 1 | 3.21 |
| 5162 | 1 | 3.21 |
| 5163 | 1 | 3.21 |
| 5164 | 1 | 3.21 |
| 5165 | 1 | 3.21 |
| 5166 | 1 | 3.21 |
| 5167 | 1 | 3.21 |
| 5168 | 1 | 3.21 |
| 5169 | 1 | 3.21 |
| 5170 | 1 | 3.21 |
| 5171 | 1 | 3.21 |
| 5172 | 1 | 3.21 |
| 5173 | 1 | 3.21 |
| 5174 | 1 | 3.21 |
| 5175 | 1 | 3.21 |
| 5176 | 1 | 3.21 |
| 5177 | 1 | 3.21 |
| 5178 | 1 | 3.21 |
| 5179 | 1 | 3.21 |
| 5180 | 1 | 3.21 |
| 5181 | 1 | 3.21 |
| 5182 | 1 | 3.21 |
| 5183 | 1 | 3.21 |
| 5184 | 1 | 3.21 |
| 5185 | 1 | 3.21 |
| 5186 | 1 | 3.21 |
| 5187 | 1 | 3.21 |
| 5188 | 1 | 3.21 |
| 5189 | 1 | 3.21 |
| 5190 | 1 | 3.21 |
| 5191 | 1 | 3.21 |
| 5192 | 1 | 3.21 |
| 5193 | 1 | 3.21 |
| 5194 | 1 | 3.21 |
| 5195 | 1 | 3.21 |
| 5196 | 1 | 3.21 |
| 5197 | 1 | 3.21 |
| 5198 | 1 | 3.21 |
| 5199 | 1 | 3.21 |
| 5200 | 1 | 3.21 |
| 5201 | 1 | 3.21 |
| 5202 | 1 | 3.21 |
| 5203 | 1 | 3.21 |
| 5204 | 1 | 3.21 |
| 5205 | 1 | 3.21 |
| 5206 | 1 | 3.21 |
| 5207 | 1 | 3.21 |
| 5208 | 1 | 3.21 |
| 5209 | 1 | 3.21 |
| 5210 | 1 | 3.21 |
| 5211 | 1 | 3.21 |
| 5212 | 1 | 3.21 |
| 5213 | 1 | 3.21 |
| 5214 | 1 | 3.21 |
| 5215 | 1 | 3.21 |
| 5216 | 1 | 3.21 |
| 5217 | 1 | 3.21 |
| 5218 | 1 | 3.21 |
| 5219 | 1 | 3.21 |
| 5220 | 1 | 3.21 |
| 5221 | 1 | 3.21 |
| 5222 | 1 | 3.21 |
| 5223 | 1 | 3.21 |
| 5224 | 1 | 3.21 |
| 5225 | 1 | 3.21 |
| 5226 | 1 | 3.21 |
| 5227 | 1 | 3.21 |
| 5228 | 1 | 3.21 |
| 5229 | 1 | 3.21 |
| 5230 | 1 | 3.21 |
| 5231 | 1 | 3.21 |
| 5232 | 1 | 3.21 |
| 5233 | 1 | 3.21 |
| 5234 | 1 | 3.21 |
| 5235 | 1 | 3.21 |
| 5236 | 1 | 3.21 |
| 5237 | 1 | 3.21 |
| 5238 | 1 | 3.21 |
| 5239 | 1 | 3.21 |
| 5240 | 1 | 3.21 |
| 5241 | 1 | 3.21 |
| 5242 | 1 | 3.21 |
| 5243 | 1 | 3.21 |
| 5244 | 1 | 3.21 |
| 5245 | 1 | 3.21 |
| 5246 | 1 | 3.21 |
| 5247 | 1 | 3.21 |
| 5248 | 1 | 3.21 |
| 5249 | 1 | 3.21 |
| 5250 | 1 | 3.21 |
| 5251 | 1 | 3.21 |
| 5252 | 1 | 3.21 |
| 5253 | 1 | 3.21 |
| 5254 | 1 | 3.21 |
| 5255 | 1 | 3.21 |
| 5256 | 1 | 3.21 |
| 5257 | 1 | 3.2 |
| 5258 | 1 | 3.21 |
| 5259 | 1 | 3.21 |
| 5260 | 1 | 3.21 |
| 5261 | 1 | 3.21 |
| 5262 | 1 | 3.21 |
| 5263 | 1 | 3.21 |
| 5264 | 1 | 3.21 |
| 5265 | 1 | 3.21 |
| 5266 | 1 | 3.21 |
| 5267 | 1 | 3.2 |
| 5268 | 1 | 3.21 |
| 5269 | 1 | 3.21 |
| 5270 | 1 | 3.21 |
| 5271 | 1 | 3.21 |
| 5272 | 1 | 3.21 |
| 5273 | 1 | 3.21 |
| 5274 | 1 | 3.2 |
| 5275 | 1 | 3.21 |
| 5276 | 1 | 3.21 |
| 5277 | 1 | 3.21 |
| 5278 | 1 | 3.21 |
| 5279 | 1 | 3.21 |
| 5280 | 1 | 3.21 |
| 5281 | 1 | 3.21 |
| 5282 | 1 | 3.2 |
| 5283 | 1 | 3.21 |
| 5284 | 1 | 3.21 |
| 5285 | 1 | 3.21 |
| 5286 | 1 | 3.21 |
| 5287 | 1 | 3.21 |
| 5288 | 1 | 3.2 |
| 5289 | 1 | 3.21 |
| 5290 | 1 | 3.21 |
| 5291 | 1 | 3.21 |
| 5292 | 1 | 3.2 |
| 5293 | 1 | 3.2 |
| 5294 | 1 | 3.2 |
| 5295 | 1 | 3.2 |
| 5296 | 1 | 3.21 |
| 5297 | 1 | 3.2 |
| 5298 | 1 | 3.21 |
| 5299 | 1 | 3.21 |
| 5300 | 1 | 3.2 |
| 5301 | 1 | 3.2 |
| 5302 | 1 | 3.2 |
| 5303 | 1 | 3.2 |
| 5304 | 1 | 3.2 |
| 5305 | 1 | 3.21 |
| 5306 | 1 | 3.2 |
| 5307 | 1 | 3.21 |
| 5308 | 1 | 3.21 |
| 5309 | 1 | 3.2 |
| 5310 | 1 | 3.2 |
| 5311 | 1 | 3.21 |
| 5312 | 1 | 3.2 |
| 5313 | 1 | 3.21 |
| 5314 | 1 | 3.2 |
| 5315 | 1 | 3.2 |
| 5316 | 1 | 3.2 |
| 5317 | 1 | 3.2 |
| 5318 | 1 | 3.21 |
| 5319 | 1 | 3.2 |
| 5320 | 1 | 3.2 |
| 5321 | 1 | 3.2 |
| 5322 | 1 | 3.2 |
| 5323 | 1 | 3.2 |
| 5324 | 1 | 3.2 |
| 5325 | 1 | 3.2 |
| 5326 | 1 | 3.2 |
| 5327 | 1 | 3.2 |
| 5328 | 1 | 3.2 |
| 5329 | 1 | 3.2 |
| 5330 | 1 | 3.2 |
| 5331 | 1 | 3.2 |
| 5332 | 1 | 3.2 |
| 5333 | 1 | 3.2 |
| 5334 | 1 | 3.2 |
| 5335 | 1 | 3.2 |
| 5336 | 1 | 3.2 |
| 5337 | 1 | 3.2 |
| 5338 | 1 | 3.2 |
| 5339 | 1 | 3.2 |
| 5340 | 1 | 3.2 |
| 5341 | 1 | 3.2 |
| 5342 | 1 | 3.2 |
| 5343 | 1 | 3.2 |
| 5344 | 1 | 3.2 |
| 5345 | 1 | 3.2 |
| 5346 | 1 | 3.2 |
| 5347 | 1 | 3.2 |
| 5348 | 1 | 3.2 |
| 5349 | 1 | 3.2 |
| 5350 | 1 | 3.2 |
| 5351 | 1 | 3.2 |
| 5352 | 1 | 3.2 |
| 5353 | 1 | 3.2 |
| 5354 | 1 | 3.2 |
| 5355 | 1 | 3.2 |
| 5356 | 1 | 3.2 |
| 5357 | 1 | 3.2 |
| 5358 | 1 | 3.2 |
| 5359 | 1 | 3.2 |
| 5360 | 1 | 3.2 |
| 5361 | 1 | 3.2 |
| 5362 | 1 | 3.2 |
| 5363 | 1 | 3.2 |
| 5364 | 1 | 3.2 |
| 5365 | 1 | 3.2 |
| 5366 | 1 | 3.2 |
| 5367 | 1 | 3.2 |
| 5368 | 1 | 3.2 |
| 5369 | 1 | 3.2 |
| 5370 | 1 | 3.2 |
| 5371 | 1 | 3.2 |
| 5372 | 1 | 3.2 |
| 5373 | 1 | 3.2 |
| 5374 | 1 | 3.2 |
| 5375 | 1 | 3.2 |
| 5376 | 1 | 3.2 |
| 5377 | 1 | 3.2 |
| 5378 | 1 | 3.2 |
| 5379 | 1 | 3.2 |
| 5380 | 1 | 3.2 |
| 5381 | 1 | 3.2 |
| 5382 | 1 | 3.2 |
| 5383 | 1 | 3.2 |
| 5384 | 1 | 3.2 |
| 5385 | 1 | 3.2 |
| 5386 | 1 | 3.2 |
| 5387 | 1 | 3.2 |
| 5388 | 1 | 3.2 |
| 5389 | 1 | 3.2 |
| 5390 | 1 | 3.2 |
| 5391 | 1 | 3.2 |
| 5392 | 1 | 3.2 |
| 5393 | 1 | 3.2 |
| 5394 | 1 | 3.2 |
| 5395 | 1 | 3.2 |
| 5396 | 1 | 3.2 |
| 5397 | 1 | 3.2 |
| 5398 | 1 | 3.2 |
| 5399 | 1 | 3.2 |
| 5400 | 1 | 3.2 |
| 5401 | 1 | 3.2 |
| 5402 | 1 | 3.2 |
| 5403 | 1 | 3.2 |
| 5404 | 1 | 3.2 |
| 5405 | 1 | 3.2 |
| 5406 | 1 | 3.2 |
| 5407 | 1 | 3.2 |
| 5408 | 1 | 3.2 |
| 5409 | 1 | 3.2 |
| 5410 | 1 | 3.2 |
| 5411 | 1 | 3.2 |
| 5412 | 1 | 3.2 |
| 5413 | 1 | 3.2 |
| 5414 | 1 | 3.2 |
| 5415 | 1 | 3.2 |
| 5416 | 1 | 3.2 |
| 5417 | 1 | 3.2 |
| 5418 | 1 | 3.2 |
| 5419 | 1 | 3.2 |
| 5420 | 1 | 3.2 |
| 5421 | 1 | 3.2 |
| 5422 | 1 | 3.2 |
| 5423 | 1 | 3.2 |
| 5424 | 1 | 3.2 |
| 5425 | 1 | 3.2 |
| 5426 | 1 | 3.2 |
| 5427 | 1 | 3.2 |
| 5428 | 1 | 3.2 |
| 5429 | 1 | 3.2 |
| 5430 | 1 | 3.2 |
| 5431 | 1 | 3.2 |
| 5432 | 1 | 3.2 |
| 5433 | 1 | 3.2 |
| 5434 | 1 | 3.2 |
| 5435 | 1 | 3.2 |
| 5436 | 1 | 3.2 |
| 5437 | 1 | 3.2 |
| 5438 | 1 | 3.2 |
| 5439 | 1 | 3.2 |
| 5440 | 1 | 3.2 |
| 5441 | 1 | 3.2 |
| 5442 | 1 | 3.2 |
| 5443 | 1 | 3.2 |
| 5444 | 1 | 3.2 |
| 5445 | 1 | 3.2 |
| 5446 | 1 | 3.2 |
| 5447 | 1 | 3.2 |
| 5448 | 1 | 3.2 |
| 5449 | 1 | 3.2 |
| 5450 | 1 | 3.2 |
| 5451 | 1 | 3.2 |
| 5452 | 1 | 3.2 |
| 5453 | 1 | 3.2 |
| 5454 | 1 | 3.2 |
| 5455 | 1 | 3.2 |
| 5456 | 1 | 3.2 |
| 5457 | 1 | 3.2 |
| 5458 | 1 | 3.2 |
| 5459 | 1 | 3.2 |
| 5460 | 1 | 3.2 |
| 5461 | 1 | 3.2 |
| 5462 | 1 | 3.2 |
| 5463 | 1 | 3.2 |
| 5464 | 1 | 3.2 |
| 5465 | 1 | 3.2 |
| 5466 | 1 | 3.2 |
| 5467 | 1 | 3.2 |
| 5468 | 1 | 3.2 |
| 5469 | 1 | 3.2 |
| 5470 | 1 | 3.2 |
| 5471 | 1 | 3.2 |
| 5472 | 1 | 3.2 |
| 5473 | 1 | 3.2 |
| 5474 | 1 | 3.2 |
| 5475 | 1 | 3.2 |
| 5476 | 1 | 3.2 |
| 5477 | 1 | 3.2 |
| 5478 | 1 | 3.2 |
| 5479 | 1 | 3.2 |
| 5480 | 1 | 3.2 |
| 5481 | 1 | 3.2 |
| 5482 | 1 | 3.2 |
| 5483 | 1 | 3.2 |
| 5484 | 1 | 3.2 |
| 5485 | 1 | 3.2 |
| 5486 | 1 | 3.2 |
| 5487 | 1 | 3.2 |
| 5488 | 1 | 3.2 |
| 5489 | 1 | 3.2 |
| 5490 | 1 | 3.2 |
| 5491 | 1 | 3.2 |
| 5492 | 1 | 3.2 |
| 5493 | 1 | 3.2 |
| 5494 | 1 | 3.2 |
| 5495 | 1 | 3.2 |
| 5496 | 1 | 3.2 |
| 5497 | 1 | 3.2 |
| 5498 | 1 | 3.2 |
| 5499 | 1 | 3.2 |
| 5500 | 1 | 3.2 |
| 5501 | 1 | 3.2 |
| 5502 | 1 | 3.2 |
| 5503 | 1 | 3.2 |
| 5504 | 1 | 3.2 |
| 5505 | 1 | 3.2 |
| 5506 | 1 | 3.2 |
| 5507 | 1 | 3.2 |
| 5508 | 1 | 3.2 |
| 5509 | 1 | 3.2 |
| 5510 | 1 | 3.2 |
| 5511 | 1 | 3.2 |
| 5512 | 1 | 3.2 |
| 5513 | 1 | 3.2 |
| 5514 | 1 | 3.2 |
| 5515 | 1 | 3.2 |
| 5516 | 1 | 3.2 |
| 5517 | 1 | 3.2 |
| 5518 | 1 | 3.2 |
| 5519 | 1 | 3.2 |
| 5520 | 1 | 3.2 |
| 5521 | 1 | 3.2 |
| 5522 | 1 | 3.2 |
| 5523 | 1 | 3.2 |
| 5524 | 1 | 3.2 |
| 5525 | 1 | 3.2 |
| 5526 | 1 | 3.2 |
| 5527 | 1 | 3.2 |
| 5528 | 1 | 3.2 |
| 5529 | 1 | 3.2 |
| 5530 | 1 | 3.2 |
| 5531 | 1 | 3.2 |
| 5532 | 1 | 3.2 |
| 5533 | 1 | 3.2 |
| 5534 | 1 | 3.2 |
| 5535 | 1 | 3.2 |
| 5536 | 1 | 3.2 |
| 5537 | 1 | 3.2 |
| 5538 | 1 | 3.2 |
| 5539 | 1 | 3.2 |
| 5540 | 1 | 3.2 |
| 5541 | 1 | 3.2 |
| 5542 | 1 | 3.2 |
| 5543 | 1 | 3.2 |
| 5544 | 1 | 3.2 |
| 5545 | 1 | 3.2 |
| 5546 | 1 | 3.2 |
| 5547 | 1 | 3.2 |
| 5548 | 1 | 3.2 |
| 5549 | 1 | 3.2 |
| 5550 | 1 | 3.2 |
| 5551 | 1 | 3.2 |
| 5552 | 1 | 3.2 |
| 5553 | 1 | 3.2 |
| 5554 | 1 | 3.2 |
| 5555 | 1 | 3.2 |
| 5556 | 1 | 3.2 |
| 5557 | 1 | 3.2 |
| 5558 | 1 | 3.2 |
| 5559 | 1 | 3.2 |
| 5560 | 1 | 3.2 |
| 5561 | 1 | 3.2 |
| 5562 | 1 | 3.2 |
| 5563 | 1 | 3.2 |
| 5564 | 1 | 3.2 |
| 5565 | 1 | 3.2 |
| 5566 | 1 | 3.2 |
| 5567 | 1 | 3.2 |
| 5568 | 1 | 3.2 |
| 5569 | 1 | 3.2 |
| 5570 | 1 | 3.2 |
| 5571 | 1 | 3.2 |
| 5572 | 1 | 3.2 |
| 5573 | 1 | 3.2 |
| 5574 | 1 | 3.2 |
| 5575 | 1 | 3.2 |
| 5576 | 1 | 3.2 |
| 5577 | 1 | 3.2 |
| 5578 | 1 | 3.2 |
| 5579 | 1 | 3.2 |
| 5580 | 1 | 3.2 |
| 5581 | 1 | 3.2 |
| 5582 | 1 | 3.2 |
| 5583 | 1 | 3.2 |
| 5584 | 1 | 3.2 |
| 5585 | 1 | 3.2 |
| 5586 | 1 | 3.2 |
| 5587 | 1 | 3.2 |
| 5588 | 1 | 3.2 |
| 5589 | 1 | 3.2 |
| 5590 | 1 | 3.2 |
| 5591 | 1 | 3.2 |
| 5592 | 1 | 3.2 |
| 5593 | 1 | 3.2 |
| 5594 | 1 | 3.2 |
| 5595 | 1 | 3.2 |
| 5596 | 1 | 3.2 |
| 5597 | 1 | 3.2 |
| 5598 | 1 | 3.2 |
| 5599 | 1 | 3.2 |
| 5600 | 1 | 3.2 |
| 5601 | 1 | 3.2 |
| 5602 | 1 | 3.2 |
| 5603 | 1 | 3.2 |
| 5604 | 1 | 3.2 |
| 5605 | 1 | 3.2 |
| 5606 | 1 | 3.2 |
| 5607 | 1 | 3.2 |
| 5608 | 1 | 3.2 |
| 5609 | 1 | 3.2 |
| 5610 | 1 | 3.2 |
| 5611 | 1 | 3.2 |
| 5612 | 1 | 3.2 |
| 5613 | 1 | 3.2 |
| 5614 | 1 | 3.2 |
| 5615 | 1 | 3.2 |
| 5616 | 1 | 3.2 |
| 5617 | 1 | 3.2 |
| 5618 | 1 | 3.2 |
| 5619 | 1 | 3.2 |
| 5620 | 1 | 3.2 |
| 5621 | 1 | 3.2 |
| 5622 | 1 | 3.2 |
| 5623 | 1 | 3.2 |
| 5624 | 1 | 3.2 |
| 5625 | 1 | 3.2 |
| 5626 | 1 | 3.2 |
| 5627 | 1 | 3.2 |
| 5628 | 1 | 3.2 |
| 5629 | 1 | 3.2 |
| 5630 | 1 | 3.2 |
| 5631 | 1 | 3.2 |
| 5632 | 1 | 3.2 |
| 5633 | 1 | 3.2 |
| 5634 | 1 | 3.2 |
| 5635 | 1 | 3.2 |
| 5636 | 1 | 3.2 |
| 5637 | 1 | 3.2 |
| 5638 | 1 | 3.2 |
| 5639 | 1 | 3.2 |
| 5640 | 1 | 3.2 |
| 5641 | 1 | 3.2 |
| 5642 | 1 | 3.2 |
| 5643 | 1 | 3.2 |
| 5644 | 1 | 3.2 |
| 5645 | 1 | 3.2 |
| 5646 | 1 | 3.2 |
| 5647 | 1 | 3.2 |
| 5648 | 1 | 3.2 |
| 5649 | 1 | 3.2 |
| 5650 | 1 | 3.2 |
| 5651 | 1 | 3.2 |
| 5652 | 1 | 3.2 |
| 5653 | 1 | 3.2 |
| 5654 | 1 | 3.2 |
| 5655 | 1 | 3.2 |
| 5656 | 1 | 3.2 |
| 5657 | 1 | 3.2 |
| 5658 | 1 | 3.2 |
| 5659 | 1 | 3.2 |
| 5660 | 1 | 3.2 |
| 5661 | 1 | 3.2 |
| 5662 | 1 | 3.2 |
| 5663 | 1 | 3.2 |
| 5664 | 1 | 3.2 |
| 5665 | 1 | 3.2 |
| 5666 | 1 | 3.2 |
| 5667 | 1 | 3.2 |
| 5668 | 1 | 3.2 |
| 5669 | 1 | 3.2 |
| 5670 | 1 | 3.2 |
| 5671 | 1 | 3.2 |
| 5672 | 1 | 3.2 |
| 5673 | 1 | 3.2 |
| 5674 | 1 | 3.2 |
| 5675 | 1 | 3.2 |
| 5676 | 1 | 3.2 |
| 5677 | 1 | 3.2 |
| 5678 | 1 | 3.2 |
| 5679 | 1 | 3.2 |
| 5680 | 1 | 3.2 |
| 5681 | 1 | 3.2 |
| 5682 | 1 | 3.2 |
| 5683 | 1 | 3.2 |
| 5684 | 1 | 3.2 |
| 5685 | 1 | 3.2 |
| 5686 | 1 | 3.2 |
| 5687 | 1 | 3.2 |
| 5688 | 1 | 3.2 |
| 5689 | 1 | 3.2 |
| 5690 | 1 | 3.2 |
| 5691 | 1 | 3.2 |
| 5692 | 1 | 3.2 |
| 5693 | 1 | 3.2 |
| 5694 | 1 | 3.2 |
| 5695 | 1 | 3.2 |
| 5696 | 1 | 3.2 |
| 5697 | 1 | 3.2 |
| 5698 | 1 | 3.2 |
| 5699 | 1 | 3.2 |
| 5700 | 1 | 3.2 |
| 5701 | 1 | 3.2 |
| 5702 | 1 | 3.2 |
| 5703 | 1 | 3.2 |
| 5704 | 1 | 3.2 |
| 5705 | 1 | 3.2 |
| 5706 | 1 | 3.2 |
| 5707 | 1 | 3.2 |
| 5708 | 1 | 3.2 |
| 5709 | 1 | 3.2 |
| 5710 | 1 | 3.2 |
| 5711 | 1 | 3.2 |
| 5712 | 1 | 3.2 |
| 5713 | 1 | 3.2 |
| 5714 | 1 | 3.2 |
| 5715 | 1 | 3.2 |
| 5716 | 1 | 3.2 |
| 5717 | 1 | 3.2 |
| 5718 | 1 | 3.2 |
| 5719 | 1 | 3.2 |
| 5720 | 1 | 3.2 |
| 5721 | 1 | 3.2 |
| 5722 | 1 | 3.2 |
| 5723 | 1 | 3.2 |
| 5724 | 1 | 3.2 |
| 5725 | 1 | 3.2 |
| 5726 | 1 | 3.2 |
| 5727 | 1 | 3.2 |
| 5728 | 1 | 3.2 |
| 5729 | 1 | 3.2 |
| 5730 | 1 | 3.2 |
| 5731 | 1 | 3.2 |
| 5732 | 1 | 3.2 |
| 5733 | 1 | 3.2 |
| 5734 | 1 | 3.2 |
| 5735 | 1 | 3.2 |
| 5736 | 1 | 3.2 |
| 5737 | 1 | 3.2 |
| 5738 | 1 | 3.2 |
| 5739 | 1 | 3.2 |
| 5740 | 1 | 3.2 |
| 5741 | 1 | 3.2 |
| 5742 | 1 | 3.2 |
| 5743 | 1 | 3.2 |
| 5744 | 1 | 3.2 |
| 5745 | 1 | 3.2 |
| 5746 | 1 | 3.2 |
| 5747 | 1 | 3.2 |
| 5748 | 1 | 3.2 |
| 5749 | 1 | 3.2 |
| 5750 | 1 | 3.2 |
| 5751 | 1 | 3.2 |
| 5752 | 1 | 3.2 |
| 5753 | 1 | 3.2 |
| 5754 | 1 | 3.2 |
| 5755 | 1 | 3.2 |
| 5756 | 1 | 3.2 |
| 5757 | 1 | 3.2 |
| 5758 | 1 | 3.2 |
| 5759 | 1 | 3.2 |
| 5760 | 1 | 3.2 |
| 5761 | 1 | 3.2 |
| 5762 | 1 | 3.2 |
| 5763 | 1 | 3.2 |
| 5764 | 1 | 3.2 |
| 5765 | 1 | 3.2 |
| 5766 | 1 | 3.2 |
| 5767 | 1 | 3.2 |
| 5768 | 1 | 3.2 |
| 5769 | 1 | 3.2 |
| 5770 | 1 | 3.2 |
| 5771 | 1 | 3.2 |
| 5772 | 1 | 3.2 |
| 5773 | 1 | 3.2 |
| 5774 | 1 | 3.2 |
| 5775 | 1 | 3.2 |
| 5776 | 1 | 3.2 |
| 5777 | 1 | 3.2 |
| 5778 | 1 | 3.2 |
| 5779 | 1 | 3.2 |
| 5780 | 1 | 3.2 |
| 5781 | 1 | 3.2 |
| 5782 | 1 | 3.2 |
| 5783 | 1 | 3.2 |
| 5784 | 1 | 3.2 |
| 5785 | 1 | 3.2 |
| 5786 | 1 | 3.2 |
| 5787 | 1 | 3.2 |
| 5788 | 1 | 3.2 |
| 5789 | 1 | 3.2 |
| 5790 | 1 | 3.2 |
| 5791 | 1 | 3.19 |
| 5792 | 1 | 3.2 |
| 5793 | 1 | 3.2 |
| 5794 | 1 | 3.19 |
| 5795 | 1 | 3.19 |
| 5796 | 1 | 3.19 |
| 5797 | 1 | 3.19 |
| 5798 | 1 | 3.2 |
| 5799 | 1 | 3.19 |
| 5800 | 1 | 3.19 |
| 5801 | 1 | 3.19 |
| 5802 | 1 | 3.19 |
| 5803 | 1 | 3.19 |
| 5804 | 1 | 3.19 |
| 5805 | 1 | 3.19 |
| 5806 | 1 | 3.19 |
| 5807 | 1 | 3.19 |
| 5808 | 1 | 3.19 |
| 5809 | 1 | 3.19 |
| 5810 | 1 | 3.19 |
| 5811 | 1 | 3.19 |
| 5812 | 1 | 3.19 |
| 5813 | 1 | 3.19 |
| 5814 | 1 | 3.19 |
| 5815 | 1 | 3.19 |
| 5816 | 1 | 3.19 |
| 5817 | 1 | 3.19 |
| 5818 | 1 | 3.19 |
| 5819 | 1 | 3.19 |
| 5820 | 1 | 3.19 |
| 5821 | 1 | 3.19 |
| 5822 | 1 | 3.19 |
| 5823 | 1 | 3.19 |
| 5824 | 1 | 3.19 |
| 5825 | 1 | 3.19 |
| 5826 | 1 | 3.19 |
| 5827 | 1 | 3.19 |
| 5828 | 1 | 3.19 |
| 5829 | 1 | 3.19 |
| 5830 | 1 | 3.19 |
| 5831 | 1 | 3.19 |
| 5832 | 1 | 3.19 |
| 5833 | 1 | 3.19 |
| 5834 | 1 | 3.19 |
| 5835 | 1 | 3.19 |
| 5836 | 1 | 3.19 |
| 5837 | 1 | 3.19 |
| 5838 | 1 | 3.19 |
| 5839 | 1 | 3.19 |
| 5840 | 1 | 3.19 |
| 5841 | 1 | 3.19 |
| 5842 | 1 | 3.19 |
| 5843 | 1 | 3.19 |
| 5844 | 1 | 3.19 |
| 5845 | 1 | 3.19 |
| 5846 | 1 | 3.19 |
| 5847 | 1 | 3.19 |
| 5848 | 1 | 3.19 |
| 5849 | 1 | 3.19 |
| 5850 | 1 | 3.19 |
| 5851 | 1 | 3.19 |
| 5852 | 1 | 3.19 |
| 5853 | 1 | 3.19 |
| 5854 | 1 | 3.19 |
| 5855 | 1 | 3.19 |
| 5856 | 1 | 3.19 |
| 5857 | 1 | 3.19 |
| 5858 | 1 | 3.19 |
| 5859 | 1 | 3.19 |
| 5860 | 1 | 3.19 |
| 5861 | 1 | 3.19 |
| 5862 | 1 | 3.19 |
| 5863 | 1 | 3.19 |
| 5864 | 1 | 3.19 |
| 5865 | 1 | 3.19 |
| 5866 | 1 | 3.19 |
| 5867 | 1 | 3.19 |
| 5868 | 1 | 3.19 |
| 5869 | 1 | 3.19 |
| 5870 | 1 | 3.19 |
| 5871 | 1 | 3.19 |
| 5872 | 1 | 3.19 |
| 5873 | 1 | 3.19 |
| 5874 | 1 | 3.19 |
| 5875 | 1 | 3.19 |
| 5876 | 1 | 3.19 |
| 5877 | 1 | 3.19 |
| 5878 | 1 | 3.19 |
| 5879 | 1 | 3.19 |
| 5880 | 1 | 3.19 |
| 5881 | 1 | 3.19 |
| 5882 | 1 | 3.19 |
| 5883 | 1 | 3.19 |
| 5884 | 1 | 3.19 |
| 5885 | 1 | 3.19 |
| 5886 | 1 | 3.19 |
| 5887 | 1 | 3.19 |
| 5888 | 1 | 3.19 |
| 5889 | 1 | 3.19 |
| 5890 | 1 | 3.19 |
| 5891 | 1 | 3.19 |
| 5892 | 1 | 3.19 |
| 5893 | 1 | 3.19 |
| 5894 | 1 | 3.19 |
| 5895 | 1 | 3.19 |
| 5896 | 1 | 3.19 |
| 5897 | 1 | 3.19 |
| 5898 | 1 | 3.19 |
| 5899 | 1 | 3.19 |
| 5900 | 1 | 3.19 |
| 5901 | 1 | 3.19 |
| 5902 | 1 | 3.19 |
| 5903 | 1 | 3.19 |
| 5904 | 1 | 3.19 |
| 5905 | 1 | 3.19 |
| 5906 | 1 | 3.19 |
| 5907 | 1 | 3.19 |
| 5908 | 1 | 3.19 |
| 5909 | 1 | 3.19 |
| 5910 | 1 | 3.19 |
| 5911 | 1 | 3.19 |
| 5912 | 1 | 3.19 |
| 5913 | 1 | 3.19 |
| 5914 | 1 | 3.19 |
| 5915 | 1 | 3.19 |
| 5916 | 1 | 3.19 |
| 5917 | 1 | 3.19 |
| 5918 | 1 | 3.19 |
| 5919 | 1 | 3.19 |
| 5920 | 1 | 3.19 |
| 5921 | 1 | 3.19 |
| 5922 | 1 | 3.19 |
| 5923 | 1 | 3.19 |
| 5924 | 1 | 3.19 |
| 5925 | 1 | 3.19 |
| 5926 | 1 | 3.19 |
| 5927 | 1 | 3.19 |
| 5928 | 1 | 3.19 |
| 5929 | 1 | 3.19 |
| 5930 | 1 | 3.19 |
| 5931 | 1 | 3.19 |
| 5932 | 1 | 3.19 |
| 5933 | 1 | 3.19 |
| 5934 | 1 | 3.19 |
| 5935 | 1 | 3.19 |
| 5936 | 1 | 3.19 |
| 5937 | 1 | 3.19 |
| 5938 | 1 | 3.19 |
| 5939 | 1 | 3.19 |
| 5940 | 1 | 3.19 |
| 5941 | 1 | 3.19 |
| 5942 | 1 | 3.19 |
| 5943 | 1 | 3.19 |
| 5944 | 1 | 3.19 |
| 5945 | 1 | 3.19 |
| 5946 | 1 | 3.19 |
| 5947 | 1 | 3.19 |
| 5948 | 1 | 3.19 |
| 5949 | 1 | 3.19 |
| 5950 | 1 | 3.19 |
| 5951 | 1 | 3.19 |
| 5952 | 1 | 3.19 |
| 5953 | 1 | 3.19 |
| 5954 | 1 | 3.19 |
| 5955 | 1 | 3.19 |
| 5956 | 1 | 3.19 |
| 5957 | 1 | 3.19 |
| 5958 | 1 | 3.19 |
| 5959 | 1 | 3.19 |
| 5960 | 1 | 3.19 |
| 5961 | 1 | 3.19 |
| 5962 | 1 | 3.19 |
| 5963 | 1 | 3.19 |
| 5964 | 1 | 3.19 |
| 5965 | 1 | 3.19 |
| 5966 | 1 | 3.19 |
| 5967 | 1 | 3.19 |
| 5968 | 1 | 3.19 |
| 5969 | 1 | 3.19 |
| 5970 | 1 | 3.19 |
| 5971 | 1 | 3.19 |
| 5972 | 1 | 3.19 |
| 5973 | 1 | 3.19 |
| 5974 | 1 | 3.19 |
| 5975 | 1 | 3.19 |
| 5976 | 1 | 3.19 |
| 5977 | 1 | 3.19 |
| 5978 | 1 | 3.19 |
| 5979 | 1 | 3.19 |
| 5980 | 1 | 3.19 |
| 5981 | 1 | 3.19 |
| 5982 | 1 | 3.19 |
| 5983 | 1 | 3.19 |
| 5984 | 1 | 3.19 |
| 5985 | 1 | 3.19 |
| 5986 | 1 | 3.19 |
| 5987 | 1 | 3.19 |
| 5988 | 1 | 3.19 |
| 5989 | 1 | 3.19 |
| 5990 | 1 | 3.19 |
| 5991 | 1 | 3.19 |
| 5992 | 1 | 3.19 |
| 5993 | 1 | 3.19 |
| 5994 | 1 | 3.19 |
| 5995 | 1 | 3.19 |
| 5996 | 1 | 3.19 |
| 5997 | 1 | 3.19 |
| 5998 | 1 | 3.19 |
| 5999 | 1 | 3.19 |
| 6000 | 1 | 3.19 |
| 6001 | 1 | 3.19 |
| 6002 | 1 | 3.19 |
| 6003 | 1 | 3.19 |
| 6004 | 1 | 3.19 |
| 6005 | 1 | 3.19 |
| 6006 | 1 | 3.19 |
| 6007 | 1 | 3.19 |
| 6008 | 1 | 3.19 |
| 6009 | 1 | 3.19 |
| 6010 | 1 | 3.19 |
| 6011 | 1 | 3.19 |
| 6012 | 1 | 3.19 |
| 6013 | 1 | 3.19 |
| 6014 | 1 | 3.19 |
| 6015 | 1 | 3.19 |
| 6016 | 1 | 3.19 |
| 6017 | 1 | 3.19 |
| 6018 | 1 | 3.19 |
| 6019 | 1 | 3.19 |
| 6020 | 1 | 3.19 |
| 6021 | 1 | 3.19 |
| 6022 | 1 | 3.19 |
| 6023 | 1 | 3.19 |
| 6024 | 1 | 3.19 |
| 6025 | 1 | 3.19 |
| 6026 | 1 | 3.19 |
| 6027 | 1 | 3.19 |
| 6028 | 1 | 3.19 |
| 6029 | 1 | 3.19 |
| 6030 | 1 | 3.19 |
| 6031 | 1 | 3.19 |
| 6032 | 1 | 3.19 |
| 6033 | 1 | 3.19 |
| 6034 | 1 | 3.19 |
| 6035 | 1 | 3.19 |
| 6036 | 1 | 3.19 |
| 6037 | 1 | 3.19 |
| 6038 | 1 | 3.19 |
| 6039 | 1 | 3.19 |
| 6040 | 1 | 3.19 |
| 6041 | 1 | 3.19 |
| 6042 | 1 | 3.19 |
| 6043 | 1 | 3.19 |
| 6044 | 1 | 3.19 |
| 6045 | 1 | 3.19 |
| 6046 | 1 | 3.19 |
| 6047 | 1 | 3.19 |
| 6048 | 1 | 3.19 |
| 6049 | 1 | 3.19 |
| 6050 | 1 | 3.19 |
| 6051 | 1 | 3.19 |
| 6052 | 1 | 3.19 |
| 6053 | 1 | 3.19 |
| 6054 | 1 | 3.19 |
| 6055 | 1 | 3.19 |
| 6056 | 1 | 3.19 |
| 6057 | 1 | 3.19 |
| 6058 | 1 | 3.19 |
| 6059 | 1 | 3.19 |
| 6060 | 1 | 3.19 |
| 6061 | 1 | 3.19 |
| 6062 | 1 | 3.19 |
| 6063 | 1 | 3.19 |
| 6064 | 1 | 3.19 |
| 6065 | 1 | 3.19 |
| 6066 | 1 | 3.19 |
| 6067 | 1 | 3.19 |
| 6068 | 1 | 3.19 |
| 6069 | 1 | 3.19 |
| 6070 | 1 | 3.19 |
| 6071 | 1 | 3.19 |
| 6072 | 1 | 3.19 |
| 6073 | 1 | 3.19 |
| 6074 | 1 | 3.19 |
| 6075 | 1 | 3.19 |
| 6076 | 1 | 3.19 |
| 6077 | 1 | 3.19 |
| 6078 | 1 | 3.19 |
| 6079 | 1 | 3.19 |
| 6080 | 1 | 3.19 |
| 6081 | 1 | 3.19 |
| 6082 | 1 | 3.19 |
| 6083 | 1 | 3.19 |
| 6084 | 1 | 3.19 |
| 6085 | 1 | 3.19 |
| 6086 | 1 | 3.19 |
| 6087 | 1 | 3.19 |
| 6088 | 1 | 3.19 |
| 6089 | 1 | 3.19 |
| 6090 | 1 | 3.19 |
| 6091 | 1 | 3.19 |
| 6092 | 1 | 3.19 |
| 6093 | 1 | 3.19 |
| 6094 | 1 | 3.19 |
| 6095 | 1 | 3.19 |
| 6096 | 1 | 3.18 |
| 6097 | 1 | 3.19 |
| 6098 | 1 | 3.19 |
| 6099 | 1 | 3.18 |
| 6100 | 1 | 3.19 |
| 6101 | 1 | 3.18 |
| 6102 | 1 | 3.19 |
| 6103 | 1 | 3.18 |
| 6104 | 1 | 3.18 |
| 6105 | 1 | 3.19 |
| 6106 | 1 | 3.18 |
| 6107 | 1 | 3.18 |
| 6108 | 1 | 3.18 |
| 6109 | 1 | 3.18 |
| 6110 | 1 | 3.18 |
| 6111 | 1 | 3.18 |
| 6112 | 1 | 3.18 |
| 6113 | 1 | 3.18 |
| 6114 | 1 | 3.18 |
| 6115 | 1 | 3.18 |
| 6116 | 1 | 3.18 |
| 6117 | 1 | 3.18 |
| 6118 | 1 | 3.18 |
| 6119 | 1 | 3.18 |
| 6120 | 1 | 3.18 |
| 6121 | 1 | 3.18 |
| 6122 | 1 | 3.18 |
| 6123 | 1 | 3.18 |
| 6124 | 1 | 3.18 |
| 6125 | 1 | 3.18 |
| 6126 | 1 | 3.18 |
| 6127 | 1 | 3.18 |
| 6128 | 1 | 3.18 |
| 6129 | 1 | 3.18 |
| 6130 | 1 | 3.18 |
| 6131 | 1 | 3.18 |
| 6132 | 1 | 3.18 |
| 6133 | 1 | 3.18 |
| 6134 | 1 | 3.18 |
| 6135 | 1 | 3.18 |
| 6136 | 1 | 3.18 |
| 6137 | 1 | 3.18 |
| 6138 | 1 | 3.18 |
| 6139 | 1 | 3.18 |
| 6140 | 1 | 3.18 |
| 6141 | 1 | 3.18 |
| 6142 | 1 | 3.18 |
| 6143 | 1 | 3.18 |
| 6144 | 1 | 3.18 |
| 6145 | 1 | 3.18 |
| 6146 | 1 | 3.18 |
| 6147 | 1 | 3.18 |
| 6148 | 1 | 3.18 |
| 6149 | 1 | 3.18 |
| 6150 | 1 | 3.18 |
| 6151 | 1 | 3.18 |
| 6152 | 1 | 3.18 |
| 6153 | 1 | 3.18 |
| 6154 | 1 | 3.18 |
| 6155 | 1 | 3.18 |
| 6156 | 1 | 3.18 |
| 6157 | 1 | 3.18 |
| 6158 | 1 | 3.18 |
| 6159 | 1 | 3.18 |
| 6160 | 1 | 3.18 |
| 6161 | 1 | 3.18 |
| 6162 | 1 | 3.18 |
| 6163 | 1 | 3.18 |
| 6164 | 1 | 3.18 |
| 6165 | 1 | 3.18 |
| 6166 | 1 | 3.18 |
| 6167 | 1 | 3.18 |
| 6168 | 1 | 3.18 |
| 6169 | 1 | 3.18 |
| 6170 | 1 | 3.18 |
| 6171 | 1 | 3.18 |
| 6172 | 1 | 3.18 |
| 6173 | 1 | 3.18 |
| 6174 | 1 | 3.18 |
| 6175 | 1 | 3.18 |
| 6176 | 1 | 3.18 |
| 6177 | 1 | 3.18 |
| 6178 | 1 | 3.18 |
| 6179 | 1 | 3.18 |
| 6180 | 1 | 3.18 |
| 6181 | 1 | 3.18 |
| 6182 | 1 | 3.18 |
| 6183 | 1 | 3.18 |
| 6184 | 1 | 3.18 |
| 6185 | 1 | 3.18 |
| 6186 | 1 | 3.18 |
| 6187 | 1 | 3.18 |
| 6188 | 1 | 3.18 |
| 6189 | 1 | 3.18 |
| 6190 | 1 | 3.18 |
| 6191 | 1 | 3.18 |
| 6192 | 1 | 3.18 |
| 6193 | 1 | 3.18 |
| 6194 | 1 | 3.18 |
| 6195 | 1 | 3.18 |
| 6196 | 1 | 3.18 |
| 6197 | 1 | 3.18 |
| 6198 | 1 | 3.18 |
| 6199 | 1 | 3.18 |
| 6200 | 1 | 3.18 |
| 6201 | 1 | 3.18 |
| 6202 | 1 | 3.18 |
| 6203 | 1 | 3.18 |
| 6204 | 1 | 3.18 |
| 6205 | 1 | 3.18 |
| 6206 | 1 | 3.18 |
| 6207 | 1 | 3.18 |
| 6208 | 1 | 3.18 |
| 6209 | 1 | 3.18 |
| 6210 | 1 | 3.18 |
| 6211 | 1 | 3.18 |
| 6212 | 1 | 3.18 |
| 6213 | 1 | 3.18 |
| 6214 | 1 | 3.18 |
| 6215 | 1 | 3.18 |
| 6216 | 1 | 3.18 |
| 6217 | 1 | 3.18 |
| 6218 | 1 | 3.18 |
| 6219 | 1 | 3.18 |
| 6220 | 1 | 3.18 |
| 6221 | 1 | 3.18 |
| 6222 | 1 | 3.18 |
| 6223 | 1 | 3.18 |
| 6224 | 1 | 3.18 |
| 6225 | 1 | 3.18 |
| 6226 | 1 | 3.18 |
| 6227 | 1 | 3.18 |
| 6228 | 1 | 3.18 |
| 6229 | 1 | 3.18 |
| 6230 | 1 | 3.18 |
| 6231 | 1 | 3.18 |
| 6232 | 1 | 3.18 |
| 6233 | 1 | 3.18 |
| 6234 | 1 | 3.18 |
| 6235 | 1 | 3.18 |
| 6236 | 1 | 3.18 |
| 6237 | 1 | 3.18 |
| 6238 | 1 | 3.18 |
| 6239 | 1 | 3.18 |
| 6240 | 1 | 3.18 |
| 6241 | 1 | 3.18 |
| 6242 | 1 | 3.18 |
| 6243 | 1 | 3.18 |
| 6244 | 1 | 3.18 |
| 6245 | 1 | 3.18 |
| 6246 | 1 | 3.18 |
| 6247 | 1 | 3.18 |
| 6248 | 1 | 3.18 |
| 6249 | 1 | 3.18 |
| 6250 | 1 | 3.18 |
| 6251 | 1 | 3.18 |
| 6252 | 1 | 3.18 |
| 6253 | 1 | 3.18 |
| 6254 | 1 | 3.18 |
| 6255 | 1 | 3.18 |
| 6256 | 1 | 3.18 |
| 6257 | 1 | 3.18 |
| 6258 | 1 | 3.18 |
| 6259 | 1 | 3.18 |
| 6260 | 1 | 3.18 |
| 6261 | 1 | 3.18 |
| 6262 | 1 | 3.18 |
| 6263 | 1 | 3.18 |
| 6264 | 1 | 3.18 |
| 6265 | 1 | 3.18 |
| 6266 | 1 | 3.18 |
| 6267 | 1 | 3.18 |
| 6268 | 1 | 3.18 |
| 6269 | 1 | 3.18 |
| 6270 | 1 | 3.18 |
| 6271 | 1 | 3.18 |
| 6272 | 1 | 3.18 |
| 6273 | 1 | 3.18 |
| 6274 | 1 | 3.18 |
| 6275 | 1 | 3.18 |
| 6276 | 1 | 3.18 |
| 6277 | 1 | 3.18 |
| 6278 | 1 | 3.18 |
| 6279 | 1 | 3.18 |
| 6280 | 1 | 3.18 |
| 6281 | 1 | 3.18 |
| 6282 | 1 | 3.18 |
| 6283 | 1 | 3.18 |
| 6284 | 1 | 3.18 |
| 6285 | 1 | 3.18 |
| 6286 | 1 | 3.18 |
| 6287 | 1 | 3.18 |
| 6288 | 1 | 3.18 |
| 6289 | 1 | 3.18 |
| 6290 | 1 | 3.18 |
| 6291 | 1 | 3.18 |
| 6292 | 1 | 3.18 |
| 6293 | 1 | 3.18 |
| 6294 | 1 | 3.18 |
| 6295 | 1 | 3.18 |
| 6296 | 1 | 3.18 |
| 6297 | 1 | 3.18 |
| 6298 | 1 | 3.18 |
| 6299 | 1 | 3.18 |
| 6300 | 1 | 3.18 |
| 6301 | 1 | 3.18 |
| 6302 | 1 | 3.18 |
| 6303 | 1 | 3.18 |
| 6304 | 1 | 3.18 |
| 6305 | 1 | 3.18 |
| 6306 | 1 | 3.18 |
| 6307 | 1 | 3.18 |
| 6308 | 1 | 3.18 |
| 6309 | 1 | 3.18 |
| 6310 | 1 | 3.18 |
| 6311 | 1 | 3.18 |
| 6312 | 1 | 3.18 |
| 6313 | 1 | 3.18 |
| 6314 | 1 | 3.18 |
| 6315 | 1 | 3.18 |
| 6316 | 1 | 3.18 |
| 6317 | 1 | 3.18 |
| 6318 | 1 | 3.18 |
| 6319 | 1 | 3.18 |
| 6320 | 1 | 3.18 |
| 6321 | 1 | 3.18 |
| 6322 | 1 | 3.18 |
| 6323 | 1 | 3.18 |
| 6324 | 1 | 3.18 |
| 6325 | 1 | 3.18 |
| 6326 | 1 | 3.18 |
| 6327 | 1 | 3.18 |
| 6328 | 1 | 3.18 |
| 6329 | 1 | 3.18 |
| 6330 | 1 | 3.18 |
| 6331 | 1 | 3.18 |
| 6332 | 1 | 3.18 |
| 6333 | 1 | 3.18 |
| 6334 | 1 | 3.18 |
| 6335 | 1 | 3.18 |
| 6336 | 1 | 3.18 |
| 6337 | 1 | 3.18 |
| 6338 | 1 | 3.18 |
| 6339 | 1 | 3.18 |
| 6340 | 1 | 3.18 |
| 6341 | 1 | 3.18 |
| 6342 | 1 | 3.18 |
| 6343 | 1 | 3.18 |
| 6344 | 1 | 3.18 |
| 6345 | 1 | 3.18 |
| 6346 | 1 | 3.18 |
| 6347 | 1 | 3.18 |
| 6348 | 1 | 3.18 |
| 6349 | 1 | 3.18 |
| 6350 | 1 | 3.18 |
| 6351 | 1 | 3.18 |
| 6352 | 1 | 3.18 |
| 6353 | 1 | 3.18 |
| 6354 | 1 | 3.18 |
| 6355 | 1 | 3.17 |
| 6356 | 1 | 3.18 |
| 6357 | 1 | 3.18 |
| 6358 | 1 | 3.18 |
| 6359 | 1 | 3.18 |
| 6360 | 1 | 3.18 |
| 6361 | 1 | 3.17 |
| 6362 | 1 | 3.17 |
| 6363 | 1 | 3.17 |
| 6364 | 1 | 3.18 |
| 6365 | 1 | 3.17 |
| 6366 | 1 | 3.18 |
| 6367 | 1 | 3.17 |
| 6368 | 1 | 3.18 |
| 6369 | 1 | 3.17 |
| 6370 | 1 | 3.17 |
| 6371 | 1 | 3.17 |
| 6372 | 1 | 3.17 |
| 6373 | 1 | 3.17 |
| 6374 | 1 | 3.17 |
| 6375 | 1 | 3.17 |
| 6376 | 1 | 3.17 |
| 6377 | 1 | 3.17 |
| 6378 | 1 | 3.17 |
| 6379 | 1 | 3.17 |
| 6380 | 1 | 3.17 |
| 6381 | 1 | 3.17 |
| 6382 | 1 | 3.17 |
| 6383 | 1 | 3.17 |
| 6384 | 1 | 3.17 |
| 6385 | 1 | 3.17 |
| 6386 | 1 | 3.17 |
| 6387 | 1 | 3.17 |
| 6388 | 1 | 3.17 |
| 6389 | 1 | 3.17 |
| 6390 | 1 | 3.17 |
| 6391 | 1 | 3.17 |
| 6392 | 1 | 3.17 |
| 6393 | 1 | 3.17 |
| 6394 | 1 | 3.17 |
| 6395 | 1 | 3.17 |
| 6396 | 1 | 3.17 |
| 6397 | 1 | 3.17 |
| 6398 | 1 | 3.17 |
| 6399 | 1 | 3.17 |
| 6400 | 1 | 3.17 |
| 6401 | 1 | 3.17 |
| 6402 | 1 | 3.17 |
| 6403 | 1 | 3.17 |
| 6404 | 1 | 3.17 |
| 6405 | 1 | 3.17 |
| 6406 | 1 | 3.17 |
| 6407 | 1 | 3.17 |
| 6408 | 1 | 3.17 |
| 6409 | 1 | 3.17 |
| 6410 | 1 | 3.17 |
| 6411 | 1 | 3.17 |
| 6412 | 1 | 3.17 |
| 6413 | 1 | 3.17 |
| 6414 | 1 | 3.17 |
| 6415 | 1 | 3.17 |
| 6416 | 1 | 3.17 |
| 6417 | 1 | 3.17 |
| 6418 | 1 | 3.17 |
| 6419 | 1 | 3.17 |
| 6420 | 1 | 3.17 |
| 6421 | 1 | 3.17 |
| 6422 | 1 | 3.17 |
| 6423 | 1 | 3.17 |
| 6424 | 1 | 3.17 |
| 6425 | 1 | 3.17 |
| 6426 | 1 | 3.17 |
| 6427 | 1 | 3.17 |
| 6428 | 1 | 3.17 |
| 6429 | 1 | 3.17 |
| 6430 | 1 | 3.17 |
| 6431 | 1 | 3.17 |
| 6432 | 1 | 3.17 |
| 6433 | 1 | 3.17 |
| 6434 | 1 | 3.17 |
| 6435 | 1 | 3.17 |
| 6436 | 1 | 3.17 |
| 6437 | 1 | 3.17 |
| 6438 | 1 | 3.17 |
| 6439 | 1 | 3.17 |
| 6440 | 1 | 3.17 |
| 6441 | 1 | 3.17 |
| 6442 | 1 | 3.17 |
| 6443 | 1 | 3.17 |
| 6444 | 1 | 3.17 |
| 6445 | 1 | 3.17 |
| 6446 | 1 | 3.17 |
| 6447 | 1 | 3.17 |
| 6448 | 1 | 3.17 |
| 6449 | 1 | 3.17 |
| 6450 | 1 | 3.17 |
| 6451 | 1 | 3.17 |
| 6452 | 1 | 3.17 |
| 6453 | 1 | 3.17 |
| 6454 | 1 | 3.17 |
| 6455 | 1 | 3.17 |
| 6456 | 1 | 3.17 |
| 6457 | 1 | 3.17 |
| 6458 | 1 | 3.17 |
| 6459 | 1 | 3.17 |
| 6460 | 1 | 3.17 |
| 6461 | 1 | 3.17 |
| 6462 | 1 | 3.17 |
| 6463 | 1 | 3.17 |
| 6464 | 1 | 3.17 |
| 6465 | 1 | 3.17 |
| 6466 | 1 | 3.17 |
| 6467 | 1 | 3.17 |
| 6468 | 1 | 3.17 |
| 6469 | 1 | 3.17 |
| 6470 | 1 | 3.17 |
| 6471 | 1 | 3.17 |
| 6472 | 1 | 3.17 |
| 6473 | 1 | 3.17 |
| 6474 | 1 | 3.17 |
| 6475 | 1 | 3.17 |
| 6476 | 1 | 3.17 |
| 6477 | 1 | 3.17 |
| 6478 | 1 | 3.17 |
| 6479 | 1 | 3.17 |
| 6480 | 1 | 3.17 |
| 6481 | 1 | 3.17 |
| 6482 | 1 | 3.17 |
| 6483 | 1 | 3.17 |
| 6484 | 1 | 3.17 |
| 6485 | 1 | 3.17 |
| 6486 | 1 | 3.17 |
| 6487 | 1 | 3.17 |
| 6488 | 1 | 3.17 |
| 6489 | 1 | 3.17 |
| 6490 | 1 | 3.17 |
| 6491 | 1 | 3.17 |
| 6492 | 1 | 3.17 |
| 6493 | 1 | 3.17 |
| 6494 | 1 | 3.17 |
| 6495 | 1 | 3.17 |
| 6496 | 1 | 3.17 |
| 6497 | 1 | 3.17 |
| 6498 | 1 | 3.17 |
| 6499 | 1 | 3.17 |
| 6500 | 1 | 3.17 |
| 6501 | 1 | 3.17 |
| 6502 | 1 | 3.17 |
| 6503 | 1 | 3.17 |
| 6504 | 1 | 3.17 |
| 6505 | 1 | 3.17 |
| 6506 | 1 | 3.17 |
| 6507 | 1 | 3.17 |
| 6508 | 1 | 3.17 |
| 6509 | 1 | 3.17 |
| 6510 | 1 | 3.17 |
| 6511 | 1 | 3.17 |
| 6512 | 1 | 3.17 |
| 6513 | 1 | 3.17 |
| 6514 | 1 | 3.17 |
| 6515 | 1 | 3.17 |
| 6516 | 1 | 3.17 |
| 6517 | 1 | 3.17 |
| 6518 | 1 | 3.17 |
| 6519 | 1 | 3.17 |
| 6520 | 1 | 3.17 |
| 6521 | 1 | 3.17 |
| 6522 | 1 | 3.17 |
| 6523 | 1 | 3.17 |
| 6524 | 1 | 3.17 |
| 6525 | 1 | 3.17 |
| 6526 | 1 | 3.17 |
| 6527 | 1 | 3.17 |
| 6528 | 1 | 3.17 |
| 6529 | 1 | 3.17 |
| 6530 | 1 | 3.17 |
| 6531 | 1 | 3.17 |
| 6532 | 1 | 3.17 |
| 6533 | 1 | 3.17 |
| 6534 | 1 | 3.17 |
| 6535 | 1 | 3.17 |
| 6536 | 1 | 3.17 |
| 6537 | 1 | 3.17 |
| 6538 | 1 | 3.17 |
| 6539 | 1 | 3.17 |
| 6540 | 1 | 3.17 |
| 6541 | 1 | 3.17 |
| 6542 | 1 | 3.17 |
| 6543 | 1 | 3.17 |
| 6544 | 1 | 3.17 |
| 6545 | 1 | 3.17 |
| 6546 | 1 | 3.17 |
| 6547 | 1 | 3.17 |
| 6548 | 1 | 3.17 |
| 6549 | 1 | 3.17 |
| 6550 | 1 | 3.17 |
| 6551 | 1 | 3.17 |
| 6552 | 1 | 3.17 |
| 6553 | 1 | 3.17 |
| 6554 | 1 | 3.17 |
| 6555 | 1 | 3.17 |
| 6556 | 1 | 3.17 |
| 6557 | 1 | 3.17 |
| 6558 | 1 | 3.17 |
| 6559 | 1 | 3.17 |
| 6560 | 1 | 3.17 |
| 6561 | 1 | 3.17 |
| 6562 | 1 | 3.17 |
| 6563 | 1 | 3.17 |
| 6564 | 1 | 3.17 |
| 6565 | 1 | 3.17 |
| 6566 | 1 | 3.17 |
| 6567 | 1 | 3.17 |
| 6568 | 1 | 3.17 |
| 6569 | 1 | 3.17 |
| 6570 | 1 | 3.17 |
| 6571 | 1 | 3.17 |
| 6572 | 1 | 3.17 |
| 6573 | 1 | 3.17 |
| 6574 | 1 | 3.17 |
| 6575 | 1 | 3.17 |
| 6576 | 1 | 3.17 |
| 6577 | 1 | 3.17 |
| 6578 | 1 | 3.17 |
| 6579 | 1 | 3.17 |
| 6580 | 1 | 3.17 |
| 6581 | 1 | 3.17 |
| 6582 | 1 | 3.17 |
| 6583 | 1 | 3.17 |
| 6584 | 1 | 3.17 |
| 6585 | 1 | 3.17 |
| 6586 | 1 | 3.17 |
| 6587 | 1 | 3.17 |
| 6588 | 1 | 3.17 |
| 6589 | 1 | 3.17 |
| 6590 | 1 | 3.17 |
| 6591 | 1 | 3.17 |
| 6592 | 1 | 3.17 |
| 6593 | 1 | 3.17 |
| 6594 | 1 | 3.17 |
| 6595 | 1 | 3.17 |
| 6596 | 1 | 3.17 |
| 6597 | 1 | 3.17 |
| 6598 | 1 | 3.17 |
| 6599 | 1 | 3.17 |
| 6600 | 1 | 3.17 |
| 6601 | 1 | 3.17 |
| 6602 | 1 | 3.17 |
| 6603 | 1 | 3.17 |
| 6604 | 1 | 3.17 |
| 6605 | 1 | 3.17 |
| 6606 | 1 | 3.17 |
| 6607 | 1 | 3.17 |
| 6608 | 1 | 3.17 |
| 6609 | 1 | 3.17 |
| 6610 | 1 | 3.17 |
| 6611 | 1 | 3.17 |
| 6612 | 1 | 3.17 |
| 6613 | 1 | 3.17 |
| 6614 | 1 | 3.17 |
| 6615 | 1 | 3.17 |
| 6616 | 1 | 3.17 |
| 6617 | 1 | 3.17 |
| 6618 | 1 | 3.17 |
| 6619 | 1 | 3.17 |
| 6620 | 1 | 3.17 |
| 6621 | 1 | 3.17 |
| 6622 | 1 | 3.17 |
| 6623 | 1 | 3.17 |
| 6624 | 1 | 3.17 |
| 6625 | 1 | 3.17 |
| 6626 | 1 | 3.17 |
| 6627 | 1 | 3.17 |
| 6628 | 1 | 3.17 |
| 6629 | 1 | 3.17 |
| 6630 | 1 | 3.17 |
| 6631 | 1 | 3.17 |
| 6632 | 1 | 3.17 |
| 6633 | 1 | 3.17 |
| 6634 | 1 | 3.17 |
| 6635 | 1 | 3.17 |
| 6636 | 1 | 3.17 |
| 6637 | 1 | 3.17 |
| 6638 | 1 | 3.17 |
| 6639 | 1 | 3.17 |
| 6640 | 1 | 3.17 |
| 6641 | 1 | 3.17 |
| 6642 | 1 | 3.17 |
| 6643 | 1 | 3.17 |
| 6644 | 1 | 3.17 |
| 6645 | 1 | 3.17 |
| 6646 | 1 | 3.17 |
| 6647 | 1 | 3.17 |
| 6648 | 1 | 3.17 |
| 6649 | 1 | 3.17 |
| 6650 | 1 | 3.17 |
| 6651 | 1 | 3.17 |
| 6652 | 1 | 3.17 |
| 6653 | 1 | 3.17 |
| 6654 | 1 | 3.17 |
| 6655 | 1 | 3.17 |
| 6656 | 1 | 3.17 |
| 6657 | 1 | 3.17 |
| 6658 | 1 | 3.17 |
| 6659 | 1 | 3.17 |
| 6660 | 1 | 3.17 |
| 6661 | 1 | 3.17 |
| 6662 | 1 | 3.17 |
| 6663 | 1 | 3.17 |
| 6664 | 1 | 3.17 |
| 6665 | 1 | 3.17 |
| 6666 | 1 | 3.17 |
| 6667 | 1 | 3.17 |
| 6668 | 1 | 3.17 |
| 6669 | 1 | 3.17 |
| 6670 | 1 | 3.17 |
| 6671 | 1 | 3.17 |
| 6672 | 1 | 3.17 |
| 6673 | 1 | 3.17 |
| 6674 | 1 | 3.17 |
| 6675 | 1 | 3.17 |
| 6676 | 1 | 3.17 |
| 6677 | 1 | 3.17 |
| 6678 | 1 | 3.17 |
| 6679 | 1 | 3.17 |
| 6680 | 1 | 3.17 |
| 6681 | 1 | 3.17 |
| 6682 | 1 | 3.17 |
| 6683 | 1 | 3.17 |
| 6684 | 1 | 3.17 |
| 6685 | 1 | 3.17 |
| 6686 | 1 | 3.17 |
| 6687 | 1 | 3.17 |
| 6688 | 1 | 3.17 |
| 6689 | 1 | 3.17 |
| 6690 | 1 | 3.17 |
| 6691 | 1 | 3.17 |
| 6692 | 1 | 3.17 |
| 6693 | 1 | 3.17 |
| 6694 | 1 | 3.17 |
| 6695 | 1 | 3.17 |
| 6696 | 1 | 3.17 |
| 6697 | 1 | 3.17 |
| 6698 | 1 | 3.17 |
| 6699 | 1 | 3.17 |
| 6700 | 1 | 3.17 |
| 6701 | 1 | 3.17 |
| 6702 | 1 | 3.17 |
| 6703 | 1 | 3.17 |
| 6704 | 1 | 3.17 |
| 6705 | 1 | 3.17 |
| 6706 | 1 | 3.17 |
| 6707 | 1 | 3.17 |
| 6708 | 1 | 3.17 |
| 6709 | 1 | 3.17 |
| 6710 | 1 | 3.17 |
| 6711 | 1 | 3.17 |
| 6712 | 1 | 3.17 |
| 6713 | 1 | 3.17 |
| 6714 | 1 | 3.17 |
| 6715 | 1 | 3.17 |
| 6716 | 1 | 3.17 |
| 6717 | 1 | 3.17 |
| 6718 | 1 | 3.17 |
| 6719 | 1 | 3.17 |
| 6720 | 1 | 3.17 |
| 6721 | 1 | 3.17 |
| 6722 | 1 | 3.17 |
| 6723 | 1 | 3.17 |
| 6724 | 1 | 3.17 |
| 6725 | 1 | 3.17 |
| 6726 | 1 | 3.17 |
| 6727 | 1 | 3.17 |
| 6728 | 1 | 3.17 |
| 6729 | 1 | 3.17 |
| 6730 | 1 | 3.17 |
| 6731 | 1 | 3.17 |
| 6732 | 1 | 3.17 |
| 6733 | 1 | 3.17 |
| 6734 | 1 | 3.17 |
| 6735 | 1 | 3.17 |
| 6736 | 1 | 3.17 |
| 6737 | 1 | 3.17 |
| 6738 | 1 | 3.17 |
| 6739 | 1 | 3.17 |
| 6740 | 1 | 3.17 |
| 6741 | 1 | 3.17 |
| 6742 | 1 | 3.17 |
| 6743 | 1 | 3.17 |
| 6744 | 1 | 3.17 |
| 6745 | 1 | 3.17 |
| 6746 | 1 | 3.16 |
| 6747 | 1 | 3.17 |
| 6748 | 1 | 3.17 |
| 6749 | 1 | 3.16 |
| 6750 | 1 | 3.16 |
| 6751 | 1 | 3.17 |
| 6752 | 1 | 3.17 |
| 6753 | 1 | 3.16 |
| 6754 | 1 | 3.16 |
| 6755 | 1 | 3.16 |
| 6756 | 1 | 3.16 |
| 6757 | 1 | 3.16 |
| 6758 | 1 | 3.16 |
| 6759 | 1 | 3.16 |
| 6760 | 1 | 3.16 |
| 6761 | 1 | 3.16 |
| 6762 | 1 | 3.16 |
| 6763 | 1 | 3.16 |
| 6764 | 1 | 3.16 |
| 6765 | 1 | 3.16 |
| 6766 | 1 | 3.16 |
| 6767 | 1 | 3.16 |
| 6768 | 1 | 3.16 |
| 6769 | 1 | 3.16 |
| 6770 | 1 | 3.16 |
| 6771 | 1 | 3.16 |
| 6772 | 1 | 3.16 |
| 6773 | 1 | 3.16 |
| 6774 | 1 | 3.16 |
| 6775 | 1 | 3.16 |
| 6776 | 1 | 3.16 |
| 6777 | 1 | 3.16 |
| 6778 | 1 | 3.16 |
| 6779 | 1 | 3.16 |
| 6780 | 1 | 3.16 |
| 6781 | 1 | 3.16 |
| 6782 | 1 | 3.16 |
| 6783 | 1 | 3.16 |
| 6784 | 1 | 3.16 |
| 6785 | 1 | 3.16 |
| 6786 | 1 | 3.16 |
| 6787 | 1 | 3.16 |
| 6788 | 1 | 3.16 |
| 6789 | 1 | 3.16 |
| 6790 | 1 | 3.16 |
| 6791 | 1 | 3.16 |
| 6792 | 1 | 3.16 |
| 6793 | 1 | 3.16 |
| 6794 | 1 | 3.16 |
| 6795 | 1 | 3.16 |
| 6796 | 1 | 3.16 |
| 6797 | 1 | 3.16 |
| 6798 | 1 | 3.16 |
| 6799 | 1 | 3.16 |
| 6800 | 1 | 3.16 |
| 6801 | 1 | 3.16 |
| 6802 | 1 | 3.16 |
| 6803 | 1 | 3.16 |
| 6804 | 1 | 3.16 |
| 6805 | 1 | 3.16 |
| 6806 | 1 | 3.16 |
| 6807 | 1 | 3.16 |
| 6808 | 1 | 3.16 |
| 6809 | 1 | 3.16 |
| 6810 | 1 | 3.16 |
| 6811 | 1 | 3.16 |
| 6812 | 1 | 3.16 |
| 6813 | 1 | 3.16 |
| 6814 | 1 | 3.16 |
| 6815 | 1 | 3.16 |
| 6816 | 1 | 3.16 |
| 6817 | 1 | 3.16 |
| 6818 | 1 | 3.16 |
| 6819 | 1 | 3.16 |
| 6820 | 1 | 3.16 |
| 6821 | 1 | 3.16 |
| 6822 | 1 | 3.16 |
| 6823 | 1 | 3.16 |
| 6824 | 1 | 3.16 |
| 6825 | 1 | 3.16 |
| 6826 | 1 | 3.16 |
| 6827 | 1 | 3.16 |
| 6828 | 1 | 3.16 |
| 6829 | 1 | 3.16 |
| 6830 | 1 | 3.16 |
| 6831 | 1 | 3.16 |
| 6832 | 1 | 3.16 |
| 6833 | 1 | 3.16 |
| 6834 | 1 | 3.16 |
| 6835 | 1 | 3.16 |
| 6836 | 1 | 3.16 |
| 6837 | 1 | 3.16 |
| 6838 | 1 | 3.16 |
| 6839 | 1 | 3.16 |
| 6840 | 1 | 3.16 |
| 6841 | 1 | 3.16 |
| 6842 | 1 | 3.16 |
| 6843 | 1 | 3.16 |
| 6844 | 1 | 3.16 |
| 6845 | 1 | 3.16 |
| 6846 | 1 | 3.16 |
| 6847 | 1 | 3.16 |
| 6848 | 1 | 3.16 |
| 6849 | 1 | 3.16 |
| 6850 | 1 | 3.16 |
| 6851 | 1 | 3.16 |
| 6852 | 1 | 3.16 |
| 6853 | 1 | 3.16 |
| 6854 | 1 | 3.16 |
| 6855 | 1 | 3.16 |
| 6856 | 1 | 3.16 |
| 6857 | 1 | 3.16 |
| 6858 | 1 | 3.16 |
| 6859 | 1 | 3.16 |
| 6860 | 1 | 3.16 |
| 6861 | 1 | 3.16 |
| 6862 | 1 | 3.16 |
| 6863 | 1 | 3.16 |
| 6864 | 1 | 3.16 |
| 6865 | 1 | 3.16 |
| 6866 | 1 | 3.16 |
| 6867 | 1 | 3.16 |
| 6868 | 1 | 3.16 |
| 6869 | 1 | 3.16 |
| 6870 | 1 | 3.16 |
| 6871 | 1 | 3.16 |
| 6872 | 1 | 3.16 |
| 6873 | 1 | 3.16 |
| 6874 | 1 | 3.16 |
| 6875 | 1 | 3.16 |
| 6876 | 1 | 3.16 |
| 6877 | 1 | 3.16 |
| 6878 | 1 | 3.16 |
| 6879 | 1 | 3.16 |
| 6880 | 1 | 3.16 |
| 6881 | 1 | 3.16 |
| 6882 | 1 | 3.16 |
| 6883 | 1 | 3.16 |
| 6884 | 1 | 3.16 |
| 6885 | 1 | 3.16 |
| 6886 | 1 | 3.16 |
| 6887 | 1 | 3.16 |
| 6888 | 1 | 3.16 |
| 6889 | 1 | 3.16 |
| 6890 | 1 | 3.16 |
| 6891 | 1 | 3.16 |
| 6892 | 1 | 3.16 |
| 6893 | 1 | 3.16 |
| 6894 | 1 | 3.16 |
| 6895 | 1 | 3.16 |
| 6896 | 1 | 3.16 |
| 6897 | 1 | 3.16 |
| 6898 | 1 | 3.16 |
| 6899 | 1 | 3.16 |
| 6900 | 1 | 3.16 |
| 6901 | 1 | 3.16 |
| 6902 | 1 | 3.16 |
| 6903 | 1 | 3.16 |
| 6904 | 1 | 3.16 |
| 6905 | 1 | 3.16 |
| 6906 | 1 | 3.16 |
| 6907 | 1 | 3.16 |
| 6908 | 1 | 3.16 |
| 6909 | 1 | 3.16 |
| 6910 | 1 | 3.16 |
| 6911 | 1 | 3.16 |
| 6912 | 1 | 3.16 |
| 6913 | 1 | 3.16 |
| 6914 | 1 | 3.16 |
| 6915 | 1 | 3.16 |
| 6916 | 1 | 3.16 |
| 6917 | 1 | 3.16 |
| 6918 | 1 | 3.16 |
| 6919 | 1 | 3.16 |
| 6920 | 1 | 3.16 |
| 6921 | 1 | 3.16 |
| 6922 | 1 | 3.16 |
| 6923 | 1 | 3.16 |
| 6924 | 1 | 3.16 |
| 6925 | 1 | 3.16 |
| 6926 | 1 | 3.16 |
| 6927 | 1 | 3.16 |
| 6928 | 1 | 3.16 |
| 6929 | 1 | 3.16 |
| 6930 | 1 | 3.16 |
| 6931 | 1 | 3.16 |
| 6932 | 1 | 3.16 |
| 6933 | 1 | 3.16 |
| 6934 | 1 | 3.16 |
| 6935 | 1 | 3.16 |
| 6936 | 1 | 3.16 |
| 6937 | 1 | 3.16 |
| 6938 | 1 | 3.16 |
| 6939 | 1 | 3.16 |
| 6940 | 1 | 3.16 |
| 6941 | 1 | 3.16 |
| 6942 | 1 | 3.16 |
| 6943 | 1 | 3.16 |
| 6944 | 1 | 3.16 |
| 6945 | 1 | 3.16 |
| 6946 | 1 | 3.16 |
| 6947 | 1 | 3.16 |
| 6948 | 1 | 3.16 |
| 6949 | 1 | 3.16 |
| 6950 | 1 | 3.16 |
| 6951 | 1 | 3.16 |
| 6952 | 1 | 3.16 |
| 6953 | 1 | 3.16 |
| 6954 | 1 | 3.16 |
| 6955 | 1 | 3.16 |
| 6956 | 1 | 3.16 |
| 6957 | 1 | 3.16 |
| 6958 | 1 | 3.16 |
| 6959 | 1 | 3.16 |
| 6960 | 1 | 3.16 |
| 6961 | 1 | 3.16 |
| 6962 | 1 | 3.16 |
| 6963 | 1 | 3.16 |
| 6964 | 1 | 3.16 |
| 6965 | 1 | 3.16 |
| 6966 | 1 | 3.16 |
| 6967 | 1 | 3.16 |
| 6968 | 1 | 3.16 |
| 6969 | 1 | 3.16 |
| 6970 | 1 | 3.16 |
| 6971 | 1 | 3.16 |
| 6972 | 1 | 3.16 |
| 6973 | 1 | 3.16 |
| 6974 | 1 | 3.16 |
| 6975 | 1 | 3.16 |
| 6976 | 1 | 3.16 |
| 6977 | 1 | 3.16 |
| 6978 | 1 | 3.16 |
| 6979 | 1 | 3.16 |
| 6980 | 1 | 3.16 |
| 6981 | 1 | 3.16 |
| 6982 | 1 | 3.16 |
| 6983 | 1 | 3.16 |
| 6984 | 1 | 3.16 |
| 6985 | 1 | 3.16 |
| 6986 | 1 | 3.16 |
| 6987 | 1 | 3.16 |
| 6988 | 1 | 3.16 |
| 6989 | 1 | 3.16 |
| 6990 | 1 | 3.16 |
| 6991 | 1 | 3.16 |
| 6992 | 1 | 3.16 |
| 6993 | 1 | 3.16 |
| 6994 | 1 | 3.16 |
| 6995 | 1 | 3.16 |
| 6996 | 1 | 3.16 |
| 6997 | 1 | 3.16 |
| 6998 | 1 | 3.16 |
| 6999 | 1 | 3.16 |
| 7000 | 1 | 3.16 |
| 7001 | 1 | 3.16 |
| 7002 | 1 | 3.16 |
| 7003 | 1 | 3.16 |
| 7004 | 1 | 3.16 |
| 7005 | 1 | 3.16 |
| 7006 | 1 | 3.16 |
| 7007 | 1 | 3.16 |
| 7008 | 1 | 3.16 |
| 7009 | 1 | 3.16 |
| 7010 | 1 | 3.16 |
| 7011 | 1 | 3.16 |
| 7012 | 1 | 3.16 |
| 7013 | 1 | 3.16 |
| 7014 | 1 | 3.16 |
| 7015 | 1 | 3.16 |
| 7016 | 1 | 3.16 |
| 7017 | 1 | 3.16 |
| 7018 | 1 | 3.16 |
| 7019 | 1 | 3.16 |
| 7020 | 1 | 3.16 |
| 7021 | 1 | 3.16 |
| 7022 | 1 | 3.16 |
| 7023 | 1 | 3.16 |
| 7024 | 1 | 3.16 |
| 7025 | 1 | 3.16 |
| 7026 | 1 | 3.16 |
| 7027 | 1 | 3.16 |
| 7028 | 1 | 3.16 |
| 7029 | 1 | 3.16 |
| 7030 | 1 | 3.16 |
| 7031 | 1 | 3.16 |
| 7032 | 1 | 3.16 |
| 7033 | 1 | 3.16 |
| 7034 | 1 | 3.16 |
| 7035 | 1 | 3.15 |
| 7036 | 1 | 3.15 |
| 7037 | 1 | 3.15 |
| 7038 | 1 | 3.15 |
| 7039 | 1 | 3.15 |
| 7040 | 1 | 3.15 |
| 7041 | 1 | 3.15 |
| 7042 | 1 | 3.15 |
| 7043 | 1 | 3.15 |
| 7044 | 1 | 3.15 |
| 7045 | 1 | 3.15 |
| 7046 | 1 | 3.15 |
| 7047 | 1 | 3.15 |
| 7048 | 1 | 3.15 |
| 7049 | 1 | 3.15 |
| 7050 | 1 | 3.15 |
| 7051 | 1 | 3.15 |
| 7052 | 1 | 3.15 |
| 7053 | 1 | 3.15 |
| 7054 | 1 | 3.15 |
| 7055 | 1 | 3.15 |
| 7056 | 1 | 3.15 |
| 7057 | 1 | 3.15 |
| 7058 | 1 | 3.15 |
| 7059 | 1 | 3.15 |
| 7060 | 1 | 3.15 |
| 7061 | 1 | 3.15 |
| 7062 | 1 | 3.15 |
| 7063 | 1 | 3.15 |
| 7064 | 1 | 3.15 |
| 7065 | 1 | 3.15 |
| 7066 | 1 | 3.15 |
| 7067 | 1 | 3.15 |
| 7068 | 1 | 3.15 |
| 7069 | 1 | 3.15 |
| 7070 | 1 | 3.15 |
| 7071 | 1 | 3.15 |
| 7072 | 1 | 3.15 |
| 7073 | 1 | 3.15 |
| 7074 | 1 | 3.15 |
| 7075 | 1 | 3.15 |
| 7076 | 1 | 3.15 |
| 7077 | 1 | 3.15 |
| 7078 | 1 | 3.15 |
| 7079 | 1 | 3.15 |
| 7080 | 1 | 3.15 |
| 7081 | 1 | 3.15 |
| 7082 | 1 | 3.15 |
| 7083 | 1 | 3.15 |
| 7084 | 1 | 3.15 |
| 7085 | 1 | 3.15 |
| 7086 | 1 | 3.15 |
| 7087 | 1 | 3.15 |
| 7088 | 1 | 3.15 |
| 7089 | 1 | 3.15 |
| 7090 | 1 | 3.15 |
| 7091 | 1 | 3.15 |
| 7092 | 1 | 3.15 |
| 7093 | 1 | 3.15 |
| 7094 | 1 | 3.15 |
| 7095 | 1 | 3.15 |
| 7096 | 1 | 3.15 |
| 7097 | 1 | 3.15 |
| 7098 | 1 | 3.15 |
| 7099 | 1 | 3.15 |
| 7100 | 1 | 3.15 |
| 7101 | 1 | 3.15 |
| 7102 | 1 | 3.15 |
| 7103 | 1 | 3.15 |
| 7104 | 1 | 3.15 |
| 7105 | 1 | 3.15 |
| 7106 | 1 | 3.15 |
| 7107 | 1 | 3.15 |
| 7108 | 1 | 3.15 |
| 7109 | 1 | 3.15 |
| 7110 | 1 | 3.15 |
| 7111 | 1 | 3.15 |
| 7112 | 1 | 3.15 |
| 7113 | 1 | 3.15 |
| 7114 | 1 | 3.15 |
| 7115 | 1 | 3.15 |
| 7116 | 1 | 3.15 |
| 7117 | 1 | 3.15 |
| 7118 | 1 | 3.15 |
| 7119 | 1 | 3.15 |
| 7120 | 1 | 3.15 |
| 7121 | 1 | 3.15 |
| 7122 | 1 | 3.15 |
| 7123 | 1 | 3.15 |
| 7124 | 1 | 3.15 |
| 7125 | 1 | 3.15 |
| 7126 | 1 | 3.15 |
| 7127 | 1 | 3.15 |
| 7128 | 1 | 3.15 |
| 7129 | 1 | 3.15 |
| 7130 | 1 | 3.15 |
| 7131 | 1 | 3.15 |
| 7132 | 1 | 3.15 |
| 7133 | 1 | 3.15 |
| 7134 | 1 | 3.15 |
| 7135 | 1 | 3.15 |
| 7136 | 1 | 3.15 |
| 7137 | 1 | 3.15 |
| 7138 | 1 | 3.15 |
| 7139 | 1 | 3.15 |
| 7140 | 1 | 3.15 |
| 7141 | 1 | 3.15 |
| 7142 | 1 | 3.15 |
| 7143 | 1 | 3.15 |
| 7144 | 1 | 3.15 |
| 7145 | 1 | 3.15 |
| 7146 | 1 | 3.15 |
| 7147 | 1 | 3.15 |
| 7148 | 1 | 3.15 |
| 7149 | 1 | 3.15 |
| 7150 | 1 | 3.15 |
| 7151 | 1 | 3.15 |
| 7152 | 1 | 3.15 |
| 7153 | 1 | 3.15 |
| 7154 | 1 | 3.15 |
| 7155 | 1 | 3.15 |
| 7156 | 1 | 3.15 |
| 7157 | 1 | 3.15 |
| 7158 | 1 | 3.15 |
| 7159 | 1 | 3.15 |
| 7160 | 1 | 3.15 |
| 7161 | 1 | 3.15 |
| 7162 | 1 | 3.15 |
| 7163 | 1 | 3.15 |
| 7164 | 1 | 3.15 |
| 7165 | 1 | 3.15 |
| 7166 | 1 | 3.15 |
| 7167 | 1 | 3.15 |
| 7168 | 1 | 3.15 |
| 7169 | 1 | 3.15 |
| 7170 | 1 | 3.15 |
| 7171 | 1 | 3.15 |
| 7172 | 1 | 3.15 |
| 7173 | 1 | 3.15 |
| 7174 | 1 | 3.15 |
| 7175 | 1 | 3.15 |
| 7176 | 1 | 3.15 |
| 7177 | 1 | 3.15 |
| 7178 | 1 | 3.15 |
| 7179 | 1 | 3.15 |
| 7180 | 1 | 3.15 |
| 7181 | 1 | 3.15 |
| 7182 | 1 | 3.15 |
| 7183 | 1 | 3.15 |
| 7184 | 1 | 3.15 |
| 7185 | 1 | 3.15 |
| 7186 | 1 | 3.15 |
| 7187 | 1 | 3.15 |
| 7188 | 1 | 3.15 |
| 7189 | 1 | 3.15 |
| 7190 | 1 | 3.15 |
| 7191 | 1 | 3.15 |
| 7192 | 1 | 3.15 |
| 7193 | 1 | 3.15 |
| 7194 | 1 | 3.15 |
| 7195 | 1 | 3.15 |
| 7196 | 1 | 3.15 |
| 7197 | 1 | 3.15 |
| 7198 | 1 | 3.15 |
| 7199 | 1 | 3.15 |
| 7200 | 1 | 3.15 |
| 7201 | 1 | 3.15 |
| 7202 | 1 | 3.15 |
| 7203 | 1 | 3.15 |
| 7204 | 1 | 3.15 |
| 7205 | 1 | 3.15 |
| 7206 | 1 | 3.15 |
| 7207 | 1 | 3.15 |
| 7208 | 1 | 3.15 |
| 7209 | 1 | 3.15 |
| 7210 | 1 | 3.15 |
| 7211 | 1 | 3.15 |
| 7212 | 1 | 3.15 |
| 7213 | 1 | 3.15 |
| 7214 | 1 | 3.15 |
| 7215 | 1 | 3.15 |
| 7216 | 1 | 3.15 |
| 7217 | 1 | 3.15 |
| 7218 | 1 | 3.15 |
| 7219 | 1 | 3.15 |
| 7220 | 1 | 3.15 |
| 7221 | 1 | 3.15 |
| 7222 | 1 | 3.15 |
| 7223 | 1 | 3.15 |
| 7224 | 1 | 3.15 |
| 7225 | 1 | 3.15 |
| 7226 | 1 | 3.15 |
| 7227 | 1 | 3.15 |
| 7228 | 1 | 3.15 |
| 7229 | 1 | 3.15 |
| 7230 | 1 | 3.15 |
| 7231 | 1 | 3.15 |
| 7232 | 1 | 3.15 |
| 7233 | 1 | 3.15 |
| 7234 | 1 | 3.15 |
| 7235 | 1 | 3.15 |
| 7236 | 1 | 3.15 |
| 7237 | 1 | 3.15 |
| 7238 | 1 | 3.15 |
| 7239 | 1 | 3.15 |
| 7240 | 1 | 3.15 |
| 7241 | 1 | 3.15 |
| 7242 | 1 | 3.15 |
| 7243 | 1 | 3.15 |
| 7244 | 1 | 3.15 |
| 7245 | 1 | 3.15 |
| 7246 | 1 | 3.15 |
| 7247 | 1 | 3.15 |
| 7248 | 1 | 3.15 |
| 7249 | 1 | 3.15 |
| 7250 | 1 | 3.15 |
| 7251 | 1 | 3.15 |
| 7252 | 1 | 3.15 |
| 7253 | 1 | 3.15 |
| 7254 | 1 | 3.15 |
| 7255 | 1 | 3.15 |
| 7256 | 1 | 3.15 |
| 7257 | 1 | 3.15 |
| 7258 | 1 | 3.15 |
| 7259 | 1 | 3.15 |
| 7260 | 1 | 3.15 |
| 7261 | 1 | 3.15 |
| 7262 | 1 | 3.15 |
| 7263 | 1 | 3.15 |
| 7264 | 1 | 3.15 |
| 7265 | 1 | 3.15 |
| 7266 | 1 | 3.15 |
| 7267 | 1 | 3.15 |
| 7268 | 1 | 3.15 |
| 7269 | 1 | 3.14 |
| 7270 | 1 | 3.15 |
| 7271 | 1 | 3.15 |
| 7272 | 1 | 3.15 |
| 7273 | 1 | 3.15 |
| 7274 | 1 | 3.15 |
| 7275 | 1 | 3.15 |
| 7276 | 1 | 3.14 |
| 7277 | 1 | 3.14 |
| 7278 | 1 | 3.14 |
| 7279 | 1 | 3.14 |
| 7280 | 1 | 3.14 |
| 7281 | 1 | 3.14 |
| 7282 | 1 | 3.14 |
| 7283 | 1 | 3.14 |
| 7284 | 1 | 3.14 |
| 7285 | 1 | 3.14 |
| 7286 | 1 | 3.14 |
| 7287 | 1 | 3.14 |
| 7288 | 1 | 3.14 |
| 7289 | 1 | 3.14 |
| 7290 | 1 | 3.14 |
| 7291 | 1 | 3.14 |
| 7292 | 1 | 3.14 |
| 7293 | 1 | 3.14 |
| 7294 | 1 | 3.14 |
| 7295 | 1 | 3.14 |
| 7296 | 1 | 3.14 |
| 7297 | 1 | 3.14 |
| 7298 | 1 | 3.14 |
| 7299 | 1 | 3.14 |
| 7300 | 1 | 3.14 |
| 7301 | 1 | 3.14 |
| 7302 | 1 | 3.14 |
| 7303 | 1 | 3.14 |
| 7304 | 1 | 3.14 |
| 7305 | 1 | 3.14 |
| 7306 | 1 | 3.14 |
| 7307 | 1 | 3.14 |
| 7308 | 1 | 3.14 |
| 7309 | 1 | 3.14 |
| 7310 | 1 | 3.14 |
| 7311 | 1 | 3.14 |
| 7312 | 1 | 3.14 |
| 7313 | 1 | 3.14 |
| 7314 | 1 | 3.14 |
| 7315 | 1 | 3.14 |
| 7316 | 1 | 3.14 |
| 7317 | 1 | 3.14 |
| 7318 | 1 | 3.14 |
| 7319 | 1 | 3.14 |
| 7320 | 1 | 3.14 |
| 7321 | 1 | 3.14 |
| 7322 | 1 | 3.14 |
| 7323 | 1 | 3.14 |
| 7324 | 1 | 3.14 |
| 7325 | 1 | 3.14 |
| 7326 | 1 | 3.14 |
| 7327 | 1 | 3.14 |
| 7328 | 1 | 3.14 |
| 7329 | 1 | 3.14 |
| 7330 | 1 | 3.14 |
| 7331 | 1 | 3.14 |
| 7332 | 1 | 3.14 |
| 7333 | 1 | 3.14 |
| 7334 | 1 | 3.14 |
| 7335 | 1 | 3.14 |
| 7336 | 1 | 3.14 |
| 7337 | 1 | 3.14 |
| 7338 | 1 | 3.14 |
| 7339 | 1 | 3.14 |
| 7340 | 1 | 3.14 |
| 7341 | 1 | 3.14 |
| 7342 | 1 | 3.14 |
| 7343 | 1 | 3.14 |
| 7344 | 1 | 3.14 |
| 7345 | 1 | 3.14 |
| 7346 | 1 | 3.14 |
| 7347 | 1 | 3.14 |
| 7348 | 1 | 3.14 |
| 7349 | 1 | 3.14 |
| 7350 | 1 | 3.14 |
| 7351 | 1 | 3.14 |
| 7352 | 1 | 3.14 |
| 7353 | 1 | 3.14 |
| 7354 | 1 | 3.14 |
| 7355 | 1 | 3.14 |
| 7356 | 1 | 3.14 |
| 7357 | 1 | 3.14 |
| 7358 | 1 | 3.14 |
| 7359 | 1 | 3.14 |
| 7360 | 1 | 3.14 |
| 7361 | 1 | 3.14 |
| 7362 | 1 | 3.14 |
| 7363 | 1 | 3.14 |
| 7364 | 1 | 3.14 |
| 7365 | 1 | 3.14 |
| 7366 | 1 | 3.14 |
| 7367 | 1 | 3.14 |
| 7368 | 1 | 3.14 |
| 7369 | 1 | 3.14 |
| 7370 | 1 | 3.14 |
| 7371 | 1 | 3.14 |
| 7372 | 1 | 3.14 |
| 7373 | 1 | 3.14 |
| 7374 | 1 | 3.14 |
| 7375 | 1 | 3.14 |
| 7376 | 1 | 3.14 |
| 7377 | 1 | 3.14 |
| 7378 | 1 | 3.14 |
| 7379 | 1 | 3.14 |
| 7380 | 1 | 3.14 |
| 7381 | 1 | 3.14 |
| 7382 | 1 | 3.14 |
| 7383 | 1 | 3.14 |
| 7384 | 1 | 3.14 |
| 7385 | 1 | 3.14 |
| 7386 | 1 | 3.14 |
| 7387 | 1 | 3.14 |
| 7388 | 1 | 3.14 |
| 7389 | 1 | 3.14 |
| 7390 | 1 | 3.14 |
| 7391 | 1 | 3.14 |
| 7392 | 1 | 3.14 |
| 7393 | 1 | 3.14 |
| 7394 | 1 | 3.14 |
| 7395 | 1 | 3.14 |
| 7396 | 1 | 3.14 |
| 7397 | 1 | 3.14 |
| 7398 | 1 | 3.14 |
| 7399 | 1 | 3.14 |
| 7400 | 1 | 3.14 |
| 7401 | 1 | 3.14 |
| 7402 | 1 | 3.14 |
| 7403 | 1 | 3.14 |
| 7404 | 1 | 3.14 |
| 7405 | 1 | 3.14 |
| 7406 | 1 | 3.14 |
| 7407 | 1 | 3.14 |
| 7408 | 1 | 3.14 |
| 7409 | 1 | 3.14 |
| 7410 | 1 | 3.14 |
| 7411 | 1 | 3.14 |
| 7412 | 1 | 3.14 |
| 7413 | 1 | 3.14 |
| 7414 | 1 | 3.14 |
| 7415 | 1 | 3.14 |
| 7416 | 1 | 3.14 |
| 7417 | 1 | 3.14 |
| 7418 | 1 | 3.14 |
| 7419 | 1 | 3.14 |
| 7420 | 1 | 3.14 |
| 7421 | 1 | 3.14 |
| 7422 | 1 | 3.14 |
| 7423 | 1 | 3.14 |
| 7424 | 1 | 3.14 |
| 7425 | 1 | 3.14 |
| 7426 | 1 | 3.14 |
| 7427 | 1 | 3.14 |
| 7428 | 1 | 3.14 |
| 7429 | 1 | 3.14 |
| 7430 | 1 | 3.14 |
| 7431 | 1 | 3.14 |
| 7432 | 1 | 3.14 |
| 7433 | 1 | 3.14 |
| 7434 | 1 | 3.14 |
| 7435 | 1 | 3.14 |
| 7436 | 1 | 3.14 |
| 7437 | 1 | 3.14 |
| 7438 | 1 | 3.14 |
| 7439 | 1 | 3.14 |
| 7440 | 1 | 3.14 |
| 7441 | 1 | 3.14 |
| 7442 | 1 | 3.14 |
| 7443 | 1 | 3.14 |
| 7444 | 1 | 3.14 |
| 7445 | 1 | 3.14 |
| 7446 | 1 | 3.14 |
| 7447 | 1 | 3.14 |
| 7448 | 1 | 3.14 |
| 7449 | 1 | 3.14 |
| 7450 | 1 | 3.14 |
| 7451 | 1 | 3.14 |
| 7452 | 1 | 3.14 |
| 7453 | 1 | 3.14 |
| 7454 | 1 | 3.14 |
| 7455 | 1 | 3.14 |
| 7456 | 1 | 3.14 |
| 7457 | 1 | 3.14 |
| 7458 | 1 | 3.14 |
| 7459 | 1 | 3.14 |
| 7460 | 1 | 3.14 |
| 7461 | 1 | 3.14 |
| 7462 | 1 | 3.14 |
| 7463 | 1 | 3.14 |
| 7464 | 1 | 3.14 |
| 7465 | 1 | 3.14 |
| 7466 | 1 | 3.14 |
| 7467 | 1 | 3.14 |
| 7468 | 1 | 3.14 |
| 7469 | 1 | 3.14 |
| 7470 | 1 | 3.14 |
| 7471 | 1 | 3.14 |
| 7472 | 1 | 3.14 |
| 7473 | 1 | 3.14 |
| 7474 | 1 | 3.14 |
| 7475 | 1 | 3.14 |
| 7476 | 1 | 3.14 |
| 7477 | 1 | 3.14 |
| 7478 | 1 | 3.14 |
| 7479 | 1 | 3.14 |
| 7480 | 1 | 3.14 |
| 7481 | 1 | 3.14 |
| 7482 | 1 | 3.14 |
| 7483 | 1 | 3.14 |
| 7484 | 1 | 3.14 |
| 7485 | 1 | 3.14 |
| 7486 | 1 | 3.14 |
| 7487 | 1 | 3.14 |
| 7488 | 1 | 3.14 |
| 7489 | 1 | 3.14 |
| 7490 | 1 | 3.14 |
| 7491 | 1 | 3.14 |
| 7492 | 1 | 3.14 |
| 7493 | 1 | 3.14 |
| 7494 | 1 | 3.14 |
| 7495 | 1 | 3.14 |
| 7496 | 1 | 3.14 |
| 7497 | 1 | 3.14 |
| 7498 | 1 | 3.14 |
| 7499 | 1 | 3.14 |
| 7500 | 1 | 3.14 |
| 7501 | 1 | 3.14 |
| 7502 | 1 | 3.14 |
| 7503 | 1 | 3.14 |
| 7504 | 1 | 3.14 |
| 7505 | 1 | 3.14 |
| 7506 | 1 | 3.14 |
| 7507 | 1 | 3.14 |
| 7508 | 1 | 3.14 |
| 7509 | 1 | 3.14 |
| 7510 | 1 | 3.14 |
| 7511 | 1 | 3.14 |
| 7512 | 1 | 3.14 |
| 7513 | 1 | 3.14 |
| 7514 | 1 | 3.14 |
| 7515 | 1 | 3.14 |
| 7516 | 1 | 3.14 |
| 7517 | 1 | 3.14 |
| 7518 | 1 | 3.14 |
| 7519 | 1 | 3.14 |
| 7520 | 1 | 3.14 |
| 7521 | 1 | 3.13 |
| 7522 | 1 | 3.14 |
| 7523 | 1 | 3.14 |
| 7524 | 1 | 3.13 |
| 7525 | 1 | 3.13 |
| 7526 | 1 | 3.13 |
| 7527 | 1 | 3.13 |
| 7528 | 1 | 3.13 |
| 7529 | 1 | 3.13 |
| 7530 | 1 | 3.13 |
| 7531 | 1 | 3.13 |
| 7532 | 1 | 3.13 |
| 7533 | 1 | 3.13 |
| 7534 | 1 | 3.13 |
| 7535 | 1 | 3.13 |
| 7536 | 1 | 3.13 |
| 7537 | 1 | 3.13 |
| 7538 | 1 | 3.13 |
| 7539 | 1 | 3.13 |
| 7540 | 1 | 3.13 |
| 7541 | 1 | 3.13 |
| 7542 | 1 | 3.13 |
| 7543 | 1 | 3.13 |
| 7544 | 1 | 3.13 |
| 7545 | 1 | 3.13 |
| 7546 | 1 | 3.13 |
| 7547 | 1 | 3.13 |
| 7548 | 1 | 3.13 |
| 7549 | 1 | 3.13 |
| 7550 | 1 | 3.13 |
| 7551 | 1 | 3.13 |
| 7552 | 1 | 3.13 |
| 7553 | 1 | 3.13 |
| 7554 | 1 | 3.13 |
| 7555 | 1 | 3.13 |
| 7556 | 1 | 3.13 |
| 7557 | 1 | 3.13 |
| 7558 | 1 | 3.13 |
| 7559 | 1 | 3.13 |
| 7560 | 1 | 3.13 |
| 7561 | 1 | 3.13 |
| 7562 | 1 | 3.13 |
| 7563 | 1 | 3.13 |
| 7564 | 1 | 3.13 |
| 7565 | 1 | 3.13 |
| 7566 | 1 | 3.13 |
| 7567 | 1 | 3.13 |
| 7568 | 1 | 3.13 |
| 7569 | 1 | 3.13 |
| 7570 | 1 | 3.13 |
| 7571 | 1 | 3.13 |
| 7572 | 1 | 3.13 |
| 7573 | 1 | 3.13 |
| 7574 | 1 | 3.13 |
| 7575 | 1 | 3.13 |
| 7576 | 1 | 3.13 |
| 7577 | 1 | 3.13 |
| 7578 | 1 | 3.13 |
| 7579 | 1 | 3.13 |
| 7580 | 1 | 3.13 |
| 7581 | 1 | 3.13 |
| 7582 | 1 | 3.13 |
| 7583 | 1 | 3.13 |
| 7584 | 1 | 3.13 |
| 7585 | 1 | 3.13 |
| 7586 | 1 | 3.13 |
| 7587 | 1 | 3.13 |
| 7588 | 1 | 3.13 |
| 7589 | 1 | 3.13 |
| 7590 | 1 | 3.13 |
| 7591 | 1 | 3.13 |
| 7592 | 1 | 3.13 |
| 7593 | 1 | 3.13 |
| 7594 | 1 | 3.13 |
| 7595 | 1 | 3.13 |
| 7596 | 1 | 3.13 |
| 7597 | 1 | 3.13 |
| 7598 | 1 | 3.13 |
| 7599 | 1 | 3.13 |
| 7600 | 1 | 3.13 |
| 7601 | 1 | 3.13 |
| 7602 | 1 | 3.13 |
| 7603 | 1 | 3.13 |
| 7604 | 1 | 3.13 |
| 7605 | 1 | 3.13 |
| 7606 | 1 | 3.13 |
| 7607 | 1 | 3.13 |
| 7608 | 1 | 3.13 |
| 7609 | 1 | 3.13 |
| 7610 | 1 | 3.13 |
| 7611 | 1 | 3.13 |
| 7612 | 1 | 3.13 |
| 7613 | 1 | 3.13 |
| 7614 | 1 | 3.13 |
| 7615 | 1 | 3.13 |
| 7616 | 1 | 3.13 |
| 7617 | 1 | 3.13 |
| 7618 | 1 | 3.13 |
| 7619 | 1 | 3.13 |
| 7620 | 1 | 3.13 |
| 7621 | 1 | 3.13 |
| 7622 | 1 | 3.13 |
| 7623 | 1 | 3.13 |
| 7624 | 1 | 3.13 |
| 7625 | 1 | 3.13 |
| 7626 | 1 | 3.13 |
| 7627 | 1 | 3.13 |
| 7628 | 1 | 3.13 |
| 7629 | 1 | 3.13 |
| 7630 | 1 | 3.13 |
| 7631 | 1 | 3.13 |
| 7632 | 1 | 3.13 |
| 7633 | 1 | 3.13 |
| 7634 | 1 | 3.13 |
| 7635 | 1 | 3.13 |
| 7636 | 1 | 3.13 |
| 7637 | 1 | 3.13 |
| 7638 | 1 | 3.13 |
| 7639 | 1 | 3.13 |
| 7640 | 1 | 3.13 |
| 7641 | 1 | 3.13 |
| 7642 | 1 | 3.13 |
| 7643 | 1 | 3.13 |
| 7644 | 1 | 3.13 |
| 7645 | 1 | 3.13 |
| 7646 | 1 | 3.13 |
| 7647 | 1 | 3.13 |
| 7648 | 1 | 3.13 |
| 7649 | 1 | 3.13 |
| 7650 | 1 | 3.13 |
| 7651 | 1 | 3.13 |
| 7652 | 1 | 3.13 |
| 7653 | 1 | 3.13 |
| 7654 | 1 | 3.13 |
| 7655 | 1 | 3.13 |
| 7656 | 1 | 3.13 |
| 7657 | 1 | 3.13 |
| 7658 | 1 | 3.13 |
| 7659 | 1 | 3.13 |
| 7660 | 1 | 3.13 |
| 7661 | 1 | 3.13 |
| 7662 | 1 | 3.13 |
| 7663 | 1 | 3.13 |
| 7664 | 1 | 3.13 |
| 7665 | 1 | 3.13 |
| 7666 | 1 | 3.13 |
| 7667 | 1 | 3.13 |
| 7668 | 1 | 3.13 |
| 7669 | 1 | 3.13 |
| 7670 | 1 | 3.13 |
| 7671 | 1 | 3.13 |
| 7672 | 1 | 3.13 |
| 7673 | 1 | 3.13 |
| 7674 | 1 | 3.13 |
| 7675 | 1 | 3.13 |
| 7676 | 1 | 3.13 |
| 7677 | 1 | 3.13 |
| 7678 | 1 | 3.13 |
| 7679 | 1 | 3.13 |
| 7680 | 1 | 3.13 |
| 7681 | 1 | 3.13 |
| 7682 | 1 | 3.13 |
| 7683 | 1 | 3.13 |
| 7684 | 1 | 3.13 |
| 7685 | 1 | 3.13 |
| 7686 | 1 | 3.13 |
| 7687 | 1 | 3.13 |
| 7688 | 1 | 3.13 |
| 7689 | 1 | 3.13 |
| 7690 | 1 | 3.13 |
| 7691 | 1 | 3.13 |
| 7692 | 1 | 3.13 |
| 7693 | 1 | 3.13 |
| 7694 | 1 | 3.13 |
| 7695 | 1 | 3.13 |
| 7696 | 1 | 3.13 |
| 7697 | 1 | 3.13 |
| 7698 | 1 | 3.13 |
| 7699 | 1 | 3.13 |
| 7700 | 1 | 3.13 |
| 7701 | 1 | 3.13 |
| 7702 | 1 | 3.12 |
| 7703 | 1 | 3.13 |
| 7704 | 1 | 3.12 |
| 7705 | 1 | 3.12 |
| 7706 | 1 | 3.12 |
| 7707 | 1 | 3.12 |
| 7708 | 1 | 3.12 |
| 7709 | 1 | 3.12 |
| 7710 | 1 | 3.12 |
| 7711 | 1 | 3.12 |
| 7712 | 1 | 3.12 |
| 7713 | 1 | 3.12 |
| 7714 | 1 | 3.12 |
| 7715 | 1 | 3.12 |
| 7716 | 1 | 3.12 |
| 7717 | 1 | 3.12 |
| 7718 | 1 | 3.12 |
| 7719 | 1 | 3.12 |
| 7720 | 1 | 3.12 |
| 7721 | 1 | 3.12 |
| 7722 | 1 | 3.12 |
| 7723 | 1 | 3.12 |
| 7724 | 1 | 3.12 |
| 7725 | 1 | 3.12 |
| 7726 | 1 | 3.12 |
| 7727 | 1 | 3.12 |
| 7728 | 1 | 3.12 |
| 7729 | 1 | 3.12 |
| 7730 | 1 | 3.12 |
| 7731 | 1 | 3.12 |
| 7732 | 1 | 3.12 |
| 7733 | 1 | 3.12 |
| 7734 | 1 | 3.12 |
| 7735 | 1 | 3.12 |
| 7736 | 1 | 3.12 |
| 7737 | 1 | 3.12 |
| 7738 | 1 | 3.12 |
| 7739 | 1 | 3.12 |
| 7740 | 1 | 3.12 |
| 7741 | 1 | 3.12 |
| 7742 | 1 | 3.12 |
| 7743 | 1 | 3.12 |
| 7744 | 1 | 3.12 |
| 7745 | 1 | 3.12 |
| 7746 | 1 | 3.12 |
| 7747 | 1 | 3.12 |
| 7748 | 1 | 3.12 |
| 7749 | 1 | 3.12 |
| 7750 | 1 | 3.12 |
| 7751 | 1 | 3.12 |
| 7752 | 1 | 3.12 |
| 7753 | 1 | 3.12 |
| 7754 | 1 | 3.12 |
| 7755 | 1 | 3.12 |
| 7756 | 1 | 3.12 |
| 7757 | 1 | 3.12 |
| 7758 | 1 | 3.12 |
| 7759 | 1 | 3.12 |
| 7760 | 1 | 3.12 |
| 7761 | 1 | 3.12 |
| 7762 | 1 | 3.12 |
| 7763 | 1 | 3.12 |
| 7764 | 1 | 3.12 |
| 7765 | 1 | 3.12 |
| 7766 | 1 | 3.12 |
| 7767 | 1 | 3.12 |
| 7768 | 1 | 3.12 |
| 7769 | 1 | 3.12 |
| 7770 | 1 | 3.12 |
| 7771 | 1 | 3.12 |
| 7772 | 1 | 3.12 |
| 7773 | 1 | 3.12 |
| 7774 | 1 | 3.12 |
| 7775 | 1 | 3.12 |
| 7776 | 1 | 3.12 |
| 7777 | 1 | 3.12 |
| 7778 | 1 | 3.12 |
| 7779 | 1 | 3.12 |
| 7780 | 1 | 3.12 |
| 7781 | 1 | 3.12 |
| 7782 | 1 | 3.12 |
| 7783 | 1 | 3.12 |
| 7784 | 1 | 3.12 |
| 7785 | 1 | 3.12 |
| 7786 | 1 | 3.12 |
| 7787 | 1 | 3.12 |
| 7788 | 1 | 3.12 |
| 7789 | 1 | 3.12 |
| 7790 | 1 | 3.12 |
| 7791 | 1 | 3.12 |
| 7792 | 1 | 3.12 |
| 7793 | 1 | 3.12 |
| 7794 | 1 | 3.12 |
| 7795 | 1 | 3.12 |
| 7796 | 1 | 3.12 |
| 7797 | 1 | 3.12 |
| 7798 | 1 | 3.12 |
| 7799 | 1 | 3.12 |
| 7800 | 1 | 3.12 |
| 7801 | 1 | 3.12 |
| 7802 | 1 | 3.12 |
| 7803 | 1 | 3.12 |
| 7804 | 1 | 3.12 |
| 7805 | 1 | 3.12 |
| 7806 | 1 | 3.12 |
| 7807 | 1 | 3.12 |
| 7808 | 1 | 3.12 |
| 7809 | 1 | 3.12 |
| 7810 | 1 | 3.12 |
| 7811 | 1 | 3.12 |
| 7812 | 1 | 3.12 |
| 7813 | 1 | 3.12 |
| 7814 | 1 | 3.12 |
| 7815 | 1 | 3.12 |
| 7816 | 1 | 3.12 |
| 7817 | 1 | 3.12 |
| 7818 | 1 | 3.12 |
| 7819 | 1 | 3.12 |
| 7820 | 1 | 3.12 |
| 7821 | 1 | 3.12 |
| 7822 | 1 | 3.12 |
| 7823 | 1 | 3.12 |
| 7824 | 1 | 3.12 |
| 7825 | 1 | 3.12 |
| 7826 | 1 | 3.12 |
| 7827 | 1 | 3.12 |
| 7828 | 1 | 3.12 |
| 7829 | 1 | 3.12 |
| 7830 | 1 | 3.12 |
| 7831 | 1 | 3.12 |
| 7832 | 1 | 3.12 |
| 7833 | 1 | 3.12 |
| 7834 | 1 | 3.12 |
| 7835 | 1 | 3.11 |
| 7836 | 1 | 3.11 |
| 7837 | 1 | 3.11 |
| 7838 | 1 | 3.12 |
| 7839 | 1 | 3.11 |
| 7840 | 1 | 3.11 |
| 7841 | 1 | 3.11 |
| 7842 | 1 | 3.11 |
| 7843 | 1 | 3.11 |
| 7844 | 1 | 3.11 |
| 7845 | 1 | 3.11 |
| 7846 | 1 | 3.11 |
| 7847 | 1 | 3.11 |
| 7848 | 1 | 3.11 |
| 7849 | 1 | 3.11 |
| 7850 | 1 | 3.11 |
| 7851 | 1 | 3.11 |
| 7852 | 1 | 3.11 |
| 7853 | 1 | 3.11 |
| 7854 | 1 | 3.11 |
| 7855 | 1 | 3.11 |
| 7856 | 1 | 3.11 |
| 7857 | 1 | 3.11 |
| 7858 | 1 | 3.11 |
| 7859 | 1 | 3.11 |
| 7860 | 1 | 3.11 |
| 7861 | 1 | 3.11 |
| 7862 | 1 | 3.11 |
| 7863 | 1 | 3.11 |
| 7864 | 1 | 3.11 |
| 7865 | 1 | 3.11 |
| 7866 | 1 | 3.11 |
| 7867 | 1 | 3.11 |
| 7868 | 1 | 3.11 |
| 7869 | 1 | 3.11 |
| 7870 | 1 | 3.11 |
| 7871 | 1 | 3.11 |
| 7872 | 1 | 3.11 |
| 7873 | 1 | 3.11 |
| 7874 | 1 | 3.11 |
| 7875 | 1 | 3.11 |
| 7876 | 1 | 3.11 |
| 7877 | 1 | 3.11 |
| 7878 | 1 | 3.11 |
| 7879 | 1 | 3.11 |
| 7880 | 1 | 3.11 |
| 7881 | 1 | 3.11 |
| 7882 | 1 | 3.11 |
| 7883 | 1 | 3.11 |
| 7884 | 1 | 3.11 |
| 7885 | 1 | 3.11 |
| 7886 | 1 | 3.11 |
| 7887 | 1 | 3.11 |
| 7888 | 1 | 3.11 |
| 7889 | 1 | 3.11 |
| 7890 | 1 | 3.11 |
| 7891 | 1 | 3.11 |
| 7892 | 1 | 3.11 |
| 7893 | 1 | 3.11 |
| 7894 | 1 | 3.11 |
| 7895 | 1 | 3.11 |
| 7896 | 1 | 3.11 |
| 7897 | 1 | 3.11 |
| 7898 | 1 | 3.11 |
| 7899 | 1 | 3.11 |
| 7900 | 1 | 3.11 |
| 7901 | 1 | 3.11 |
| 7902 | 1 | 3.11 |
| 7903 | 1 | 3.11 |
| 7904 | 1 | 3.11 |
| 7905 | 1 | 3.11 |
| 7906 | 1 | 3.11 |
| 7907 | 1 | 3.11 |
| 7908 | 1 | 3.11 |
| 7909 | 1 | 3.11 |
| 7910 | 1 | 3.11 |
| 7911 | 1 | 3.11 |
| 7912 | 1 | 3.11 |
| 7913 | 1 | 3.11 |
| 7914 | 1 | 3.11 |
| 7915 | 1 | 3.11 |
| 7916 | 1 | 3.11 |
| 7917 | 1 | 3.11 |
| 7918 | 1 | 3.11 |
| 7919 | 1 | 3.11 |
| 7920 | 1 | 3.11 |
| 7921 | 1 | 3.11 |
| 7922 | 1 | 3.11 |
| 7923 | 1 | 3.11 |
| 7924 | 1 | 3.11 |
| 7925 | 1 | 3.11 |
| 7926 | 1 | 3.11 |
| 7927 | 1 | 3.11 |
| 7928 | 1 | 3.11 |
| 7929 | 1 | 3.11 |
| 7930 | 1 | 3.11 |
| 7931 | 1 | 3.11 |
| 7932 | 1 | 3.11 |
| 7933 | 1 | 3.11 |
| 7934 | 1 | 3.11 |
| 7935 | 1 | 3.11 |
| 7936 | 1 | 3.11 |
| 7937 | 1 | 3.11 |
| 7938 | 1 | 3.11 |
| 7939 | 1 | 3.11 |
| 7940 | 1 | 3.11 |
| 7941 | 1 | 3.11 |
| 7942 | 1 | 3.11 |
| 7943 | 1 | 3.11 |
| 7944 | 1 | 3.11 |
| 7945 | 1 | 3.11 |
| 7946 | 1 | 3.11 |
| 7947 | 1 | 3.11 |
| 7948 | 1 | 3.11 |
| 7949 | 1 | 3.11 |
| 7950 | 1 | 3.11 |
| 7951 | 1 | 3.11 |
| 7952 | 1 | 3.11 |
| 7953 | 1 | 3.11 |
| 7954 | 1 | 3.11 |
| 7955 | 1 | 3.11 |
| 7956 | 1 | 3.11 |
| 7957 | 1 | 3.11 |
| 7958 | 1 | 3.11 |
| 7959 | 1 | 3.11 |
| 7960 | 1 | 3.11 |
| 7961 | 1 | 3.11 |
| 7962 | 1 | 3.11 |
| 7963 | 1 | 3.11 |
| 7964 | 1 | 3.11 |
| 7965 | 1 | 3.11 |
| 7966 | 1 | 3.11 |
| 7967 | 1 | 3.11 |
| 7968 | 1 | 3.11 |
| 7969 | 1 | 3.11 |
| 7970 | 1 | 3.11 |
| 7971 | 1 | 3.11 |
| 7972 | 1 | 3.11 |
| 7973 | 1 | 3.11 |
| 7974 | 1 | 3.11 |
| 7975 | 1 | 3.11 |
| 7976 | 1 | 3.11 |
| 7977 | 1 | 3.11 |
| 7978 | 1 | 3.11 |
| 7979 | 1 | 3.11 |
| 7980 | 1 | 3.11 |
| 7981 | 1 | 3.11 |
| 7982 | 1 | 3.11 |
| 7983 | 1 | 3.11 |
| 7984 | 1 | 3.11 |
| 7985 | 1 | 3.11 |
| 7986 | 1 | 3.11 |
| 7987 | 1 | 3.11 |
| 7988 | 1 | 3.11 |
| 7989 | 1 | 3.11 |
| 7990 | 1 | 3.11 |
| 7991 | 1 | 3.11 |
| 7992 | 1 | 3.11 |
| 7993 | 1 | 3.11 |
| 7994 | 1 | 3.11 |
| 7995 | 1 | 3.11 |
| 7996 | 1 | 3.11 |
| 7997 | 1 | 3.11 |
| 7998 | 1 | 3.11 |
| 7999 | 1 | 3.11 |
| 8000 | 1 | 3.11 |
| 8001 | 1 | 3.11 |
| 8002 | 1 | 3.11 |
| 8003 | 1 | 3.11 |
| 8004 | 1 | 3.11 |
| 8005 | 1 | 3.11 |
| 8006 | 1 | 3.11 |
| 8007 | 1 | 3.11 |
| 8008 | 1 | 3.11 |
| 8009 | 1 | 3.11 |
| 8010 | 1 | 3.11 |
| 8011 | 1 | 3.11 |
| 8012 | 1 | 3.11 |
| 8013 | 1 | 3.11 |
| 8014 | 1 | 3.11 |
| 8015 | 1 | 3.11 |
| 8016 | 1 | 3.11 |
| 8017 | 1 | 3.11 |
| 8018 | 1 | 3.11 |
| 8019 | 1 | 3.11 |
| 8020 | 1 | 3.11 |
| 8021 | 1 | 3.11 |
| 8022 | 1 | 3.11 |
| 8023 | 1 | 3.11 |
| 8024 | 1 | 3.11 |
| 8025 | 1 | 3.11 |
| 8026 | 1 | 3.11 |
| 8027 | 1 | 3.11 |
| 8028 | 1 | 3.11 |
| 8029 | 1 | 3.11 |
| 8030 | 1 | 3.11 |
| 8031 | 1 | 3.11 |
| 8032 | 1 | 3.11 |
| 8033 | 1 | 3.11 |
| 8034 | 1 | 3.11 |
| 8035 | 1 | 3.11 |
| 8036 | 1 | 3.11 |
| 8037 | 1 | 3.11 |
| 8038 | 1 | 3.11 |
| 8039 | 1 | 3.11 |
| 8040 | 1 | 3.11 |
| 8041 | 1 | 3.11 |
| 8042 | 1 | 3.11 |
| 8043 | 1 | 3.11 |
| 8044 | 1 | 3.11 |
| 8045 | 1 | 3.11 |
| 8046 | 1 | 3.11 |
| 8047 | 1 | 3.11 |
| 8048 | 1 | 3.11 |
| 8049 | 1 | 3.11 |
| 8050 | 1 | 3.11 |
| 8051 | 1 | 3.11 |
| 8052 | 1 | 3.11 |
| 8053 | 1 | 3.11 |
| 8054 | 1 | 3.11 |
| 8055 | 1 | 3.11 |
| 8056 | 1 | 3.11 |
| 8057 | 1 | 3.11 |
| 8058 | 1 | 3.11 |
| 8059 | 1 | 3.11 |
| 8060 | 1 | 3.11 |
| 8061 | 1 | 3.11 |
| 8062 | 1 | 3.11 |
| 8063 | 1 | 3.11 |
| 8064 | 1 | 3.11 |
| 8065 | 1 | 3.11 |
| 8066 | 1 | 3.11 |
| 8067 | 1 | 3.11 |
| 8068 | 1 | 3.11 |
| 8069 | 1 | 3.11 |
| 8070 | 1 | 3.11 |
| 8071 | 1 | 3.11 |
| 8072 | 1 | 3.11 |
| 8073 | 1 | 3.11 |
| 8074 | 1 | 3.11 |
| 8075 | 1 | 3.1 |
| 8076 | 1 | 3.11 |
| 8077 | 1 | 3.11 |
| 8078 | 1 | 3.11 |
| 8079 | 1 | 3.1 |
| 8080 | 1 | 3.11 |
| 8081 | 1 | 3.1 |
| 8082 | 1 | 3.11 |
| 8083 | 1 | 3.11 |
| 8084 | 1 | 3.11 |
| 8085 | 1 | 3.1 |
| 8086 | 1 | 3.1 |
| 8087 | 1 | 3.1 |
| 8088 | 1 | 3.1 |
| 8089 | 1 | 3.1 |
| 8090 | 1 | 3.11 |
| 8091 | 1 | 3.1 |
| 8092 | 1 | 3.1 |
| 8093 | 1 | 3.1 |
| 8094 | 1 | 3.1 |
| 8095 | 1 | 3.1 |
| 8096 | 1 | 3.1 |
| 8097 | 1 | 3.1 |
| 8098 | 1 | 3.1 |
| 8099 | 1 | 3.1 |
| 8100 | 1 | 3.1 |
| 8101 | 1 | 3.1 |
| 8102 | 1 | 3.1 |
| 8103 | 1 | 3.1 |
| 8104 | 1 | 3.1 |
| 8105 | 1 | 3.1 |
| 8106 | 1 | 3.1 |
| 8107 | 1 | 3.1 |
| 8108 | 1 | 3.1 |
| 8109 | 1 | 3.1 |
| 8110 | 1 | 3.1 |
| 8111 | 1 | 3.1 |
| 8112 | 1 | 3.1 |
| 8113 | 1 | 3.1 |
| 8114 | 1 | 3.1 |
| 8115 | 1 | 3.1 |
| 8116 | 1 | 3.1 |
| 8117 | 1 | 3.1 |
| 8118 | 1 | 3.1 |
| 8119 | 1 | 3.1 |
| 8120 | 1 | 3.1 |
| 8121 | 1 | 3.1 |
| 8122 | 1 | 3.1 |
| 8123 | 1 | 3.1 |
| 8124 | 1 | 3.1 |
| 8125 | 1 | 3.1 |
| 8126 | 1 | 3.1 |
| 8127 | 1 | 3.1 |
| 8128 | 1 | 3.1 |
| 8129 | 1 | 3.1 |
| 8130 | 1 | 3.1 |
| 8131 | 1 | 3.1 |
| 8132 | 1 | 3.1 |
| 8133 | 1 | 3.1 |
| 8134 | 1 | 3.1 |
| 8135 | 1 | 3.1 |
| 8136 | 1 | 3.1 |
| 8137 | 1 | 3.1 |
| 8138 | 1 | 3.1 |
| 8139 | 1 | 3.1 |
| 8140 | 1 | 3.1 |
| 8141 | 1 | 3.1 |
| 8142 | 1 | 3.1 |
| 8143 | 1 | 3.1 |
| 8144 | 1 | 3.1 |
| 8145 | 1 | 3.1 |
| 8146 | 1 | 3.1 |
| 8147 | 1 | 3.1 |
| 8148 | 1 | 3.1 |
| 8149 | 1 | 3.1 |
| 8150 | 1 | 3.1 |
| 8151 | 1 | 3.1 |
| 8152 | 1 | 3.1 |
| 8153 | 1 | 3.1 |
| 8154 | 1 | 3.1 |
| 8155 | 1 | 3.1 |
| 8156 | 1 | 3.1 |
| 8157 | 1 | 3.1 |
| 8158 | 1 | 3.1 |
| 8159 | 1 | 3.1 |
| 8160 | 1 | 3.1 |
| 8161 | 1 | 3.1 |
| 8162 | 1 | 3.1 |
| 8163 | 1 | 3.1 |
| 8164 | 1 | 3.1 |
| 8165 | 1 | 3.1 |
| 8166 | 1 | 3.1 |
| 8167 | 1 | 3.1 |
| 8168 | 1 | 3.1 |
| 8169 | 1 | 3.1 |
| 8170 | 1 | 3.1 |
| 8171 | 1 | 3.1 |
| 8172 | 1 | 3.1 |
| 8173 | 1 | 3.1 |
| 8174 | 1 | 3.1 |
| 8175 | 1 | 3.1 |
| 8176 | 1 | 3.1 |
| 8177 | 1 | 3.1 |
| 8178 | 1 | 3.1 |
| 8179 | 1 | 3.1 |
| 8180 | 1 | 3.1 |
| 8181 | 1 | 3.1 |
| 8182 | 1 | 3.1 |
| 8183 | 1 | 3.1 |
| 8184 | 1 | 3.1 |
| 8185 | 1 | 3.1 |
| 8186 | 1 | 3.1 |
| 8187 | 1 | 3.1 |
| 8188 | 1 | 3.1 |
| 8189 | 1 | 3.1 |
| 8190 | 1 | 3.1 |
| 8191 | 1 | 3.1 |
| 8192 | 1 | 3.1 |
| 8193 | 1 | 3.1 |
| 8194 | 1 | 3.1 |
| 8195 | 1 | 3.1 |
| 8196 | 1 | 3.1 |
| 8197 | 1 | 3.1 |
| 8198 | 1 | 3.1 |
| 8199 | 1 | 3.1 |
| 8200 | 1 | 3.1 |
| 8201 | 1 | 3.1 |
| 8202 | 1 | 3.1 |
| 8203 | 1 | 3.1 |
| 8204 | 1 | 3.1 |
| 8205 | 1 | 3.1 |
| 8206 | 1 | 3.1 |
| 8207 | 1 | 3.1 |
| 8208 | 1 | 3.1 |
| 8209 | 1 | 3.1 |
| 8210 | 1 | 3.1 |
| 8211 | 1 | 3.1 |
| 8212 | 1 | 3.1 |
| 8213 | 1 | 3.1 |
| 8214 | 1 | 3.1 |
| 8215 | 1 | 3.1 |
| 8216 | 1 | 3.1 |
| 8217 | 1 | 3.1 |
| 8218 | 1 | 3.1 |
| 8219 | 1 | 3.1 |
| 8220 | 1 | 3.1 |
| 8221 | 1 | 3.1 |
| 8222 | 1 | 3.1 |
| 8223 | 1 | 3.1 |
| 8224 | 1 | 3.1 |
| 8225 | 1 | 3.1 |
| 8226 | 1 | 3.1 |
| 8227 | 1 | 3.1 |
| 8228 | 1 | 3.1 |
| 8229 | 1 | 3.1 |
| 8230 | 1 | 3.1 |
| 8231 | 1 | 3.1 |
| 8232 | 1 | 3.1 |
| 8233 | 1 | 3.1 |
| 8234 | 1 | 3.1 |
| 8235 | 1 | 3.1 |
| 8236 | 1 | 3.1 |
| 8237 | 1 | 3.1 |
| 8238 | 1 | 3.1 |
| 8239 | 1 | 3.1 |
| 8240 | 1 | 3.1 |
| 8241 | 1 | 3.1 |
| 8242 | 1 | 3.1 |
| 8243 | 1 | 3.1 |
| 8244 | 1 | 3.1 |
| 8245 | 1 | 3.1 |
| 8246 | 1 | 3.1 |
| 8247 | 1 | 3.1 |
| 8248 | 1 | 3.1 |
| 8249 | 1 | 3.1 |
| 8250 | 1 | 3.1 |
| 8251 | 1 | 3.1 |
| 8252 | 1 | 3.1 |
| 8253 | 1 | 3.1 |
| 8254 | 1 | 3.1 |
| 8255 | 1 | 3.1 |
| 8256 | 1 | 3.1 |
| 8257 | 1 | 3.1 |
| 8258 | 1 | 3.1 |
| 8259 | 1 | 3.1 |
| 8260 | 1 | 3.1 |
| 8261 | 1 | 3.09 |
| 8262 | 1 | 3.1 |
| 8263 | 1 | 3.1 |
| 8264 | 1 | 3.09 |
| 8265 | 1 | 3.09 |
| 8266 | 1 | 3.1 |
| 8267 | 1 | 3.09 |
| 8268 | 1 | 3.09 |
| 8269 | 1 | 3.09 |
| 8270 | 1 | 3.09 |
| 8271 | 1 | 3.09 |
| 8272 | 1 | 3.09 |
| 8273 | 1 | 3.09 |
| 8274 | 1 | 3.09 |
| 8275 | 1 | 3.09 |
| 8276 | 1 | 3.09 |
| 8277 | 1 | 3.09 |
| 8278 | 1 | 3.09 |
| 8279 | 1 | 3.09 |
| 8280 | 1 | 3.09 |
| 8281 | 1 | 3.09 |
| 8282 | 1 | 3.09 |
| 8283 | 1 | 3.09 |
| 8284 | 1 | 3.09 |
| 8285 | 1 | 3.09 |
| 8286 | 1 | 3.09 |
| 8287 | 1 | 3.09 |
| 8288 | 1 | 3.09 |
| 8289 | 1 | 3.09 |
| 8290 | 1 | 3.09 |
| 8291 | 1 | 3.09 |
| 8292 | 1 | 3.09 |
| 8293 | 1 | 3.09 |
| 8294 | 1 | 3.09 |
| 8295 | 1 | 3.09 |
| 8296 | 1 | 3.09 |
| 8297 | 1 | 3.09 |
| 8298 | 1 | 3.09 |
| 8299 | 1 | 3.09 |
| 8300 | 1 | 3.09 |
| 8301 | 1 | 3.09 |
| 8302 | 1 | 3.09 |
| 8303 | 1 | 3.09 |
| 8304 | 1 | 3.09 |
| 8305 | 1 | 3.09 |
| 8306 | 1 | 3.09 |
| 8307 | 1 | 3.09 |
| 8308 | 1 | 3.09 |
| 8309 | 1 | 3.09 |
| 8310 | 1 | 3.09 |
| 8311 | 1 | 3.09 |
| 8312 | 1 | 3.09 |
| 8313 | 1 | 3.09 |
| 8314 | 1 | 3.09 |
| 8315 | 1 | 3.09 |
| 8316 | 1 | 3.09 |
| 8317 | 1 | 3.09 |
| 8318 | 1 | 3.09 |
| 8319 | 1 | 3.09 |
| 8320 | 1 | 3.09 |
| 8321 | 1 | 3.09 |
| 8322 | 1 | 3.09 |
| 8323 | 1 | 3.09 |
| 8324 | 1 | 3.09 |
| 8325 | 1 | 3.09 |
| 8326 | 1 | 3.09 |
| 8327 | 1 | 3.09 |
| 8328 | 1 | 3.09 |
| 8329 | 1 | 3.09 |
| 8330 | 1 | 3.09 |
| 8331 | 1 | 3.09 |
| 8332 | 1 | 3.09 |
| 8333 | 1 | 3.09 |
| 8334 | 1 | 3.09 |
| 8335 | 1 | 3.09 |
| 8336 | 1 | 3.09 |
| 8337 | 1 | 3.09 |
| 8338 | 1 | 3.09 |
| 8339 | 1 | 3.09 |
| 8340 | 1 | 3.09 |
| 8341 | 1 | 3.09 |
| 8342 | 1 | 3.09 |
| 8343 | 1 | 3.09 |
| 8344 | 1 | 3.09 |
| 8345 | 1 | 3.09 |
| 8346 | 1 | 3.09 |
| 8347 | 1 | 3.09 |
| 8348 | 1 | 3.09 |
| 8349 | 1 | 3.09 |
| 8350 | 1 | 3.09 |
| 8351 | 1 | 3.09 |
| 8352 | 1 | 3.09 |
| 8353 | 1 | 3.09 |
| 8354 | 1 | 3.09 |
| 8355 | 1 | 3.09 |
| 8356 | 1 | 3.08 |
| 8357 | 1 | 3.09 |
| 8358 | 1 | 3.09 |
| 8359 | 1 | 3.08 |
| 8360 | 1 | 3.09 |
| 8361 | 1 | 3.08 |
| 8362 | 1 | 3.08 |
| 8363 | 1 | 3.08 |
| 8364 | 1 | 3.08 |
| 8365 | 1 | 3.08 |
| 8366 | 1 | 3.08 |
| 8367 | 1 | 3.08 |
| 8368 | 1 | 3.08 |
| 8369 | 1 | 3.08 |
| 8370 | 1 | 3.08 |
| 8371 | 1 | 3.08 |
| 8372 | 1 | 3.08 |
| 8373 | 1 | 3.08 |
| 8374 | 1 | 3.08 |
| 8375 | 1 | 3.08 |
| 8376 | 1 | 3.08 |
| 8377 | 1 | 3.08 |
| 8378 | 1 | 3.08 |
| 8379 | 1 | 3.08 |
| 8380 | 1 | 3.08 |
| 8381 | 1 | 3.08 |
| 8382 | 1 | 3.08 |
| 8383 | 1 | 3.08 |
| 8384 | 1 | 3.08 |
| 8385 | 1 | 3.08 |
| 8386 | 1 | 3.08 |
| 8387 | 1 | 3.08 |
| 8388 | 1 | 3.08 |
| 8389 | 1 | 3.08 |
| 8390 | 1 | 3.08 |
| 8391 | 1 | 3.08 |
| 8392 | 1 | 3.08 |
| 8393 | 1 | 3.08 |
| 8394 | 1 | 3.08 |
| 8395 | 1 | 3.08 |
| 8396 | 1 | 3.08 |
| 8397 | 1 | 3.08 |
| 8398 | 1 | 3.08 |
| 8399 | 1 | 3.08 |
| 8400 | 1 | 3.08 |
| 8401 | 1 | 3.08 |
| 8402 | 1 | 3.08 |
| 8403 | 1 | 3.08 |
| 8404 | 1 | 3.08 |
| 8405 | 1 | 3.08 |
| 8406 | 1 | 3.08 |
| 8407 | 1 | 3.08 |
| 8408 | 1 | 3.08 |
| 8409 | 1 | 3.08 |
| 8410 | 1 | 3.08 |
| 8411 | 1 | 3.08 |
| 8412 | 1 | 3.08 |
| 8413 | 1 | 3.08 |
| 8414 | 1 | 3.08 |
| 8415 | 1 | 3.08 |
| 8416 | 1 | 3.08 |
| 8417 | 1 | 3.08 |
| 8418 | 1 | 3.08 |
| 8419 | 1 | 3.08 |
| 8420 | 1 | 3.08 |
| 8421 | 1 | 3.08 |
| 8422 | 1 | 3.08 |
| 8423 | 1 | 3.07 |
| 8424 | 1 | 3.07 |
| 8425 | 1 | 3.07 |
| 8426 | 1 | 3.07 |
| 8427 | 1 | 3.07 |
| 8428 | 1 | 3.07 |
| 8429 | 1 | 3.07 |
| 8430 | 1 | 3.07 |
| 8431 | 1 | 3.07 |
| 8432 | 1 | 3.07 |
| 8433 | 1 | 3.07 |
| 8434 | 1 | 3.07 |
| 8435 | 1 | 3.07 |
| 8436 | 1 | 3.07 |
| 8437 | 1 | 3.07 |
| 8438 | 1 | 3.07 |
| 8439 | 1 | 3.07 |
| 8440 | 1 | 3.07 |
| 8441 | 1 | 3.07 |
| 8442 | 1 | 3.07 |
| 8443 | 1 | 3.07 |
| 8444 | 1 | 3.07 |
| 8445 | 1 | 3.07 |
| 8446 | 1 | 3.07 |
| 8447 | 1 | 3.07 |
| 8448 | 1 | 3.07 |
| 8449 | 1 | 3.07 |
| 8450 | 1 | 3.07 |
| 8451 | 1 | 3.07 |
| 8452 | 1 | 3.07 |
| 8453 | 1 | 3.07 |
| 8454 | 1 | 3.07 |
| 8455 | 1 | 3.07 |
| 8456 | 1 | 3.06 |
| 8457 | 1 | 3.07 |
| 8458 | 1 | 3.06 |
| 8459 | 1 | 3.06 |
| 8460 | 1 | 3.06 |
| 8461 | 1 | 3.06 |
| 8462 | 1 | 3.06 |
| 8463 | 1 | 3.06 |
| 8464 | 1 | 3.06 |
| 8465 | 1 | 3.06 |
| 8466 | 1 | 3.06 |
| 8467 | 1 | 3.06 |
| 8468 | 1 | 3.06 |
| 8469 | 1 | 3.06 |
| 8470 | 1 | 3.06 |
| 8471 | 1 | 3.06 |
| 8472 | 1 | 3.06 |
| 8473 | 1 | 3.06 |
| 8474 | 1 | 3.06 |
| 8475 | 1 | 3.06 |
| 8476 | 1 | 3.06 |
| 8477 | 1 | 3.06 |
| 8478 | 1 | 3.06 |
| 8479 | 1 | 3.06 |
| 8480 | 1 | 3.06 |
| 8481 | 1 | 3.06 |
| 8482 | 1 | 3.06 |
| 8483 | 1 | 3.06 |
| 8484 | 1 | 3.06 |
| 8485 | 1 | 3.06 |
| 8486 | 1 | 3.05 |
| 8487 | 1 | 3.05 |
| 8488 | 1 | 3.05 |
| 8489 | 1 | 3.05 |
| 8490 | 1 | 3.05 |
| 8491 | 1 | 3.05 |
| 8492 | 1 | 3.05 |
| 8493 | 1 | 3.05 |
| 8494 | 1 | 3.05 |
| 8495 | 1 | 3.05 |
| 8496 | 1 | 3.05 |
| 8497 | 1 | 3.05 |
| 8498 | 1 | 3.05 |
| 8499 | 1 | 3.05 |
| 8500 | 1 | 3.05 |
| 8501 | 1 | 3.05 |
| 8502 | 1 | 3.05 |
| 8503 | 1 | 3.05 |
| 8504 | 1 | 3.05 |
| 8505 | 1 | 3.05 |
| 8506 | 1 | 3.05 |
| 8507 | 1 | 3.05 |
| 8508 | 1 | 3.05 |
| 8509 | 1 | 3.05 |
| 8510 | 1 | 3.05 |
| 8511 | 1 | 3.05 |
| 8512 | 1 | 3.05 |
| 8513 | 1 | 3.05 |
| 8514 | 1 | 3.05 |
| 8515 | 1 | 3.04 |
| 8516 | 1 | 3.04 |
| 8517 | 1 | 3.04 |
| 8518 | 1 | 3.04 |
| 8519 | 1 | 3.04 |
| 8520 | 1 | 3.04 |
| 8521 | 1 | 3.04 |
| 8522 | 1 | 3.04 |
| 8523 | 1 | 3.04 |
| 8524 | 1 | 3.04 |
| 8525 | 1 | 3.04 |
| 8526 | 1 | 3.04 |
| 8527 | 1 | 3.04 |
| 8528 | 1 | 3.04 |
| 8529 | 1 | 3.04 |
| 8530 | 1 | 3.04 |
| 8531 | 1 | 3.04 |
| 8532 | 1 | 3.04 |
| 8533 | 1 | 3.04 |
| 8534 | 1 | 3.04 |
| 8535 | 1 | 3.04 |
| 8536 | 1 | 3.04 |
| 8537 | 1 | 3.04 |
| 8538 | 1 | 3.04 |
| 8539 | 1 | 3.04 |
| 8540 | 1 | 3.04 |
| 8541 | 1 | 3.04 |
| 8542 | 1 | 3.03 |
| 8543 | 1 | 3.03 |
| 8544 | 1 | 3.03 |
| 8545 | 1 | 3.03 |
| 8546 | 1 | 3.03 |
| 8547 | 1 | 3.03 |
| 8548 | 1 | 3.03 |
| 8549 | 1 | 3.03 |
| 8550 | 1 | 3.03 |
| 8551 | 1 | 3.03 |
| 8552 | 1 | 3.03 |
| 8553 | 1 | 3.03 |
| 8554 | 1 | 3.03 |
| 8555 | 1 | 3.03 |
| 8556 | 1 | 3.03 |
| 8557 | 1 | 3.03 |
| 8558 | 1 | 3.03 |
| 8559 | 1 | 3.03 |
| 8560 | 1 | 3.03 |
| 8561 | 1 | 3.03 |
| 8562 | 1 | 3.03 |
| 8563 | 1 | 3.03 |
| 8564 | 1 | 3.03 |
| 8565 | 1 | 3.02 |
| 8566 | 1 | 3.02 |
| 8567 | 1 | 3.02 |
| 8568 | 1 | 3.02 |
| 8569 | 1 | 3.02 |
| 8570 | 1 | 3.02 |
| 8571 | 1 | 3.02 |
| 8572 | 1 | 3.02 |
| 8573 | 1 | 3.02 |
| 8574 | 1 | 3.02 |
| 8575 | 1 | 3.02 |
| 8576 | 1 | 3.02 |
| 8577 | 1 | 3.02 |
| 8578 | 1 | 3.02 |
| 8579 | 1 | 3.02 |
| 8580 | 1 | 3.02 |
| 8581 | 1 | 3.02 |
| 8582 | 1 | 3.02 |
| 8583 | 1 | 3.02 |
| 8584 | 1 | 3.02 |
| 8585 | 1 | 3.02 |
| 8586 | 1 | 3.02 |
| 8587 | 1 | 3.02 |
| 8588 | 1 | 3.02 |
| 8589 | 1 | 3.02 |
| 8590 | 1 | 3.01 |
| 8591 | 1 | 3.01 |
| 8592 | 1 | 3.01 |
| 8593 | 1 | 3.01 |
| 8594 | 1 | 3.01 |
| 8595 | 1 | 3.01 |
| 8596 | 1 | 3.01 |
| 8597 | 1 | 3.01 |
| 8598 | 1 | 3.01 |
| 8599 | 1 | 3.01 |
| 8600 | 1 | 3.01 |
| 8601 | 1 | 3.01 |
| 8602 | 1 | 3.01 |
| 8603 | 1 | 3.01 |
| 8604 | 1 | 3.01 |
| 8605 | 1 | 3.01 |
| 8606 | 1 | 3.01 |
| 8607 | 1 | 3.01 |
| 8608 | 1 | 3.01 |
| 8609 | 1 | 3.01 |
| 8610 | 1 | 3.01 |
| 8611 | 1 | 3.01 |
| 8612 | 1 | 3.01 |
| 8613 | 1 | 3.01 |
| 8614 | 1 | 3.01 |
| 8615 | 1 | 3 |
| 8616 | 1 | 3 |
| 8617 | 1 | 3 |
| 8618 | 1 | 3 |
| 8619 | 1 | 3 |
| 8620 | 1 | 3 |
| 8621 | 1 | 3 |
| 8622 | 1 | 3 |
| 8623 | 1 | 3 |
| 8624 | 1 | 3 |
| 8625 | 1 | 3 |
| 8626 | 1 | 3 |
| 8627 | 1 | 3 |
| 8628 | 1 | 3 |
| 8629 | 1 | 3 |
| 8630 | 1 | 3 |
| 8631 | 1 | 3 |
| 8632 | 1 | 3 |
| 8633 | 1 | 3 |
| 8634 | 1 | 3 |
| 8635 | 1 | 3 |
| 8636 | 1 | 3 |
| 8637 | 1 | 2.99 |
| 8638 | 1 | 2.99 |
| 8639 | 1 | 2.99 |
| 8640 | 1 | 2.99 |
| 8641 | 1 | 2.99 |
| 8642 | 1 | 2.99 |
| 8643 | 1 | 2.99 |
| 8644 | 1 | 2.99 |
| 8645 | 1 | 2.99 |
| 8646 | 1 | 2.99 |
| 8647 | 1 | 2.99 |
| 8648 | 1 | 2.99 |
| 8649 | 1 | 2.99 |
| 8650 | 1 | 2.99 |
| 8651 | 1 | 2.99 |
| 8652 | 1 | 2.99 |
| 8653 | 1 | 2.99 |
| 8654 | 1 | 2.99 |
| 8655 | 1 | 2.99 |
| 8656 | 1 | 2.99 |
| 8657 | 1 | 2.99 |
| 8658 | 1 | 2.98 |
| 8659 | 1 | 2.98 |
| 8660 | 1 | 2.98 |
| 8661 | 1 | 2.98 |
| 8662 | 1 | 2.98 |
| 8663 | 1 | 2.98 |
| 8664 | 1 | 2.98 |
| 8665 | 1 | 2.98 |
| 8666 | 1 | 2.98 |
| 8667 | 1 | 2.98 |
| 8668 | 1 | 2.98 |
| 8669 | 1 | 2.98 |
| 8670 | 1 | 2.98 |
| 8671 | 1 | 2.98 |
| 8672 | 1 | 2.98 |
| 8673 | 1 | 2.98 |
| 8674 | 1 | 2.98 |
| 8675 | 1 | 2.98 |
| 8676 | 1 | 2.98 |
| 8677 | 1 | 2.98 |
| 8678 | 1 | 2.98 |
| 8679 | 1 | 2.97 |
| 8680 | 1 | 2.97 |
| 8681 | 1 | 2.97 |
| 8682 | 1 | 2.97 |
| 8683 | 1 | 2.97 |
| 8684 | 1 | 2.97 |
| 8685 | 1 | 2.97 |
| 8686 | 1 | 2.97 |
| 8687 | 1 | 2.97 |
| 8688 | 1 | 2.97 |
| 8689 | 1 | 2.97 |
| 8690 | 1 | 2.97 |
| 8691 | 1 | 2.97 |
| 8692 | 1 | 2.97 |
| 8693 | 1 | 2.97 |
| 8694 | 1 | 2.97 |
| 8695 | 1 | 2.97 |
| 8696 | 1 | 2.97 |
| 8697 | 1 | 2.97 |
| 8698 | 1 | 2.96 |
| 8699 | 1 | 2.96 |
| 8700 | 1 | 2.96 |
| 8701 | 1 | 2.96 |
| 8702 | 1 | 2.96 |
| 8703 | 1 | 2.96 |
| 8704 | 1 | 2.96 |
| 8705 | 1 | 2.96 |
| 8706 | 1 | 2.96 |
| 8707 | 1 | 2.96 |
| 8708 | 1 | 2.96 |
| 8709 | 1 | 2.96 |
| 8710 | 1 | 2.96 |
| 8711 | 1 | 2.96 |
| 8712 | 1 | 2.96 |
| 8713 | 1 | 2.96 |
| 8714 | 1 | 2.96 |
| 8715 | 1 | 2.96 |
| 8716 | 1 | 2.95 |
| 8717 | 1 | 2.95 |
| 8718 | 1 | 2.95 |
| 8719 | 1 | 2.95 |
| 8720 | 1 | 2.95 |
| 8721 | 1 | 2.95 |
| 8722 | 1 | 2.95 |
| 8723 | 1 | 2.95 |
| 8724 | 1 | 2.95 |
| 8725 | 1 | 2.95 |
| 8726 | 1 | 2.95 |
| 8727 | 1 | 2.95 |
| 8728 | 1 | 2.95 |
| 8729 | 1 | 2.95 |
| 8730 | 1 | 2.95 |
| 8731 | 1 | 2.95 |
| 8732 | 1 | 2.95 |
| 8733 | 1 | 2.94 |
| 8734 | 1 | 2.94 |
| 8735 | 1 | 2.94 |
| 8736 | 1 | 2.94 |
| 8737 | 1 | 2.94 |
| 8738 | 1 | 2.94 |
| 8739 | 1 | 2.94 |
| 8740 | 1 | 2.94 |
| 8741 | 1 | 2.94 |
| 8742 | 1 | 2.94 |
| 8743 | 1 | 2.94 |
| 8744 | 1 | 2.94 |
| 8745 | 1 | 2.94 |
| 8746 | 1 | 2.94 |
| 8747 | 1 | 2.94 |
| 8748 | 1 | 2.94 |
| 8749 | 1 | 2.94 |
| 8750 | 1 | 2.94 |
| 8751 | 1 | 2.93 |
| 8752 | 1 | 2.93 |
| 8753 | 1 | 2.93 |
| 8754 | 1 | 2.93 |
| 8755 | 1 | 2.93 |
| 8756 | 1 | 2.93 |
| 8757 | 1 | 2.93 |
| 8758 | 1 | 2.93 |
| 8759 | 1 | 2.93 |
| 8760 | 1 | 2.93 |
| 8761 | 1 | 2.93 |
| 8762 | 1 | 2.93 |
| 8763 | 1 | 2.93 |
| 8764 | 1 | 2.93 |
| 8765 | 1 | 2.93 |
| 8766 | 1 | 2.93 |
| 8767 | 1 | 2.93 |
| 8768 | 1 | 2.92 |
| 8769 | 1 | 2.92 |
| 8770 | 1 | 2.92 |
| 8771 | 1 | 2.92 |
| 8772 | 1 | 2.92 |
| 8773 | 1 | 2.92 |
| 8774 | 1 | 2.92 |
| 8775 | 1 | 2.92 |
| 8776 | 1 | 2.92 |
| 8777 | 1 | 2.92 |
| 8778 | 1 | 2.92 |
| 8779 | 1 | 2.92 |
| 8780 | 1 | 2.92 |
| 8781 | 1 | 2.92 |
| 8782 | 1 | 2.92 |
| 8783 | 1 | 2.92 |
| 8784 | 1 | 2.92 |
| 8785 | 1 | 2.92 |
| 8786 | 1 | 2.92 |
| 8787 | 1 | 2.92 |
| 8788 | 1 | 2.92 |
| 8789 | 1 | 2.92 |
| 8790 | 1 | 2.91 |
| 8791 | 1 | 2.91 |
| 8792 | 1 | 2.91 |
| 8793 | 1 | 2.91 |
| 8794 | 1 | 2.91 |
| 8795 | 1 | 2.91 |
| 8796 | 1 | 2.91 |
| 8797 | 1 | 2.91 |
| 8798 | 1 | 2.91 |
| 8799 | 1 | 2.91 |
| 8800 | 1 | 2.91 |
| 8801 | 1 | 2.91 |
| 8802 | 1 | 2.91 |
| 8803 | 1 | 2.91 |
| 8804 | 1 | 2.91 |
| 8805 | 1 | 2.9 |
| 8806 | 1 | 2.9 |
| 8807 | 1 | 2.9 |
| 8808 | 1 | 2.9 |
| 8809 | 1 | 2.9 |
| 8810 | 1 | 2.9 |
| 8811 | 1 | 2.9 |
| 8812 | 1 | 2.9 |
| 8813 | 1 | 2.9 |
| 8814 | 1 | 2.9 |
| 8815 | 1 | 2.9 |
| 8816 | 1 | 2.9 |
| 8817 | 1 | 2.9 |
| 8818 | 1 | 2.9 |
| 8819 | 1 | 2.9 |
| 8820 | 1 | 2.89 |
| 8821 | 1 | 2.89 |
| 8822 | 1 | 2.89 |
| 8823 | 1 | 2.89 |
| 8824 | 1 | 2.89 |
| 8825 | 1 | 2.89 |
| 8826 | 1 | 2.89 |
| 8827 | 1 | 2.89 |
| 8828 | 1 | 2.89 |
| 8829 | 1 | 2.89 |
| 8830 | 1 | 2.89 |
| 8831 | 1 | 2.89 |
| 8832 | 1 | 2.89 |
| 8833 | 1 | 2.88 |
| 8834 | 1 | 2.88 |
| 8835 | 1 | 2.88 |
| 8836 | 1 | 2.88 |
| 8837 | 1 | 2.88 |
| 8838 | 1 | 2.88 |
| 8839 | 1 | 2.88 |
| 8840 | 1 | 2.88 |
| 8841 | 1 | 2.88 |
| 8842 | 1 | 2.88 |
| 8843 | 1 | 2.88 |
| 8844 | 1 | 2.88 |
| 8845 | 1 | 2.88 |
| 8846 | 1 | 2.87 |
| 8847 | 1 | 2.87 |
| 8848 | 1 | 2.87 |
| 8849 | 1 | 2.87 |
| 8850 | 1 | 2.87 |
| 8851 | 1 | 2.87 |
| 8852 | 1 | 2.87 |
| 8853 | 1 | 2.87 |
| 8854 | 1 | 2.87 |
| 8855 | 1 | 2.87 |
| 8856 | 1 | 2.87 |
| 8857 | 1 | 2.87 |
| 8858 | 1 | 2.86 |
| 8859 | 1 | 2.86 |
| 8860 | 1 | 2.86 |
| 8861 | 1 | 2.86 |
| 8862 | 1 | 2.86 |
| 8863 | 1 | 2.86 |
| 8864 | 1 | 2.86 |
| 8865 | 1 | 2.86 |
| 8866 | 1 | 2.86 |
| 8867 | 1 | 2.86 |
| 8868 | 1 | 2.86 |
| 8869 | 1 | 2.86 |
| 8870 | 1 | 2.86 |
| 8871 | 1 | 2.86 |
| 8872 | 1 | 2.85 |
| 8873 | 1 | 2.85 |
| 8874 | 1 | 2.85 |
| 8875 | 1 | 2.85 |
| 8876 | 1 | 2.85 |
| 8877 | 1 | 2.85 |
| 8878 | 1 | 2.85 |
| 8879 | 1 | 2.85 |
| 8880 | 1 | 2.85 |
| 8881 | 1 | 2.85 |
| 8882 | 1 | 2.85 |
| 8883 | 1 | 2.84 |
| 8884 | 1 | 2.84 |
| 8885 | 1 | 2.84 |
| 8886 | 1 | 2.84 |
| 8887 | 1 | 2.84 |
| 8888 | 1 | 2.84 |
| 8889 | 1 | 2.84 |
| 8890 | 1 | 2.84 |
| 8891 | 1 | 2.84 |
| 8892 | 1 | 2.84 |
| 8893 | 1 | 2.84 |
| 8894 | 1 | 2.84 |
| 8895 | 1 | 2.83 |
| 8896 | 1 | 2.83 |
| 8897 | 1 | 2.83 |
| 8898 | 1 | 2.83 |
| 8899 | 1 | 2.83 |
| 8900 | 1 | 2.83 |
| 8901 | 1 | 2.83 |
| 8902 | 1 | 2.83 |
| 8903 | 1 | 2.83 |
| 8904 | 1 | 2.83 |
| 8905 | 1 | 2.83 |
| 8906 | 1 | 2.82 |
| 8907 | 1 | 2.82 |
| 8908 | 1 | 2.82 |
| 8909 | 1 | 2.82 |
| 8910 | 1 | 2.82 |
| 8911 | 1 | 2.82 |
| 8912 | 1 | 2.82 |
| 8913 | 1 | 2.82 |
| 8914 | 1 | 2.82 |
| 8915 | 1 | 2.82 |
| 8916 | 1 | 2.81 |
| 8917 | 1 | 2.81 |
| 8918 | 1 | 2.81 |
| 8919 | 1 | 2.81 |
| 8920 | 1 | 2.81 |
| 8921 | 1 | 2.81 |
| 8922 | 1 | 2.81 |
| 8923 | 1 | 2.81 |
| 8924 | 1 | 2.81 |
| 8925 | 1 | 2.81 |
| 8926 | 1 | 2.8 |
| 8927 | 1 | 2.8 |
| 8928 | 1 | 2.8 |
| 8929 | 1 | 2.8 |
| 8930 | 1 | 2.8 |
| 8931 | 1 | 2.8 |
| 8932 | 1 | 2.8 |
| 8933 | 1 | 2.8 |
| 8934 | 1 | 2.8 |
| 8935 | 1 | 2.79 |
| 8936 | 1 | 2.79 |
| 8937 | 1 | 2.79 |
| 8938 | 1 | 2.79 |
| 8939 | 1 | 2.79 |
| 8940 | 1 | 2.79 |
| 8941 | 1 | 2.79 |
| 8942 | 1 | 2.79 |
| 8943 | 1 | 2.79 |
| 8944 | 1 | 2.78 |
| 8945 | 1 | 2.78 |
| 8946 | 1 | 2.78 |
| 8947 | 1 | 2.78 |
| 8948 | 1 | 2.78 |
| 8949 | 1 | 2.78 |
| 8950 | 1 | 2.78 |
| 8951 | 1 | 2.78 |
| 8952 | 1 | 2.78 |
| 8953 | 1 | 2.78 |
| 8954 | 1 | 2.77 |
| 8955 | 1 | 2.77 |
| 8956 | 1 | 2.77 |
| 8957 | 1 | 2.77 |
| 8958 | 1 | 2.77 |
| 8959 | 1 | 2.77 |
| 8960 | 1 | 2.77 |
| 8961 | 1 | 2.77 |
| 8962 | 1 | 2.77 |
| 8963 | 1 | 2.77 |
| 8964 | 1 | 2.77 |
| 8965 | 1 | 2.76 |
| 8966 | 1 | 2.76 |
| 8967 | 1 | 2.76 |
| 8968 | 1 | 2.76 |
| 8969 | 1 | 2.76 |
| 8970 | 1 | 2.76 |
| 8971 | 1 | 2.76 |
| 8972 | 1 | 2.75 |
| 8973 | 1 | 2.75 |
| 8974 | 1 | 2.75 |
| 8975 | 1 | 2.75 |
| 8976 | 1 | 2.75 |
| 8977 | 1 | 2.75 |
| 8978 | 1 | 2.75 |
| 8979 | 1 | 2.75 |
| 8980 | 1 | 2.74 |
| 8981 | 1 | 2.74 |
| 8982 | 1 | 2.74 |
| 8983 | 1 | 2.74 |
| 8984 | 1 | 2.74 |
| 8985 | 1 | 2.74 |
| 8986 | 1 | 2.74 |
| 8987 | 1 | 2.73 |
| 8988 | 1 | 2.73 |
| 8989 | 1 | 2.73 |
| 8990 | 1 | 2.73 |
| 8991 | 1 | 2.73 |
| 8992 | 1 | 2.73 |
| 8993 | 1 | 2.73 |
| 8994 | 1 | 2.72 |
| 8995 | 1 | 2.72 |
| 8996 | 1 | 2.72 |
| 8997 | 1 | 2.72 |
| 8998 | 1 | 2.72 |
| 8999 | 1 | 2.72 |
| 9000 | 1 | 2.71 |
| 9001 | 1 | 2.71 |
| 9002 | 1 | 2.71 |
| 9003 | 1 | 2.71 |
| 9004 | 1 | 2.71 |
| 9005 | 1 | 2.71 |
| 9006 | 1 | 2.71 |
| 9007 | 1 | 2.7 |
| 9008 | 1 | 2.7 |
| 9009 | 1 | 2.7 |
| 9010 | 1 | 2.7 |
| 9011 | 1 | 2.7 |
| 9012 | 1 | 2.7 |
| 9013 | 1 | 2.7 |
| 9014 | 1 | 2.69 |
| 9015 | 1 | 2.69 |
| 9016 | 1 | 2.69 |
| 9017 | 1 | 2.69 |
| 9018 | 1 | 2.69 |
| 9019 | 1 | 2.69 |
| 9020 | 1 | 2.68 |
| 9021 | 1 | 2.68 |
| 9022 | 1 | 2.68 |
| 9023 | 1 | 2.68 |
| 9024 | 1 | 2.68 |
| 9025 | 1 | 2.67 |
| 9026 | 1 | 2.67 |
| 9027 | 1 | 2.67 |
| 9028 | 1 | 2.67 |
| 9029 | 1 | 2.67 |
| 9030 | 1 | 2.67 |
| 9031 | 1 | 2.66 |
| 9032 | 1 | 2.66 |
| 9033 | 1 | 2.66 |
| 9034 | 1 | 2.66 |
| 9035 | 1 | 2.66 |
| 9036 | 1 | 2.65 |
| 9037 | 1 | 2.65 |
| 9038 | 1 | 2.65 |
| 9039 | 1 | 2.65 |
| 9040 | 1 | 2.65 |
| 9041 | 1 | 2.64 |
| 9042 | 1 | 2.64 |
| 9043 | 1 | 2.64 |
| 9044 | 1 | 2.64 |
| 9045 | 1 | 2.63 |
| 9046 | 1 | 2.63 |
| 9047 | 1 | 2.63 |
| 9048 | 1 | 2.63 |
| 9049 | 1 | 2.63 |
| 9050 | 1 | 2.62 |
| 9051 | 1 | 2.62 |
| 9052 | 1 | 2.62 |
| 9053 | 1 | 2.62 |
| 9054 | 1 | 2.62 |
| 9055 | 1 | 2.61 |
| 9056 | 1 | 2.61 |
| 9057 | 1 | 2.61 |
| 9058 | 1 | 2.61 |
| 9059 | 1 | 2.6 |
| 9060 | 1 | 2.6 |
| 9061 | 1 | 2.6 |
| 9062 | 1 | 2.6 |
| 9063 | 1 | 2.59 |
| 9064 | 1 | 2.59 |
| 9065 | 1 | 2.59 |
| 9066 | 1 | 2.59 |
| 9067 | 1 | 2.58 |
| 9068 | 1 | 2.58 |
| 9069 | 1 | 2.58 |
| 9070 | 1 | 2.57 |
| 9071 | 1 | 2.57 |
| 9072 | 1 | 2.57 |
| 9073 | 1 | 2.56 |
| 9074 | 1 | 2.56 |
| 9075 | 1 | 2.56 |
| 9076 | 1 | 2.55 |
| 9077 | 1 | 2.55 |
| 9078 | 1 | 2.55 |
| 9079 | 1 | 2.54 |
| 9080 | 1 | 2.54 |
| 9081 | 1 | 2.54 |
| 9082 | 1 | 2.53 |
| 9083 | 1 | 2.53 |
| 9084 | 1 | 2.53 |
| 9085 | 1 | 2.52 |
| 9086 | 1 | 2.52 |
| 9087 | 1 | 2.52 |
| 9088 | 1 | 2.51 |
| 9089 | 1 | 2.51 |
| 9090 | 1 | 2.5 |
| 9091 | 1 | 2.5 |
| 9092 | 1 | 2.49 |
| 9093 | 1 | 2.49 |
| 9094 | 1 | 2.49 |
| 9095 | 1 | 2.48 |
| 9096 | 1 | 2.48 |
| 9097 | 1 | 2.47 |
| 9098 | 1 | 2.46 |
| 9099 | 1 | 2.46 |
| 9100 | 1 | 2.46 |
| 9101 | 1 | 2.45 |
| 9102 | 1 | 2.44 |
| 9103 | 1 | 2.44 |
| 9104 | 1 | 2.43 |
| 9105 | 1 | 2.43 |
| 9106 | 1 | 2.42 |
| 9107 | 1 | 2.41 |
| 9108 | 1 | 2.4 |
| 9109 | 1 | 2.39 |
| 9110 | 1 | 2.38 |
| 9111 | 1 | 2.37 |
| 9112 | 1 | 2.36 |
| 9113 | 1 | 2.35 |
| 9114 | 1 | 2.34 |
| 9115 | 1 | 2.33 |
| 9116 | 1 | 2.32 |
| 9117 | 1 | 2.31 |
| 9118 | 1 | 2.29 |
| 9119 | 1 | 2.28 |
| 9120 | 1 | 2.26 |
| 9121 | 1 | 2.25 |
| 9122 | 1 | 2.23 |
| 9123 | 1 | 2.21 |
| 9124 | 1 | 2.2 |
| 9125 | 1 | 2.18 |
| 9126 | 1 | 2.16 |
| 9127 | 1 | 2.14 |
| 9128 | 1 | 2.12 |
| 9129 | 1 | 2.1 |
| 9130 | 1 | 2.08 |
| 9131 | 1 | 2.07 |
| 9132 | 1 | 2.05 |
| 9133 | 1 | 2.03 |
| 9134 | 1 | 2.02 |
| 9135 | 1 | 2 |
| 9136 | 1 | 1.98 |